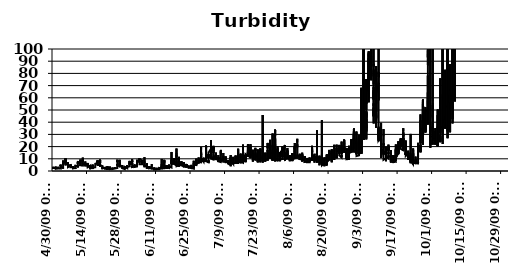
| Category | NTU+ |
|---|---|
| 10/13/09 | 278.3 |
| 10/13/09 | 351.7 |
| 10/13/09 | 341.5 |
| 10/13/09 | 374.3 |
| 10/13/09 | 356.8 |
| 10/13/09 | 467.9 |
| 10/13/09 | 334.9 |
| 10/13/09 | 360.1 |
| 10/13/09 | 397 |
| 10/13/09 | 462.3 |
| 10/13/09 | 480.1 |
| 10/13/09 | 417.3 |
| 10/13/09 | 397 |
| 10/13/09 | 322.1 |
| 10/13/09 | 398.7 |
| 10/13/09 | 443.3 |
| 10/13/09 | 431.3 |
| 10/13/09 | 326.5 |
| 10/13/09 | 324.2 |
| 10/13/09 | 279.3 |
| 10/13/09 | 333.7 |
| 10/13/09 | 413.7 |
| 10/13/09 | 371 |
| 10/13/09 | 259.3 |
| 10/13/09 | 312.1 |
| 10/13/09 | 371.3 |
| 10/13/09 | 406.8 |
| 10/13/09 | 246 |
| 10/13/09 | 353 |
| 10/13/09 | 290.1 |
| 10/13/09 | 267.4 |
| 10/13/09 | 258.8 |
| 10/12/09 | 231.3 |
| 10/12/09 | 265.2 |
| 10/12/09 | 323.3 |
| 10/12/09 | 389.3 |
| 10/12/09 | 247.5 |
| 10/12/09 | 388.7 |
| 10/12/09 | 309.3 |
| 10/12/09 | 401.6 |
| 10/12/09 | 286.8 |
| 10/12/09 | 346.5 |
| 10/12/09 | 309.7 |
| 10/12/09 | 262 |
| 10/12/09 | 407.6 |
| 10/12/09 | 256.8 |
| 10/12/09 | 244.1 |
| 10/12/09 | 292.5 |
| 10/12/09 | 343 |
| 10/12/09 | 330 |
| 10/12/09 | 330.2 |
| 10/12/09 | 268.9 |
| 10/12/09 | 172.9 |
| 10/12/09 | 297.4 |
| 10/12/09 | 386.1 |
| 10/12/09 | 366.4 |
| 10/12/09 | 293.3 |
| 10/12/09 | 247.3 |
| 10/12/09 | 261.1 |
| 10/12/09 | 246.8 |
| 10/12/09 | 314.5 |
| 10/12/09 | 267.8 |
| 10/12/09 | 249.2 |
| 10/12/09 | 360.6 |
| 10/12/09 | 311 |
| 10/12/09 | 242.1 |
| 10/12/09 | 305.1 |
| 10/12/09 | 356.8 |
| 10/12/09 | 255.4 |
| 10/12/09 | 294.5 |
| 10/12/09 | 233.5 |
| 10/12/09 | 268.3 |
| 10/12/09 | 257.7 |
| 10/12/09 | 225.5 |
| 10/12/09 | 236.6 |
| 10/12/09 | 223.3 |
| 10/12/09 | 243.2 |
| 10/12/09 | 181.4 |
| 10/12/09 | 203.1 |
| 10/12/09 | 275.2 |
| 10/11/09 | 188 |
| 10/11/09 | 259.4 |
| 10/11/09 | 214.6 |
| 10/11/09 | 223.5 |
| 10/11/09 | 187.9 |
| 10/11/09 | 250.5 |
| 10/11/09 | 194.9 |
| 10/11/09 | 180.2 |
| 10/11/09 | 167.1 |
| 10/11/09 | 175.7 |
| 10/11/09 | 244.9 |
| 10/11/09 | 192.4 |
| 10/11/09 | 234.8 |
| 10/11/09 | 199.2 |
| 10/11/09 | 176.3 |
| 10/11/09 | 192 |
| 10/11/09 | 196.7 |
| 10/11/09 | 161.6 |
| 10/11/09 | 229.2 |
| 10/11/09 | 154.7 |
| 10/11/09 | 216.6 |
| 10/11/09 | 164.1 |
| 10/11/09 | 168.3 |
| 10/11/09 | 207.1 |
| 10/11/09 | 207.8 |
| 10/11/09 | 180.9 |
| 10/11/09 | 154.1 |
| 10/11/09 | 210.3 |
| 10/11/09 | 138.2 |
| 10/11/09 | 117.1 |
| 10/11/09 | 183.8 |
| 10/11/09 | 161.6 |
| 10/11/09 | 165.5 |
| 10/11/09 | 172.6 |
| 10/11/09 | 143.6 |
| 10/11/09 | 168.5 |
| 10/11/09 | 162.3 |
| 10/11/09 | 166.5 |
| 10/11/09 | 159.9 |
| 10/11/09 | 151.6 |
| 10/11/09 | 183.7 |
| 10/11/09 | 173.5 |
| 10/11/09 | 215.2 |
| 10/11/09 | 182.6 |
| 10/11/09 | 170.6 |
| 10/11/09 | 149.2 |
| 10/11/09 | 185.9 |
| 10/11/09 | 190 |
| 10/10/09 | 144.2 |
| 10/10/09 | 136.7 |
| 10/10/09 | 181.6 |
| 10/10/09 | 107.9 |
| 10/10/09 | 125.6 |
| 10/10/09 | 152.8 |
| 10/10/09 | 103 |
| 10/10/09 | 99.2 |
| 10/10/09 | 187.7 |
| 10/10/09 | 109.3 |
| 10/10/09 | 127.7 |
| 10/10/09 | 137.6 |
| 10/10/09 | 108.8 |
| 10/10/09 | 123.5 |
| 10/10/09 | 104.4 |
| 10/10/09 | 116.7 |
| 10/10/09 | 120.9 |
| 10/10/09 | 140.1 |
| 10/10/09 | 147.8 |
| 10/10/09 | 154.3 |
| 10/10/09 | 134.5 |
| 10/10/09 | 72.2 |
| 10/10/09 | 158.1 |
| 10/10/09 | 104.5 |
| 10/10/09 | 121.8 |
| 10/10/09 | 127.5 |
| 10/10/09 | 126.6 |
| 10/10/09 | 117.8 |
| 10/10/09 | 92.7 |
| 10/10/09 | 97 |
| 10/10/09 | 118.3 |
| 10/10/09 | 130.5 |
| 10/10/09 | 96.6 |
| 10/10/09 | 141 |
| 10/10/09 | 99.2 |
| 10/10/09 | 123.4 |
| 10/10/09 | 105 |
| 10/10/09 | 165.4 |
| 10/10/09 | 92.7 |
| 10/10/09 | 81.4 |
| 10/10/09 | 114.4 |
| 10/10/09 | 92.6 |
| 10/10/09 | 142.3 |
| 10/10/09 | 124.1 |
| 10/10/09 | 112.4 |
| 10/10/09 | 71 |
| 10/10/09 | 57 |
| 10/10/09 | 77.9 |
| 10/9/09 | 123.4 |
| 10/9/09 | 72 |
| 10/9/09 | 90.5 |
| 10/9/09 | 106.5 |
| 10/9/09 | 103.2 |
| 10/9/09 | 111.6 |
| 10/9/09 | 95 |
| 10/9/09 | 89.1 |
| 10/9/09 | 76.3 |
| 10/9/09 | 99 |
| 10/9/09 | 105.6 |
| 10/9/09 | 79.4 |
| 10/9/09 | 92.7 |
| 10/9/09 | 89.6 |
| 10/9/09 | 57.4 |
| 10/9/09 | 113.1 |
| 10/9/09 | 108.4 |
| 10/9/09 | 53.5 |
| 10/9/09 | 92.5 |
| 10/9/09 | 79.1 |
| 10/9/09 | 80.3 |
| 10/9/09 | 96.2 |
| 10/9/09 | 102.9 |
| 10/9/09 | 52 |
| 10/9/09 | 61 |
| 10/9/09 | 73.4 |
| 10/9/09 | 51.7 |
| 10/9/09 | 95.4 |
| 10/9/09 | 102.8 |
| 10/9/09 | 67.5 |
| 10/9/09 | 91.2 |
| 10/9/09 | 54.4 |
| 10/9/09 | 103.6 |
| 10/9/09 | 339 |
| 10/9/09 | 53.7 |
| 10/9/09 | 79.1 |
| 10/9/09 | 90.8 |
| 10/9/09 | 52.3 |
| 10/9/09 | 51.5 |
| 10/9/09 | 39 |
| 10/9/09 | 54.4 |
| 10/9/09 | 89.7 |
| 10/9/09 | 42.5 |
| 10/9/09 | 52.8 |
| 10/9/09 | 52.8 |
| 10/9/09 | 79.8 |
| 10/9/09 | 97.6 |
| 10/9/09 | 55.6 |
| 10/8/09 | 65.3 |
| 10/8/09 | 67.8 |
| 10/8/09 | 58.9 |
| 10/8/09 | 53.3 |
| 10/8/09 | 77.9 |
| 10/8/09 | 55.8 |
| 10/8/09 | 50 |
| 10/8/09 | 31.7 |
| 10/8/09 | 60 |
| 10/8/09 | 58.5 |
| 10/8/09 | 55 |
| 10/8/09 | 75.5 |
| 10/8/09 | 57.1 |
| 10/8/09 | 59.7 |
| 10/8/09 | 67.8 |
| 10/8/09 | 60.8 |
| 10/8/09 | 54.1 |
| 10/8/09 | 53.4 |
| 10/8/09 | 55.6 |
| 10/8/09 | 87.7 |
| 10/8/09 | 53.5 |
| 10/8/09 | 53.6 |
| 10/8/09 | 51.6 |
| 10/8/09 | 54.9 |
| 10/8/09 | 57.3 |
| 10/8/09 | 49.8 |
| 10/8/09 | 55.4 |
| 10/8/09 | 52.8 |
| 10/8/09 | 61.4 |
| 10/8/09 | 81.8 |
| 10/8/09 | 75.7 |
| 10/8/09 | 74.7 |
| 10/8/09 | 49.7 |
| 10/8/09 | 52.8 |
| 10/8/09 | 68.1 |
| 10/8/09 | 68.8 |
| 10/8/09 | 49.9 |
| 10/8/09 | 72.5 |
| 10/8/09 | 63.6 |
| 10/8/09 | 50.3 |
| 10/8/09 | 54.6 |
| 10/8/09 | 51.6 |
| 10/8/09 | 65.2 |
| 10/8/09 | 69.2 |
| 10/8/09 | 53.2 |
| 10/8/09 | 56.2 |
| 10/8/09 | 51.6 |
| 10/8/09 | 50 |
| 10/7/09 | 64.2 |
| 10/7/09 | 49.5 |
| 10/7/09 | 49.5 |
| 10/7/09 | 52.5 |
| 10/7/09 | 69.6 |
| 10/7/09 | 72.8 |
| 10/7/09 | 51.8 |
| 10/7/09 | 69 |
| 10/7/09 | 50.6 |
| 10/7/09 | 50.2 |
| 10/7/09 | 55.8 |
| 10/7/09 | 57.1 |
| 10/7/09 | 56.1 |
| 10/7/09 | 105.7 |
| 10/7/09 | 46.2 |
| 10/7/09 | 60.2 |
| 10/7/09 | 46.5 |
| 10/7/09 | 137.5 |
| 10/7/09 | 41.1 |
| 10/7/09 | 62.8 |
| 10/7/09 | 46.7 |
| 10/7/09 | 35.7 |
| 10/7/09 | 85.7 |
| 10/7/09 | 59.6 |
| 10/7/09 | 33.6 |
| 10/7/09 | 50.6 |
| 10/7/09 | 177.2 |
| 10/7/09 | 65.4 |
| 10/7/09 | 116.8 |
| 10/7/09 | 49.3 |
| 10/7/09 | 54.2 |
| 10/7/09 | 26.9 |
| 10/7/09 | 56.5 |
| 10/7/09 | 63.1 |
| 10/7/09 | 60.3 |
| 10/7/09 | 174.4 |
| 10/7/09 | 119.4 |
| 10/7/09 | 45.3 |
| 10/7/09 | 32.4 |
| 10/7/09 | 200.7 |
| 10/7/09 | 57.8 |
| 10/7/09 | 56.8 |
| 10/7/09 | 74 |
| 10/7/09 | 54.9 |
| 10/7/09 | 61.4 |
| 10/7/09 | 53.6 |
| 10/7/09 | 54.6 |
| 10/7/09 | 52.8 |
| 10/6/09 | 53.1 |
| 10/6/09 | 53.5 |
| 10/6/09 | 47.2 |
| 10/6/09 | 53.6 |
| 10/6/09 | 47.5 |
| 10/6/09 | 52.6 |
| 10/6/09 | 46.9 |
| 10/6/09 | 47.8 |
| 10/6/09 | 49.1 |
| 10/6/09 | 52.4 |
| 10/6/09 | 55.5 |
| 10/6/09 | 34.7 |
| 10/6/09 | 48.9 |
| 10/6/09 | 36.5 |
| 10/6/09 | 42.5 |
| 10/6/09 | 83 |
| 10/6/09 | 45.7 |
| 10/6/09 | 48 |
| 10/6/09 | 50.6 |
| 10/6/09 | 47.5 |
| 10/6/09 | 58.1 |
| 10/6/09 | 62.4 |
| 10/6/09 | 40.3 |
| 10/6/09 | 42.4 |
| 10/6/09 | 45 |
| 10/6/09 | 44.3 |
| 10/6/09 | 57 |
| 10/6/09 | 47.3 |
| 10/6/09 | 44.1 |
| 10/6/09 | 48.4 |
| 10/6/09 | 56.3 |
| 10/6/09 | 45.6 |
| 10/6/09 | 46.4 |
| 10/6/09 | 74.3 |
| 10/6/09 | 82.3 |
| 10/6/09 | 46.4 |
| 10/6/09 | 49.9 |
| 10/6/09 | 52.9 |
| 10/6/09 | 42.2 |
| 10/6/09 | 44.9 |
| 10/6/09 | 44.4 |
| 10/6/09 | 62.5 |
| 10/6/09 | 44.5 |
| 10/6/09 | 45.2 |
| 10/6/09 | 39.9 |
| 10/6/09 | 46.1 |
| 10/6/09 | 38.8 |
| 10/6/09 | 45.3 |
| 10/5/09 | 38.6 |
| 10/5/09 | 39.1 |
| 10/5/09 | 62.7 |
| 10/5/09 | 37.6 |
| 10/5/09 | 39.5 |
| 10/5/09 | 40.3 |
| 10/5/09 | 43.2 |
| 10/5/09 | 44 |
| 10/5/09 | 44.2 |
| 10/5/09 | 45 |
| 10/5/09 | 41.3 |
| 10/5/09 | 43.1 |
| 10/5/09 | 50.7 |
| 10/5/09 | 32.2 |
| 10/5/09 | 40.8 |
| 10/5/09 | 45.9 |
| 10/5/09 | 41.8 |
| 10/5/09 | 37.4 |
| 10/5/09 | 49.5 |
| 10/5/09 | 125.3 |
| 10/5/09 | 41.4 |
| 10/5/09 | 38.4 |
| 10/5/09 | 103.8 |
| 10/5/09 | 45.8 |
| 10/5/09 | 39.4 |
| 10/5/09 | 32.4 |
| 10/5/09 | 40.4 |
| 10/5/09 | 37.2 |
| 10/5/09 | 37.1 |
| 10/5/09 | 49.3 |
| 10/5/09 | 36.8 |
| 10/5/09 | 45.1 |
| 10/5/09 | 35.8 |
| 10/5/09 | 36 |
| 10/5/09 | 35.2 |
| 10/5/09 | 38.7 |
| 10/5/09 | 39.8 |
| 10/5/09 | 37.3 |
| 10/5/09 | 33.8 |
| 10/5/09 | 30.1 |
| 10/5/09 | 32.3 |
| 10/5/09 | 50.2 |
| 10/5/09 | 37.3 |
| 10/5/09 | 33.7 |
| 10/5/09 | 22.2 |
| 10/5/09 | 33.8 |
| 10/5/09 | 36.3 |
| 10/5/09 | 35.5 |
| 10/4/09 | 36 |
| 10/4/09 | 35.6 |
| 10/4/09 | 35.1 |
| 10/4/09 | 40.1 |
| 10/4/09 | 34.4 |
| 10/4/09 | 37 |
| 10/4/09 | 35.1 |
| 10/4/09 | 33.1 |
| 10/4/09 | 31.4 |
| 10/4/09 | 36.2 |
| 10/4/09 | 41.8 |
| 10/4/09 | 40.2 |
| 10/4/09 | 35 |
| 10/4/09 | 37.3 |
| 10/4/09 | 31.3 |
| 10/4/09 | 33.9 |
| 10/4/09 | 34.7 |
| 10/4/09 | 33.4 |
| 10/4/09 | 31.9 |
| 10/4/09 | 34.2 |
| 10/4/09 | 32.4 |
| 10/4/09 | 31.8 |
| 10/4/09 | 44.4 |
| 10/4/09 | 60.5 |
| 10/4/09 | 42.1 |
| 10/4/09 | 75.9 |
| 10/4/09 | 30 |
| 10/4/09 | 29.1 |
| 10/4/09 | 28.1 |
| 10/4/09 | 26.4 |
| 10/4/09 | 28.5 |
| 10/4/09 | 25.3 |
| 10/4/09 | 29.4 |
| 10/4/09 | 27.9 |
| 10/4/09 | 24.4 |
| 10/4/09 | 24.6 |
| 10/4/09 | 23.8 |
| 10/4/09 | 25.6 |
| 10/4/09 | 28.4 |
| 10/4/09 | 23.6 |
| 10/4/09 | 24.3 |
| 10/4/09 | 24.2 |
| 10/4/09 | 25.3 |
| 10/4/09 | 24.8 |
| 10/4/09 | 25.3 |
| 10/4/09 | 24.1 |
| 10/4/09 | 27.3 |
| 10/4/09 | 25.5 |
| 10/3/09 | 24.3 |
| 10/3/09 | 25.1 |
| 10/3/09 | 25.8 |
| 10/3/09 | 22.2 |
| 10/3/09 | 22.5 |
| 10/3/09 | 23.9 |
| 10/3/09 | 21.8 |
| 10/3/09 | 25 |
| 10/3/09 | 27.8 |
| 10/3/09 | 27.6 |
| 10/3/09 | 26.7 |
| 10/3/09 | 22.7 |
| 10/3/09 | 28.6 |
| 10/3/09 | 28.4 |
| 10/3/09 | 27 |
| 10/3/09 | 35.5 |
| 10/3/09 | 30.4 |
| 10/3/09 | 30.5 |
| 10/3/09 | 31.6 |
| 10/3/09 | 36.5 |
| 10/3/09 | 36.9 |
| 10/3/09 | 29.6 |
| 10/3/09 | 28.7 |
| 10/3/09 | 45.8 |
| 10/3/09 | 31.5 |
| 10/3/09 | 31.8 |
| 10/3/09 | 28.8 |
| 10/3/09 | 29.3 |
| 10/3/09 | 26 |
| 10/3/09 | 26.9 |
| 10/3/09 | 27.4 |
| 10/3/09 | 25.3 |
| 10/3/09 | 24.2 |
| 10/3/09 | 24.2 |
| 10/3/09 | 23.6 |
| 10/3/09 | 23.9 |
| 10/3/09 | 50.4 |
| 10/3/09 | 27.3 |
| 10/3/09 | 22.8 |
| 10/3/09 | 23.2 |
| 10/3/09 | 24.9 |
| 10/3/09 | 20.6 |
| 10/3/09 | 23.6 |
| 10/3/09 | 20.7 |
| 10/3/09 | 23.2 |
| 10/3/09 | 20.1 |
| 10/3/09 | 22.7 |
| 10/3/09 | 22 |
| 10/2/09 | 22.6 |
| 10/2/09 | 26 |
| 10/2/09 | 23.6 |
| 10/2/09 | 24.5 |
| 10/2/09 | 25.3 |
| 10/2/09 | 25 |
| 10/2/09 | 21.8 |
| 10/2/09 | 22.4 |
| 10/2/09 | 21.7 |
| 10/2/09 | 22.9 |
| 10/2/09 | 26.5 |
| 10/2/09 | 26.5 |
| 10/2/09 | 25.7 |
| 10/2/09 | 24.3 |
| 10/2/09 | 24.9 |
| 10/2/09 | 23.9 |
| 10/2/09 | 27.7 |
| 10/2/09 | 23.3 |
| 10/2/09 | 23.5 |
| 10/2/09 | 23.9 |
| 10/2/09 | 32.5 |
| 10/2/09 | 25.9 |
| 10/2/09 | 26.7 |
| 10/2/09 | 32.7 |
| 10/2/09 | 26.8 |
| 10/2/09 | 29.2 |
| 10/2/09 | 33.9 |
| 10/2/09 | 35.1 |
| 10/2/09 | 34.5 |
| 10/2/09 | 24.1 |
| 10/2/09 | 26.1 |
| 10/2/09 | 23.2 |
| 10/2/09 | 21.8 |
| 10/2/09 | 21.7 |
| 10/2/09 | 30.3 |
| 10/2/09 | 32.9 |
| 10/2/09 | 31.4 |
| 10/2/09 | 31.8 |
| 10/2/09 | 31.5 |
| 10/2/09 | 30.8 |
| 10/2/09 | 31.8 |
| 10/2/09 | 31.2 |
| 10/2/09 | 27.9 |
| 10/2/09 | 29.4 |
| 10/2/09 | 27.3 |
| 10/2/09 | 26.4 |
| 10/2/09 | 29.2 |
| 10/2/09 | 26.4 |
| 10/1/09 | 27.2 |
| 10/1/09 | 26.5 |
| 10/1/09 | 26 |
| 10/1/09 | 25.8 |
| 10/1/09 | 25.4 |
| 10/1/09 | 25.6 |
| 10/1/09 | 25.2 |
| 10/1/09 | 21.6 |
| 10/1/09 | 24.2 |
| 10/1/09 | 26.9 |
| 10/1/09 | 24.9 |
| 10/1/09 | 55.8 |
| 10/1/09 | 56.5 |
| 10/1/09 | 112.1 |
| 10/1/09 | 57.5 |
| 10/1/09 | 50.5 |
| 10/1/09 | 50.2 |
| 10/1/09 | 43.1 |
| 10/1/09 | 54.1 |
| 10/1/09 | 44.2 |
| 10/1/09 | 46.1 |
| 10/1/09 | 45.1 |
| 10/1/09 | 43.8 |
| 10/1/09 | 33.8 |
| 10/1/09 | 37.2 |
| 10/1/09 | 34.3 |
| 10/1/09 | 33.9 |
| 10/1/09 | 34.5 |
| 10/1/09 | 34.6 |
| 10/1/09 | 32 |
| 10/1/09 | 32.5 |
| 10/1/09 | 39.2 |
| 10/1/09 | 35.1 |
| 10/1/09 | 36 |
| 10/1/09 | 33.6 |
| 10/1/09 | 34.2 |
| 10/1/09 | 32.1 |
| 10/1/09 | 29.7 |
| 10/1/09 | 31.9 |
| 10/1/09 | 32 |
| 10/1/09 | 31 |
| 10/1/09 | 31.2 |
| 10/1/09 | 34 |
| 10/1/09 | 31.5 |
| 10/1/09 | 30.2 |
| 10/1/09 | 27.5 |
| 10/1/09 | 28.9 |
| 10/1/09 | 28.1 |
| 9/30/09 | 27.7 |
| 9/30/09 | 27.7 |
| 9/30/09 | 27.5 |
| 9/30/09 | 27.6 |
| 9/30/09 | 27.6 |
| 9/30/09 | 23.4 |
| 9/30/09 | 23.2 |
| 9/30/09 | 24.7 |
| 9/30/09 | 24.5 |
| 9/30/09 | 21.5 |
| 9/30/09 | 22.4 |
| 9/30/09 | 22.2 |
| 9/30/09 | 23.6 |
| 9/30/09 | 24.6 |
| 9/30/09 | 23.8 |
| 9/30/09 | 22.6 |
| 9/30/09 | 24.7 |
| 9/30/09 | 25.6 |
| 9/30/09 | 33.9 |
| 9/30/09 | 33 |
| 9/30/09 | 35.8 |
| 9/30/09 | 31.7 |
| 9/30/09 | 29.3 |
| 9/30/09 | 21.6 |
| 9/30/09 | 23 |
| 9/30/09 | 22.2 |
| 9/30/09 | 22.7 |
| 9/30/09 | 21.9 |
| 9/30/09 | 20.9 |
| 9/30/09 | 20.6 |
| 9/30/09 | 21 |
| 9/30/09 | 19.1 |
| 9/30/09 | 405 |
| 9/30/09 | 254.8 |
| 9/30/09 | 193.4 |
| 9/30/09 | 349 |
| 9/30/09 | 346.5 |
| 9/30/09 | 355.3 |
| 9/30/09 | 255.5 |
| 9/30/09 | 344.3 |
| 9/30/09 | 363.3 |
| 9/30/09 | 180 |
| 9/30/09 | 310.7 |
| 9/30/09 | 314.4 |
| 9/30/09 | 266.2 |
| 9/30/09 | 23.5 |
| 9/30/09 | 25.7 |
| 9/30/09 | 103.1 |
| 9/29/09 | 86.7 |
| 9/29/09 | 92.3 |
| 9/29/09 | 95 |
| 9/29/09 | 97.7 |
| 9/29/09 | 100 |
| 9/29/09 | 93 |
| 9/29/09 | 96 |
| 9/29/09 | 96.3 |
| 9/29/09 | 98.9 |
| 9/29/09 | 93.1 |
| 9/29/09 | 57 |
| 9/29/09 | 78.2 |
| 9/29/09 | 78.9 |
| 9/29/09 | 51.7 |
| 9/29/09 | 64.4 |
| 9/29/09 | 42.3 |
| 9/29/09 | 48.9 |
| 9/29/09 | 57.1 |
| 9/29/09 | 57.2 |
| 9/29/09 | 54.3 |
| 9/29/09 | 48.8 |
| 9/29/09 | 52 |
| 9/29/09 | 44.4 |
| 9/29/09 | 46.2 |
| 9/29/09 | 45.8 |
| 9/29/09 | 44.2 |
| 9/29/09 | 46.5 |
| 9/29/09 | 52.1 |
| 9/29/09 | 57.9 |
| 9/29/09 | 47.3 |
| 9/29/09 | 42.1 |
| 9/29/09 | 42.3 |
| 9/29/09 | 42.8 |
| 9/29/09 | 39.6 |
| 9/29/09 | 47.4 |
| 9/29/09 | 51.6 |
| 9/29/09 | 50.7 |
| 9/29/09 | 42 |
| 9/29/09 | 42.6 |
| 9/29/09 | 40.3 |
| 9/29/09 | 42.9 |
| 9/29/09 | 41.2 |
| 9/29/09 | 38 |
| 9/29/09 | 39.4 |
| 9/29/09 | 42.9 |
| 9/29/09 | 60 |
| 9/29/09 | 50.7 |
| 9/29/09 | 47.9 |
| 9/28/09 | 50.8 |
| 9/28/09 | 49.3 |
| 9/28/09 | 46.4 |
| 9/28/09 | 45.4 |
| 9/28/09 | 44.8 |
| 9/28/09 | 45.8 |
| 9/28/09 | 44.6 |
| 9/28/09 | 43.3 |
| 9/28/09 | 41 |
| 9/28/09 | 37.8 |
| 9/28/09 | 34.7 |
| 9/28/09 | 41.1 |
| 9/28/09 | 45.8 |
| 9/28/09 | 40.1 |
| 9/28/09 | 40.4 |
| 9/28/09 | 39.2 |
| 9/28/09 | 39.4 |
| 9/28/09 | 35.2 |
| 9/28/09 | 37.6 |
| 9/28/09 | 37 |
| 9/28/09 | 37.6 |
| 9/28/09 | 33.5 |
| 9/28/09 | 37.4 |
| 9/28/09 | 31.5 |
| 9/28/09 | 31.8 |
| 9/28/09 | 35.9 |
| 9/28/09 | 41.4 |
| 9/28/09 | 52.4 |
| 9/28/09 | 38.2 |
| 9/28/09 | 41.9 |
| 9/28/09 | 48.1 |
| 9/28/09 | 46.9 |
| 9/28/09 | 33.5 |
| 9/28/09 | 47.5 |
| 9/28/09 | 40.3 |
| 9/28/09 | 44.6 |
| 9/28/09 | 35.8 |
| 9/28/09 | 39 |
| 9/28/09 | 41.4 |
| 9/28/09 | 49.8 |
| 9/28/09 | 48.4 |
| 9/28/09 | 36.3 |
| 9/28/09 | 44.4 |
| 9/28/09 | 32.3 |
| 9/28/09 | 36.8 |
| 9/28/09 | 41.3 |
| 9/28/09 | 34.5 |
| 9/28/09 | 45.5 |
| 9/27/09 | 29.5 |
| 9/27/09 | 29 |
| 9/27/09 | 28.6 |
| 9/27/09 | 28.9 |
| 9/27/09 | 33.8 |
| 9/27/09 | 27.9 |
| 9/27/09 | 21.4 |
| 9/27/09 | 27.6 |
| 9/27/09 | 32.6 |
| 9/27/09 | 30.2 |
| 9/27/09 | 29.5 |
| 9/27/09 | 26.8 |
| 9/27/09 | 34.8 |
| 9/27/09 | 37.5 |
| 9/27/09 | 26.3 |
| 9/27/09 | 30.6 |
| 9/27/09 | 37.5 |
| 9/27/09 | 27.6 |
| 9/27/09 | 33.1 |
| 9/27/09 | 31.5 |
| 9/27/09 | 32.3 |
| 9/27/09 | 58.7 |
| 9/27/09 | 56.4 |
| 9/27/09 | 37.4 |
| 9/27/09 | 57.1 |
| 9/27/09 | 40.2 |
| 9/27/09 | 55 |
| 9/27/09 | 45.7 |
| 9/27/09 | 48 |
| 9/27/09 | 46.6 |
| 9/27/09 | 58.1 |
| 9/27/09 | 43.8 |
| 9/27/09 | 33.4 |
| 9/27/09 | 46.5 |
| 9/27/09 | 43.2 |
| 9/27/09 | 33.4 |
| 9/27/09 | 30.8 |
| 9/27/09 | 45.4 |
| 9/27/09 | 38.6 |
| 9/27/09 | 44.4 |
| 9/27/09 | 51.3 |
| 9/27/09 | 32.9 |
| 9/27/09 | 38.5 |
| 9/27/09 | 44 |
| 9/27/09 | 45.9 |
| 9/27/09 | 42.7 |
| 9/27/09 | 41.6 |
| 9/27/09 | 35.8 |
| 9/26/09 | 33.3 |
| 9/26/09 | 29.7 |
| 9/26/09 | 41.6 |
| 9/26/09 | 40.6 |
| 9/26/09 | 29.3 |
| 9/26/09 | 28 |
| 9/26/09 | 32 |
| 9/26/09 | 46.4 |
| 9/26/09 | 36.1 |
| 9/26/09 | 27.9 |
| 9/26/09 | 33.6 |
| 9/26/09 | 31.6 |
| 9/26/09 | 33.6 |
| 9/26/09 | 30.5 |
| 9/26/09 | 31.8 |
| 9/26/09 | 28.1 |
| 9/26/09 | 26.2 |
| 9/26/09 | 30.5 |
| 9/26/09 | 25.3 |
| 9/26/09 | 29 |
| 9/26/09 | 26 |
| 9/26/09 | 25.8 |
| 9/26/09 | 29.3 |
| 9/26/09 | 22.8 |
| 9/26/09 | 23.2 |
| 9/26/09 | 23.8 |
| 9/26/09 | 22.7 |
| 9/26/09 | 27.2 |
| 9/26/09 | 25.5 |
| 9/26/09 | 22.5 |
| 9/26/09 | 18.6 |
| 9/26/09 | 18.7 |
| 9/26/09 | 16.5 |
| 9/26/09 | 18.3 |
| 9/26/09 | 17.1 |
| 9/26/09 | 21.5 |
| 9/26/09 | 17.6 |
| 9/26/09 | 15.3 |
| 9/26/09 | 17.2 |
| 9/26/09 | 18.2 |
| 9/26/09 | 21.1 |
| 9/26/09 | 15.5 |
| 9/26/09 | 20.2 |
| 9/26/09 | 21.6 |
| 9/26/09 | 16.2 |
| 9/26/09 | 18 |
| 9/26/09 | 18.8 |
| 9/26/09 | 18.3 |
| 9/25/09 | 17.7 |
| 9/25/09 | 18.2 |
| 9/25/09 | 17.2 |
| 9/25/09 | 15.5 |
| 9/25/09 | 13.5 |
| 9/25/09 | 12.5 |
| 9/25/09 | 11.4 |
| 9/25/09 | 11.8 |
| 9/25/09 | 13.6 |
| 9/25/09 | 13.3 |
| 9/25/09 | 13.2 |
| 9/25/09 | 13.9 |
| 9/25/09 | 14 |
| 9/25/09 | 14.7 |
| 9/25/09 | 15.5 |
| 9/25/09 | 15.8 |
| 9/25/09 | 15 |
| 9/25/09 | 15.3 |
| 9/25/09 | 17.2 |
| 9/25/09 | 19.8 |
| 9/25/09 | 15.1 |
| 9/25/09 | 18.3 |
| 9/25/09 | 16.5 |
| 9/25/09 | 19.8 |
| 9/25/09 | 18.2 |
| 9/25/09 | 21.8 |
| 9/25/09 | 16.1 |
| 9/25/09 | 16.6 |
| 9/25/09 | 20 |
| 9/25/09 | 23.1 |
| 9/25/09 | 21.5 |
| 9/25/09 | 19.5 |
| 9/25/09 | 17.3 |
| 9/25/09 | 15.9 |
| 9/25/09 | 15.6 |
| 9/25/09 | 13.3 |
| 9/25/09 | 11.1 |
| 9/25/09 | 10 |
| 9/25/09 | 10.1 |
| 9/25/09 | 9 |
| 9/25/09 | 7.3 |
| 9/25/09 | 6.4 |
| 9/25/09 | 6.6 |
| 9/25/09 | 7.6 |
| 9/25/09 | 6.2 |
| 9/25/09 | 6.3 |
| 9/25/09 | 6.9 |
| 9/25/09 | 6.4 |
| 9/24/09 | 6.4 |
| 9/24/09 | 6.1 |
| 9/24/09 | 6.7 |
| 9/24/09 | 6.2 |
| 9/24/09 | 8.3 |
| 9/24/09 | 6.8 |
| 9/24/09 | 7.2 |
| 9/24/09 | 6.5 |
| 9/24/09 | 8.1 |
| 9/24/09 | 6.5 |
| 9/24/09 | 7.1 |
| 9/24/09 | 9.8 |
| 9/24/09 | 9.1 |
| 9/24/09 | 8.7 |
| 9/24/09 | 7.6 |
| 9/24/09 | 8.8 |
| 9/24/09 | 8.8 |
| 9/24/09 | 6.8 |
| 9/24/09 | 7.7 |
| 9/24/09 | 8 |
| 9/24/09 | 8.9 |
| 9/24/09 | 10.5 |
| 9/24/09 | 11.8 |
| 9/24/09 | 10.4 |
| 9/24/09 | 9.8 |
| 9/24/09 | 8 |
| 9/24/09 | 7.4 |
| 9/24/09 | 8.3 |
| 9/24/09 | 8.2 |
| 9/24/09 | 7.9 |
| 9/24/09 | 7.5 |
| 9/24/09 | 7.3 |
| 9/24/09 | 7.4 |
| 9/24/09 | 7.8 |
| 9/24/09 | 7.8 |
| 9/24/09 | 7.9 |
| 9/24/09 | 7.1 |
| 9/24/09 | 7.2 |
| 9/24/09 | 7.8 |
| 9/24/09 | 8.5 |
| 9/24/09 | 8.4 |
| 9/24/09 | 8.3 |
| 9/24/09 | 7.2 |
| 9/24/09 | 6 |
| 9/24/09 | 6.9 |
| 9/24/09 | 8 |
| 9/24/09 | 6.4 |
| 9/24/09 | 7 |
| 9/23/09 | 6.6 |
| 9/23/09 | 6.5 |
| 9/23/09 | 6.6 |
| 9/23/09 | 6.5 |
| 9/23/09 | 6.7 |
| 9/23/09 | 7.6 |
| 9/23/09 | 8 |
| 9/23/09 | 8.2 |
| 9/23/09 | 7.6 |
| 9/23/09 | 8.4 |
| 9/23/09 | 7.3 |
| 9/23/09 | 8.6 |
| 9/23/09 | 9 |
| 9/23/09 | 11.5 |
| 9/23/09 | 10.5 |
| 9/23/09 | 9.7 |
| 9/23/09 | 14.6 |
| 9/23/09 | 14 |
| 9/23/09 | 10.4 |
| 9/23/09 | 10.9 |
| 9/23/09 | 11.6 |
| 9/23/09 | 12.7 |
| 9/23/09 | 11.6 |
| 9/23/09 | 14.2 |
| 9/23/09 | 13.8 |
| 9/23/09 | 16.3 |
| 9/23/09 | 17.4 |
| 9/23/09 | 12.5 |
| 9/23/09 | 13.5 |
| 9/23/09 | 18.5 |
| 9/23/09 | 11.6 |
| 9/23/09 | 10.8 |
| 9/23/09 | 10.8 |
| 9/23/09 | 9.9 |
| 9/23/09 | 8.5 |
| 9/23/09 | 8.6 |
| 9/23/09 | 7.7 |
| 9/23/09 | 6.8 |
| 9/23/09 | 7.2 |
| 9/23/09 | 6.7 |
| 9/23/09 | 6.6 |
| 9/23/09 | 5.8 |
| 9/23/09 | 7.1 |
| 9/23/09 | 5.5 |
| 9/23/09 | 6.2 |
| 9/23/09 | 5.2 |
| 9/23/09 | 5.7 |
| 9/23/09 | 5.7 |
| 9/22/09 | 8.5 |
| 9/22/09 | 8.8 |
| 9/22/09 | 13.6 |
| 9/22/09 | 10.8 |
| 9/22/09 | 9.7 |
| 9/22/09 | 8.1 |
| 9/22/09 | 10.4 |
| 9/22/09 | 9 |
| 9/22/09 | 7.7 |
| 9/22/09 | 8.6 |
| 9/22/09 | 8 |
| 9/22/09 | 14.3 |
| 9/22/09 | 9.3 |
| 9/22/09 | 8.5 |
| 9/22/09 | 7.6 |
| 9/22/09 | 11.4 |
| 9/22/09 | 9.6 |
| 9/22/09 | 8.8 |
| 9/22/09 | 12.7 |
| 9/22/09 | 13.6 |
| 9/22/09 | 9.4 |
| 9/22/09 | 11 |
| 9/22/09 | 9.1 |
| 9/22/09 | 12.1 |
| 9/22/09 | 10.7 |
| 9/22/09 | 8.9 |
| 9/22/09 | 8.6 |
| 9/22/09 | 7.2 |
| 9/22/09 | 10.3 |
| 9/22/09 | 10.8 |
| 9/22/09 | 8.5 |
| 9/22/09 | 8 |
| 9/22/09 | 12.1 |
| 9/22/09 | 11.2 |
| 9/22/09 | 7.8 |
| 9/22/09 | 8 |
| 9/22/09 | 8.5 |
| 9/22/09 | 9 |
| 9/22/09 | 9.6 |
| 9/22/09 | 8.2 |
| 9/22/09 | 6.4 |
| 9/22/09 | 7.7 |
| 9/22/09 | 30.4 |
| 9/22/09 | 10.5 |
| 9/22/09 | 10.7 |
| 9/22/09 | 10.1 |
| 9/22/09 | 12.8 |
| 9/22/09 | 10.1 |
| 9/21/09 | 12.2 |
| 9/21/09 | 9.6 |
| 9/21/09 | 14.9 |
| 9/21/09 | 13.9 |
| 9/21/09 | 15 |
| 9/21/09 | 14.6 |
| 9/21/09 | 14.9 |
| 9/21/09 | 9.1 |
| 9/21/09 | 9.1 |
| 9/21/09 | 9.7 |
| 9/21/09 | 10.4 |
| 9/21/09 | 12.4 |
| 9/21/09 | 10.5 |
| 9/21/09 | 10.4 |
| 9/21/09 | 11.2 |
| 9/21/09 | 10.7 |
| 9/21/09 | 10.9 |
| 9/21/09 | 13.8 |
| 9/21/09 | 12.8 |
| 9/21/09 | 13.5 |
| 9/21/09 | 12.8 |
| 9/21/09 | 11.8 |
| 9/21/09 | 11.9 |
| 9/21/09 | 13.7 |
| 9/21/09 | 14.3 |
| 9/21/09 | 13 |
| 9/21/09 | 13.2 |
| 9/21/09 | 11.5 |
| 9/21/09 | 10.8 |
| 9/21/09 | 11.1 |
| 9/21/09 | 10.5 |
| 9/21/09 | 9.6 |
| 9/21/09 | 9.6 |
| 9/21/09 | 11.6 |
| 9/21/09 | 13.2 |
| 9/21/09 | 11 |
| 9/21/09 | 11 |
| 9/21/09 | 14.7 |
| 9/21/09 | 10.8 |
| 9/21/09 | 12.2 |
| 9/21/09 | 15.2 |
| 9/21/09 | 14.5 |
| 9/21/09 | 11.9 |
| 9/21/09 | 13.9 |
| 9/21/09 | 13.4 |
| 9/21/09 | 16.7 |
| 9/21/09 | 14.3 |
| 9/21/09 | 13.8 |
| 9/20/09 | 12.3 |
| 9/20/09 | 14.9 |
| 9/20/09 | 13.1 |
| 9/20/09 | 13 |
| 9/20/09 | 14.3 |
| 9/20/09 | 15.3 |
| 9/20/09 | 14.9 |
| 9/20/09 | 14.9 |
| 9/20/09 | 16.5 |
| 9/20/09 | 13.5 |
| 9/20/09 | 15.1 |
| 9/20/09 | 15.9 |
| 9/20/09 | 14.6 |
| 9/20/09 | 13.4 |
| 9/20/09 | 13.9 |
| 9/20/09 | 16.1 |
| 9/20/09 | 18.9 |
| 9/20/09 | 16.3 |
| 9/20/09 | 19.2 |
| 9/20/09 | 18.9 |
| 9/20/09 | 19 |
| 9/20/09 | 17.4 |
| 9/20/09 | 18.4 |
| 9/20/09 | 18.2 |
| 9/20/09 | 20.6 |
| 9/20/09 | 19.3 |
| 9/20/09 | 22.5 |
| 9/20/09 | 20.9 |
| 9/20/09 | 21.3 |
| 9/20/09 | 22.8 |
| 9/20/09 | 22.4 |
| 9/20/09 | 25 |
| 9/20/09 | 23.8 |
| 9/20/09 | 23.4 |
| 9/20/09 | 22.4 |
| 9/20/09 | 22.8 |
| 9/20/09 | 22.4 |
| 9/20/09 | 22.9 |
| 9/20/09 | 24.4 |
| 9/20/09 | 24.1 |
| 9/20/09 | 24.5 |
| 9/20/09 | 22.5 |
| 9/20/09 | 20.5 |
| 9/20/09 | 19.7 |
| 9/20/09 | 19.9 |
| 9/20/09 | 21.2 |
| 9/20/09 | 20 |
| 9/20/09 | 19.6 |
| 9/19/09 | 19.9 |
| 9/19/09 | 22.7 |
| 9/19/09 | 19.7 |
| 9/19/09 | 20.6 |
| 9/19/09 | 22.7 |
| 9/19/09 | 21 |
| 9/19/09 | 25.2 |
| 9/19/09 | 23.5 |
| 9/19/09 | 23.5 |
| 9/19/09 | 20.7 |
| 9/19/09 | 24 |
| 9/19/09 | 23.2 |
| 9/19/09 | 24 |
| 9/19/09 | 26.6 |
| 9/19/09 | 24.2 |
| 9/19/09 | 26.1 |
| 9/19/09 | 31.6 |
| 9/19/09 | 22.5 |
| 9/19/09 | 26.5 |
| 9/19/09 | 22.7 |
| 9/19/09 | 23.6 |
| 9/19/09 | 27 |
| 9/19/09 | 24.9 |
| 9/19/09 | 25.8 |
| 9/19/09 | 28.6 |
| 9/19/09 | 28.3 |
| 9/19/09 | 28.6 |
| 9/19/09 | 35.1 |
| 9/19/09 | 32.8 |
| 9/19/09 | 28.5 |
| 9/19/09 | 28.2 |
| 9/19/09 | 29.4 |
| 9/19/09 | 30.6 |
| 9/19/09 | 28.4 |
| 9/19/09 | 22.8 |
| 9/19/09 | 22.1 |
| 9/19/09 | 21.3 |
| 9/19/09 | 19 |
| 9/19/09 | 19.8 |
| 9/19/09 | 19.6 |
| 9/19/09 | 18.9 |
| 9/19/09 | 17.3 |
| 9/19/09 | 19.8 |
| 9/19/09 | 19.7 |
| 9/19/09 | 19.1 |
| 9/19/09 | 16.7 |
| 9/19/09 | 18.9 |
| 9/19/09 | 17 |
| 9/18/09 | 18.1 |
| 9/18/09 | 19.2 |
| 9/18/09 | 19.9 |
| 9/18/09 | 19.8 |
| 9/18/09 | 21.7 |
| 9/18/09 | 19.9 |
| 9/18/09 | 20.6 |
| 9/18/09 | 19.8 |
| 9/18/09 | 21.8 |
| 9/18/09 | 20.8 |
| 9/18/09 | 21.9 |
| 9/18/09 | 24.6 |
| 9/18/09 | 23.4 |
| 9/18/09 | 23.7 |
| 9/18/09 | 20.7 |
| 9/18/09 | 24.9 |
| 9/18/09 | 26 |
| 9/18/09 | 26 |
| 9/18/09 | 23.8 |
| 9/18/09 | 24.3 |
| 9/18/09 | 22.4 |
| 9/18/09 | 23.3 |
| 9/18/09 | 23.6 |
| 9/18/09 | 24.8 |
| 9/18/09 | 24.6 |
| 9/18/09 | 22.5 |
| 9/18/09 | 23.1 |
| 9/18/09 | 21.9 |
| 9/18/09 | 26 |
| 9/18/09 | 25.3 |
| 9/18/09 | 26.9 |
| 9/18/09 | 27.5 |
| 9/18/09 | 26.3 |
| 9/18/09 | 23 |
| 9/18/09 | 22.4 |
| 9/18/09 | 22.6 |
| 9/18/09 | 20.1 |
| 9/18/09 | 24.7 |
| 9/18/09 | 20.6 |
| 9/18/09 | 20.9 |
| 9/18/09 | 22.8 |
| 9/18/09 | 26.6 |
| 9/18/09 | 23.3 |
| 9/18/09 | 22.1 |
| 9/18/09 | 21 |
| 9/18/09 | 20.5 |
| 9/18/09 | 20.6 |
| 9/18/09 | 21.1 |
| 9/17/09 | 19 |
| 9/17/09 | 20.5 |
| 9/17/09 | 18.6 |
| 9/17/09 | 18.3 |
| 9/17/09 | 17.3 |
| 9/17/09 | 20.1 |
| 9/17/09 | 16 |
| 9/17/09 | 19.3 |
| 9/17/09 | 19.4 |
| 9/17/09 | 17.2 |
| 9/17/09 | 15 |
| 9/17/09 | 16.1 |
| 9/17/09 | 18.2 |
| 9/17/09 | 17.7 |
| 9/17/09 | 17.8 |
| 9/17/09 | 16.7 |
| 9/17/09 | 16.2 |
| 9/17/09 | 18.3 |
| 9/17/09 | 19.9 |
| 9/17/09 | 19.8 |
| 9/17/09 | 19.6 |
| 9/17/09 | 20.1 |
| 9/17/09 | 18.7 |
| 9/17/09 | 20.7 |
| 9/17/09 | 19.9 |
| 9/17/09 | 19.9 |
| 9/17/09 | 22.5 |
| 9/17/09 | 21.1 |
| 9/17/09 | 24.3 |
| 9/17/09 | 20.2 |
| 9/17/09 | 21 |
| 9/17/09 | 18.8 |
| 9/17/09 | 20.2 |
| 9/17/09 | 20.5 |
| 9/17/09 | 16.9 |
| 9/17/09 | 16.9 |
| 9/17/09 | 14.1 |
| 9/17/09 | 18.1 |
| 9/17/09 | 18.3 |
| 9/17/09 | 16.4 |
| 9/17/09 | 14.6 |
| 9/17/09 | 16.4 |
| 9/17/09 | 15.8 |
| 9/17/09 | 16 |
| 9/17/09 | 15.3 |
| 9/17/09 | 13.7 |
| 9/17/09 | 14.9 |
| 9/17/09 | 15.3 |
| 9/16/09 | 10.8 |
| 9/16/09 | 15.2 |
| 9/16/09 | 13.9 |
| 9/16/09 | 11.7 |
| 9/16/09 | 14.5 |
| 9/16/09 | 13.8 |
| 9/16/09 | 14.4 |
| 9/16/09 | 12.8 |
| 9/16/09 | 12.9 |
| 9/16/09 | 13.1 |
| 9/16/09 | 16.2 |
| 9/16/09 | 17.8 |
| 9/16/09 | 16.2 |
| 9/16/09 | 14.6 |
| 9/16/09 | 14.3 |
| 9/16/09 | 15.5 |
| 9/16/09 | 17.1 |
| 9/16/09 | 15.9 |
| 9/16/09 | 16.6 |
| 9/16/09 | 16.8 |
| 9/16/09 | 18.5 |
| 9/16/09 | 15 |
| 9/16/09 | 16.1 |
| 9/16/09 | 16.5 |
| 9/16/09 | 20.2 |
| 9/16/09 | 21.8 |
| 9/16/09 | 21.2 |
| 9/16/09 | 19.4 |
| 9/16/09 | 18.2 |
| 9/16/09 | 18.5 |
| 9/16/09 | 15.6 |
| 9/16/09 | 13.8 |
| 9/16/09 | 14.1 |
| 9/16/09 | 10.1 |
| 9/16/09 | 11.1 |
| 9/16/09 | 8.4 |
| 9/16/09 | 8.3 |
| 9/16/09 | 8.3 |
| 9/16/09 | 7.9 |
| 9/16/09 | 8.8 |
| 9/16/09 | 8 |
| 9/16/09 | 8.1 |
| 9/16/09 | 11.2 |
| 9/16/09 | 9.5 |
| 9/16/09 | 8.3 |
| 9/16/09 | 9.8 |
| 9/16/09 | 8.4 |
| 9/16/09 | 7.5 |
| 9/15/09 | 7.8 |
| 9/15/09 | 6.8 |
| 9/15/09 | 8.3 |
| 9/15/09 | 8.8 |
| 9/15/09 | 11.7 |
| 9/15/09 | 10.6 |
| 9/15/09 | 11.6 |
| 9/15/09 | 12.3 |
| 9/15/09 | 12.6 |
| 9/15/09 | 12.2 |
| 9/15/09 | 12.9 |
| 9/15/09 | 12.3 |
| 9/15/09 | 12.6 |
| 9/15/09 | 13 |
| 9/15/09 | 8.6 |
| 9/15/09 | 12.7 |
| 9/15/09 | 11.7 |
| 9/15/09 | 11.5 |
| 9/15/09 | 12 |
| 9/15/09 | 13.1 |
| 9/15/09 | 11.9 |
| 9/15/09 | 11.7 |
| 9/15/09 | 11.3 |
| 9/15/09 | 11.8 |
| 9/15/09 | 10.5 |
| 9/15/09 | 9.4 |
| 9/15/09 | 11.5 |
| 9/15/09 | 9.4 |
| 9/15/09 | 9.2 |
| 9/15/09 | 10.3 |
| 9/15/09 | 11 |
| 9/15/09 | 9.2 |
| 9/15/09 | 9.9 |
| 9/15/09 | 9.1 |
| 9/15/09 | 7.9 |
| 9/15/09 | 9.3 |
| 9/15/09 | 7.9 |
| 9/15/09 | 7.6 |
| 9/15/09 | 8.9 |
| 9/15/09 | 8.4 |
| 9/15/09 | 9 |
| 9/15/09 | 6.5 |
| 9/15/09 | 7.7 |
| 9/15/09 | 8.9 |
| 9/15/09 | 9.4 |
| 9/15/09 | 8.3 |
| 9/15/09 | 8.8 |
| 9/15/09 | 8.9 |
| 9/14/09 | 8.4 |
| 9/14/09 | 9.4 |
| 9/14/09 | 9.1 |
| 9/14/09 | 8.6 |
| 9/14/09 | 11.3 |
| 9/14/09 | 11.4 |
| 9/14/09 | 10.9 |
| 9/14/09 | 11.8 |
| 9/14/09 | 12.3 |
| 9/14/09 | 11.6 |
| 9/14/09 | 10.4 |
| 9/14/09 | 11.6 |
| 9/14/09 | 13.1 |
| 9/14/09 | 12.3 |
| 9/14/09 | 12.5 |
| 9/14/09 | 13.4 |
| 9/14/09 | 13.7 |
| 9/14/09 | 11.3 |
| 9/14/09 | 13.4 |
| 9/14/09 | 17.2 |
| 9/14/09 | 15.3 |
| 9/14/09 | 12 |
| 9/14/09 | 10.1 |
| 9/14/09 | 11.5 |
| 9/14/09 | 10.6 |
| 9/14/09 | 9.8 |
| 9/14/09 | 6.9 |
| 9/14/09 | 8.1 |
| 9/14/09 | 8.6 |
| 9/14/09 | 10.9 |
| 9/14/09 | 10.4 |
| 9/14/09 | 10 |
| 9/14/09 | 10.7 |
| 9/14/09 | 10.3 |
| 9/14/09 | 8.8 |
| 9/14/09 | 9.7 |
| 9/14/09 | 7.3 |
| 9/14/09 | 8.7 |
| 9/14/09 | 8.3 |
| 9/14/09 | 8.6 |
| 9/14/09 | 10 |
| 9/14/09 | 9 |
| 9/14/09 | 9 |
| 9/14/09 | 9.9 |
| 9/14/09 | 10.7 |
| 9/14/09 | 11.4 |
| 9/14/09 | 10.6 |
| 9/14/09 | 12.2 |
| 9/13/09 | 12.2 |
| 9/13/09 | 11.1 |
| 9/13/09 | 10.8 |
| 9/13/09 | 11.1 |
| 9/13/09 | 12.9 |
| 9/13/09 | 12.8 |
| 9/13/09 | 13 |
| 9/13/09 | 13.9 |
| 9/13/09 | 13.6 |
| 9/13/09 | 13.9 |
| 9/13/09 | 13.6 |
| 9/13/09 | 13.7 |
| 9/13/09 | 15.3 |
| 9/13/09 | 14 |
| 9/13/09 | 16 |
| 9/13/09 | 16.5 |
| 9/13/09 | 16 |
| 9/13/09 | 18.3 |
| 9/13/09 | 17.2 |
| 9/13/09 | 18.2 |
| 9/13/09 | 17.5 |
| 9/13/09 | 19 |
| 9/13/09 | 21.6 |
| 9/13/09 | 18.4 |
| 9/13/09 | 18.4 |
| 9/13/09 | 20.4 |
| 9/13/09 | 17.5 |
| 9/13/09 | 18.1 |
| 9/13/09 | 19.9 |
| 9/13/09 | 18.6 |
| 9/13/09 | 17.9 |
| 9/13/09 | 16.4 |
| 9/13/09 | 18.1 |
| 9/13/09 | 17.6 |
| 9/13/09 | 18.6 |
| 9/13/09 | 18 |
| 9/13/09 | 16.1 |
| 9/13/09 | 14.9 |
| 9/13/09 | 13.7 |
| 9/13/09 | 11.3 |
| 9/13/09 | 10.2 |
| 9/13/09 | 10.4 |
| 9/13/09 | 10.5 |
| 9/13/09 | 9.6 |
| 9/13/09 | 10.7 |
| 9/13/09 | 9.9 |
| 9/13/09 | 10.6 |
| 9/13/09 | 9.6 |
| 9/12/09 | 11.7 |
| 9/12/09 | 10.5 |
| 9/12/09 | 10.3 |
| 9/12/09 | 10.6 |
| 9/12/09 | 10.7 |
| 9/12/09 | 12 |
| 9/12/09 | 12.5 |
| 9/12/09 | 13.7 |
| 9/12/09 | 12.2 |
| 9/12/09 | 11.5 |
| 9/12/09 | 12.1 |
| 9/12/09 | 11.1 |
| 9/12/09 | 14.6 |
| 9/12/09 | 12 |
| 9/12/09 | 12.5 |
| 9/12/09 | 11 |
| 9/12/09 | 15.1 |
| 9/12/09 | 15.2 |
| 9/12/09 | 15.2 |
| 9/12/09 | 15.4 |
| 9/12/09 | 15.6 |
| 9/12/09 | 17.1 |
| 9/12/09 | 16.8 |
| 9/12/09 | 16.2 |
| 9/12/09 | 16.8 |
| 9/12/09 | 19.8 |
| 9/12/09 | 16.2 |
| 9/12/09 | 18 |
| 9/12/09 | 14.2 |
| 9/12/09 | 15.3 |
| 9/12/09 | 13.4 |
| 9/12/09 | 14.6 |
| 9/12/09 | 12.7 |
| 9/12/09 | 16.6 |
| 9/12/09 | 12.2 |
| 9/12/09 | 13.7 |
| 9/12/09 | 13.1 |
| 9/12/09 | 12.9 |
| 9/12/09 | 14.6 |
| 9/12/09 | 11 |
| 9/12/09 | 15.4 |
| 9/12/09 | 13.9 |
| 9/12/09 | 11.3 |
| 9/12/09 | 9.8 |
| 9/12/09 | 12.5 |
| 9/12/09 | 11.5 |
| 9/12/09 | 8 |
| 9/12/09 | 10.5 |
| 9/11/09 | 9.2 |
| 9/11/09 | 10.8 |
| 9/11/09 | 10.2 |
| 9/11/09 | 10.2 |
| 9/11/09 | 11.4 |
| 9/11/09 | 10.1 |
| 9/11/09 | 13.8 |
| 9/11/09 | 14.1 |
| 9/11/09 | 14.7 |
| 9/11/09 | 13.8 |
| 9/11/09 | 14.1 |
| 9/11/09 | 13.8 |
| 9/11/09 | 14 |
| 9/11/09 | 13.1 |
| 9/11/09 | 14.5 |
| 9/11/09 | 16.1 |
| 9/11/09 | 15.1 |
| 9/11/09 | 16.3 |
| 9/11/09 | 13.3 |
| 9/11/09 | 15.3 |
| 9/11/09 | 14.2 |
| 9/11/09 | 15 |
| 9/11/09 | 16.1 |
| 9/11/09 | 17 |
| 9/11/09 | 17.2 |
| 9/11/09 | 17.7 |
| 9/11/09 | 27.9 |
| 9/11/09 | 29.4 |
| 9/11/09 | 31.5 |
| 9/11/09 | 34.3 |
| 9/11/09 | 28.5 |
| 9/11/09 | 26.5 |
| 9/11/09 | 26.6 |
| 9/11/09 | 22.2 |
| 9/11/09 | 21.2 |
| 9/11/09 | 21.3 |
| 9/11/09 | 20.4 |
| 9/11/09 | 20.7 |
| 9/11/09 | 22.8 |
| 9/11/09 | 19.1 |
| 9/11/09 | 20.2 |
| 9/11/09 | 19.8 |
| 9/11/09 | 18 |
| 9/11/09 | 18 |
| 9/11/09 | 15.8 |
| 9/11/09 | 17.8 |
| 9/11/09 | 17.9 |
| 9/10/09 | 16.9 |
| 9/10/09 | 18.2 |
| 9/10/09 | 15.6 |
| 9/10/09 | 16.1 |
| 9/10/09 | 15.7 |
| 9/10/09 | 16.2 |
| 9/10/09 | 16.1 |
| 9/10/09 | 16.4 |
| 9/10/09 | 16.9 |
| 9/10/09 | 18.2 |
| 9/10/09 | 19.6 |
| 9/10/09 | 18.9 |
| 9/10/09 | 19.2 |
| 9/10/09 | 19.8 |
| 9/10/09 | 19.9 |
| 9/10/09 | 18.4 |
| 9/10/09 | 17.9 |
| 9/10/09 | 17.4 |
| 9/10/09 | 19.6 |
| 9/10/09 | 17.9 |
| 9/10/09 | 20.6 |
| 9/10/09 | 18.2 |
| 9/10/09 | 16.1 |
| 9/10/09 | 18.3 |
| 9/10/09 | 25.5 |
| 9/10/09 | 17.3 |
| 9/10/09 | 19.2 |
| 9/10/09 | 39.5 |
| 9/10/09 | 15.9 |
| 9/10/09 | 16 |
| 9/10/09 | 11 |
| 9/10/09 | 10.9 |
| 9/10/09 | 13.4 |
| 9/10/09 | 11.4 |
| 9/10/09 | 14.8 |
| 9/10/09 | 11 |
| 9/10/09 | 23.8 |
| 9/10/09 | 12.2 |
| 9/10/09 | 25.9 |
| 9/10/09 | 25.2 |
| 9/10/09 | 23.9 |
| 9/10/09 | 26.8 |
| 9/10/09 | 31.8 |
| 9/10/09 | 25.1 |
| 9/10/09 | 25.1 |
| 9/10/09 | 25 |
| 9/10/09 | 27.4 |
| 9/10/09 | 28.6 |
| 9/9/09 | 25.3 |
| 9/9/09 | 28 |
| 9/9/09 | 27.2 |
| 9/9/09 | 25.5 |
| 9/9/09 | 28.6 |
| 9/9/09 | 35.2 |
| 9/9/09 | 30.4 |
| 9/9/09 | 32.9 |
| 9/9/09 | 27.4 |
| 9/9/09 | 31.2 |
| 9/9/09 | 30.5 |
| 9/9/09 | 31 |
| 9/9/09 | 30 |
| 9/9/09 | 33.3 |
| 9/9/09 | 34.3 |
| 9/9/09 | 34.5 |
| 9/9/09 | 34.5 |
| 9/9/09 | 33.3 |
| 9/9/09 | 33.3 |
| 9/9/09 | 33.4 |
| 9/9/09 | 31.4 |
| 9/9/09 | 33.8 |
| 9/9/09 | 36.3 |
| 9/9/09 | 36.1 |
| 9/9/09 | 32.5 |
| 9/9/09 | 32.6 |
| 9/9/09 | 30.8 |
| 9/9/09 | 24.4 |
| 9/9/09 | 25.4 |
| 9/9/09 | 29.4 |
| 9/9/09 | 28.7 |
| 9/9/09 | 28.1 |
| 9/9/09 | 34.7 |
| 9/9/09 | 30.3 |
| 9/9/09 | 33.4 |
| 9/9/09 | 30.7 |
| 9/9/09 | 28.3 |
| 9/9/09 | 29.8 |
| 9/9/09 | 32.6 |
| 9/9/09 | 28.8 |
| 9/9/09 | 30.8 |
| 9/9/09 | 56.3 |
| 9/9/09 | 129.8 |
| 9/9/09 | 76.9 |
| 9/9/09 | 81 |
| 9/9/09 | 71.5 |
| 9/9/09 | 57.9 |
| 9/9/09 | 72.3 |
| 9/8/09 | 61.7 |
| 9/8/09 | 59.8 |
| 9/8/09 | 58.6 |
| 9/8/09 | 82.1 |
| 9/8/09 | 73.3 |
| 9/8/09 | 70.2 |
| 9/8/09 | 63.4 |
| 9/8/09 | 52.6 |
| 9/8/09 | 35.4 |
| 9/8/09 | 63.7 |
| 9/8/09 | 55 |
| 9/8/09 | 60.9 |
| 9/8/09 | 60.1 |
| 9/8/09 | 57.5 |
| 9/8/09 | 65.2 |
| 9/8/09 | 66.1 |
| 9/8/09 | 57.4 |
| 9/8/09 | 59.2 |
| 9/8/09 | 52.4 |
| 9/8/09 | 61.6 |
| 9/8/09 | 55.7 |
| 9/8/09 | 71.3 |
| 9/8/09 | 86 |
| 9/8/09 | 51.1 |
| 9/8/09 | 76.4 |
| 9/8/09 | 57.4 |
| 9/8/09 | 56 |
| 9/8/09 | 48.7 |
| 9/8/09 | 52 |
| 9/8/09 | 48.7 |
| 9/8/09 | 52.5 |
| 9/8/09 | 44.6 |
| 9/8/09 | 47 |
| 9/8/09 | 73.7 |
| 9/8/09 | 50.1 |
| 9/8/09 | 51.2 |
| 9/8/09 | 58.6 |
| 9/8/09 | 41.3 |
| 9/8/09 | 47.6 |
| 9/8/09 | 49.5 |
| 9/8/09 | 43.6 |
| 9/8/09 | 44.2 |
| 9/8/09 | 44.8 |
| 9/8/09 | 44.5 |
| 9/8/09 | 45.2 |
| 9/8/09 | 44.6 |
| 9/8/09 | 43 |
| 9/8/09 | 45.2 |
| 9/7/09 | 45.5 |
| 9/7/09 | 39 |
| 9/7/09 | 51.4 |
| 9/7/09 | 48.2 |
| 9/7/09 | 48.4 |
| 9/7/09 | 52.5 |
| 9/7/09 | 55.5 |
| 9/7/09 | 45.3 |
| 9/7/09 | 49.2 |
| 9/7/09 | 44.7 |
| 9/7/09 | 46.6 |
| 9/7/09 | 45.6 |
| 9/7/09 | 50.8 |
| 9/7/09 | 45.4 |
| 9/7/09 | 47.5 |
| 9/7/09 | 48.1 |
| 9/7/09 | 50.9 |
| 9/7/09 | 58.2 |
| 9/7/09 | 64.9 |
| 9/7/09 | 59.2 |
| 9/7/09 | 66.2 |
| 9/7/09 | 59.2 |
| 9/7/09 | 58.3 |
| 9/7/09 | 68.1 |
| 9/7/09 | 63.1 |
| 9/7/09 | 53.2 |
| 9/7/09 | 55.1 |
| 9/7/09 | 63.1 |
| 9/7/09 | 69 |
| 9/7/09 | 67.7 |
| 9/7/09 | 67.7 |
| 9/7/09 | 80.9 |
| 9/7/09 | 82.3 |
| 9/7/09 | 78.1 |
| 9/7/09 | 70.9 |
| 9/7/09 | 76.9 |
| 9/7/09 | 83.1 |
| 9/7/09 | 77.4 |
| 9/7/09 | 87.9 |
| 9/7/09 | 85.7 |
| 9/7/09 | 114.9 |
| 9/7/09 | 155.1 |
| 9/7/09 | 105.1 |
| 9/7/09 | 139.4 |
| 9/7/09 | 108 |
| 9/7/09 | 111.9 |
| 9/7/09 | 123.5 |
| 9/7/09 | 134.1 |
| 9/6/09 | 125 |
| 9/6/09 | 105.2 |
| 9/6/09 | 151.7 |
| 9/6/09 | 99.8 |
| 9/6/09 | 123 |
| 9/6/09 | 125.8 |
| 9/6/09 | 155.9 |
| 9/6/09 | 156.7 |
| 9/6/09 | 153.5 |
| 9/6/09 | 148 |
| 9/6/09 | 126.2 |
| 9/6/09 | 148.1 |
| 9/6/09 | 153.1 |
| 9/6/09 | 156 |
| 9/6/09 | 134.8 |
| 9/6/09 | 126.5 |
| 9/6/09 | 127.9 |
| 9/6/09 | 140.6 |
| 9/6/09 | 137.2 |
| 9/6/09 | 140.1 |
| 9/6/09 | 120.2 |
| 9/6/09 | 119 |
| 9/6/09 | 117.2 |
| 9/6/09 | 117.3 |
| 9/6/09 | 115.8 |
| 9/6/09 | 123.9 |
| 9/6/09 | 117.4 |
| 9/6/09 | 119.1 |
| 9/6/09 | 126.3 |
| 9/6/09 | 126.7 |
| 9/6/09 | 111.5 |
| 9/6/09 | 119.7 |
| 9/6/09 | 111.3 |
| 9/6/09 | 116.6 |
| 9/6/09 | 106.2 |
| 9/6/09 | 86.5 |
| 9/6/09 | 114 |
| 9/6/09 | 99.2 |
| 9/6/09 | 81.5 |
| 9/6/09 | 98.2 |
| 9/6/09 | 97.8 |
| 9/6/09 | 110.7 |
| 9/6/09 | 106.3 |
| 9/6/09 | 102.3 |
| 9/6/09 | 88.6 |
| 9/6/09 | 99.1 |
| 9/6/09 | 74.4 |
| 9/6/09 | 94.5 |
| 9/5/09 | 83.1 |
| 9/5/09 | 79.5 |
| 9/5/09 | 87.6 |
| 9/5/09 | 88.4 |
| 9/5/09 | 86.2 |
| 9/5/09 | 92.7 |
| 9/5/09 | 90.8 |
| 9/5/09 | 85.9 |
| 9/5/09 | 91.4 |
| 9/5/09 | 82.8 |
| 9/5/09 | 87.5 |
| 9/5/09 | 95.8 |
| 9/5/09 | 85.4 |
| 9/5/09 | 90.5 |
| 9/5/09 | 84.4 |
| 9/5/09 | 75.3 |
| 9/5/09 | 98.1 |
| 9/5/09 | 97.5 |
| 9/5/09 | 94.2 |
| 9/5/09 | 95 |
| 9/5/09 | 70.2 |
| 9/5/09 | 87.8 |
| 9/5/09 | 70.9 |
| 9/5/09 | 77.3 |
| 9/5/09 | 81.5 |
| 9/5/09 | 97 |
| 9/5/09 | 97.6 |
| 9/5/09 | 85.8 |
| 9/5/09 | 71.1 |
| 9/5/09 | 73.9 |
| 9/5/09 | 80.7 |
| 9/5/09 | 71.6 |
| 9/5/09 | 77.2 |
| 9/5/09 | 85.3 |
| 9/5/09 | 87 |
| 9/5/09 | 67.7 |
| 9/5/09 | 60.4 |
| 9/5/09 | 72.8 |
| 9/5/09 | 77.3 |
| 9/5/09 | 76.6 |
| 9/5/09 | 69 |
| 9/5/09 | 63.1 |
| 9/5/09 | 72.7 |
| 9/5/09 | 71.7 |
| 9/5/09 | 62.9 |
| 9/5/09 | 60.5 |
| 9/5/09 | 56.3 |
| 9/5/09 | 81.3 |
| 9/4/09 | 59.8 |
| 9/4/09 | 68.2 |
| 9/4/09 | 72.4 |
| 9/4/09 | 55.4 |
| 9/4/09 | 72.8 |
| 9/4/09 | 58.3 |
| 9/4/09 | 75.4 |
| 9/4/09 | 55.5 |
| 9/4/09 | 69.5 |
| 9/4/09 | 64.8 |
| 9/4/09 | 56.1 |
| 9/4/09 | 49.8 |
| 9/4/09 | 58.3 |
| 9/4/09 | 55.5 |
| 9/4/09 | 60.4 |
| 9/4/09 | 63.3 |
| 9/4/09 | 57.8 |
| 9/4/09 | 57.3 |
| 9/4/09 | 43.9 |
| 9/4/09 | 47.5 |
| 9/4/09 | 39.5 |
| 9/4/09 | 48.6 |
| 9/4/09 | 43.5 |
| 9/4/09 | 35.6 |
| 9/4/09 | 42.4 |
| 9/4/09 | 47.5 |
| 9/4/09 | 45.3 |
| 9/4/09 | 48.9 |
| 9/4/09 | 42.4 |
| 9/4/09 | 39.4 |
| 9/4/09 | 42.7 |
| 9/4/09 | 35.1 |
| 9/4/09 | 39.4 |
| 9/4/09 | 41.7 |
| 9/4/09 | 33 |
| 9/4/09 | 36.1 |
| 9/4/09 | 36.9 |
| 9/4/09 | 35.1 |
| 9/4/09 | 31.8 |
| 9/4/09 | 34.6 |
| 9/4/09 | 38.4 |
| 9/4/09 | 26.8 |
| 9/4/09 | 25.9 |
| 9/4/09 | 31.6 |
| 9/4/09 | 33.6 |
| 9/4/09 | 37.6 |
| 9/4/09 | 35.3 |
| 9/4/09 | 34.7 |
| 9/3/09 | 36.8 |
| 9/3/09 | 32.9 |
| 9/3/09 | 102.6 |
| 9/3/09 | 81.8 |
| 9/3/09 | 99.6 |
| 9/3/09 | 88.2 |
| 9/3/09 | 69.9 |
| 9/3/09 | 93.5 |
| 9/3/09 | 89.8 |
| 9/3/09 | 75.6 |
| 9/3/09 | 81.2 |
| 9/3/09 | 91.8 |
| 9/3/09 | 71.7 |
| 9/3/09 | 121.7 |
| 9/3/09 | 69.4 |
| 9/3/09 | 108.1 |
| 9/3/09 | 60.2 |
| 9/3/09 | 62.2 |
| 9/3/09 | 128 |
| 9/3/09 | 123.8 |
| 9/3/09 | 52.7 |
| 9/3/09 | 58.7 |
| 9/3/09 | 51.3 |
| 9/3/09 | 59.2 |
| 9/3/09 | 106.1 |
| 9/3/09 | 45.8 |
| 9/3/09 | 124.3 |
| 9/3/09 | 56.7 |
| 9/3/09 | 49.7 |
| 9/3/09 | 70.8 |
| 9/3/09 | 73.5 |
| 9/3/09 | 66.9 |
| 9/3/09 | 91.9 |
| 9/3/09 | 55.5 |
| 9/3/09 | 59.6 |
| 9/3/09 | 37.1 |
| 9/3/09 | 43.9 |
| 9/3/09 | 44.8 |
| 9/3/09 | 54.9 |
| 9/3/09 | 46.2 |
| 9/3/09 | 55.1 |
| 9/3/09 | 29 |
| 9/3/09 | 31.1 |
| 9/3/09 | 44.7 |
| 9/3/09 | 47.4 |
| 9/3/09 | 29.6 |
| 9/3/09 | 58.7 |
| 9/3/09 | 25.4 |
| 9/2/09 | 44.6 |
| 9/2/09 | 31.3 |
| 9/2/09 | 51.9 |
| 9/2/09 | 48.8 |
| 9/2/09 | 57 |
| 9/2/09 | 30.1 |
| 9/2/09 | 68.2 |
| 9/2/09 | 36.4 |
| 9/2/09 | 50.2 |
| 9/2/09 | 39.2 |
| 9/2/09 | 24.7 |
| 9/2/09 | 36.3 |
| 9/2/09 | 46.9 |
| 9/2/09 | 36.9 |
| 9/2/09 | 54.1 |
| 9/2/09 | 28.7 |
| 9/2/09 | 41.3 |
| 9/2/09 | 26.5 |
| 9/2/09 | 66.2 |
| 9/2/09 | 41.9 |
| 9/2/09 | 47.9 |
| 9/2/09 | 61.5 |
| 9/2/09 | 37.9 |
| 9/2/09 | 44.5 |
| 9/2/09 | 36.2 |
| 9/2/09 | 45.5 |
| 9/2/09 | 29.9 |
| 9/2/09 | 42.2 |
| 9/2/09 | 46 |
| 9/2/09 | 21.5 |
| 9/2/09 | 33.7 |
| 9/2/09 | 31.5 |
| 9/2/09 | 41.7 |
| 9/2/09 | 25.4 |
| 9/2/09 | 21.1 |
| 9/2/09 | 21.7 |
| 9/2/09 | 18.2 |
| 9/2/09 | 15.7 |
| 9/2/09 | 14.6 |
| 9/2/09 | 19.4 |
| 9/2/09 | 55.1 |
| 9/2/09 | 17.7 |
| 9/2/09 | 17 |
| 9/2/09 | 41.4 |
| 9/2/09 | 14 |
| 9/2/09 | 19.7 |
| 9/2/09 | 14.9 |
| 9/2/09 | 14.2 |
| 9/1/09 | 14.2 |
| 9/1/09 | 14.2 |
| 9/1/09 | 15.9 |
| 9/1/09 | 14.6 |
| 9/1/09 | 17.4 |
| 9/1/09 | 16.8 |
| 9/1/09 | 18.2 |
| 9/1/09 | 17.3 |
| 9/1/09 | 18.6 |
| 9/1/09 | 18.3 |
| 9/1/09 | 22.1 |
| 9/1/09 | 17.7 |
| 9/1/09 | 17.4 |
| 9/1/09 | 22.3 |
| 9/1/09 | 20.3 |
| 9/1/09 | 20.3 |
| 9/1/09 | 20.9 |
| 9/1/09 | 19.9 |
| 9/1/09 | 19.2 |
| 9/1/09 | 20.5 |
| 9/1/09 | 21.6 |
| 9/1/09 | 23.3 |
| 9/1/09 | 21.8 |
| 9/1/09 | 28.2 |
| 9/1/09 | 23.5 |
| 9/1/09 | 29.4 |
| 9/1/09 | 24.8 |
| 9/1/09 | 20.9 |
| 9/1/09 | 21.3 |
| 9/1/09 | 24.6 |
| 9/1/09 | 26.3 |
| 9/1/09 | 26.7 |
| 9/1/09 | 26.3 |
| 9/1/09 | 22.6 |
| 9/1/09 | 25.4 |
| 9/1/09 | 23.9 |
| 9/1/09 | 24.6 |
| 9/1/09 | 27.1 |
| 9/1/09 | 20.9 |
| 9/1/09 | 20.2 |
| 9/1/09 | 17.8 |
| 9/1/09 | 16.2 |
| 9/1/09 | 16.8 |
| 9/1/09 | 14.7 |
| 9/1/09 | 13.8 |
| 9/1/09 | 13.8 |
| 9/1/09 | 13 |
| 9/1/09 | 12.8 |
| 8/31/09 | 12.2 |
| 8/31/09 | 15 |
| 8/31/09 | 13.7 |
| 8/31/09 | 16.1 |
| 8/31/09 | 15.7 |
| 8/31/09 | 17.1 |
| 8/31/09 | 14.5 |
| 8/31/09 | 16.2 |
| 8/31/09 | 14.4 |
| 8/31/09 | 14.9 |
| 8/31/09 | 14.3 |
| 8/31/09 | 18.4 |
| 8/31/09 | 17.6 |
| 8/31/09 | 21.4 |
| 8/31/09 | 18.4 |
| 8/31/09 | 19.7 |
| 8/31/09 | 19 |
| 8/31/09 | 20.1 |
| 8/31/09 | 20.5 |
| 8/31/09 | 19.3 |
| 8/31/09 | 18 |
| 8/31/09 | 20.9 |
| 8/31/09 | 20 |
| 8/31/09 | 20.1 |
| 8/31/09 | 21.2 |
| 8/31/09 | 20 |
| 8/31/09 | 20.1 |
| 8/31/09 | 24.1 |
| 8/31/09 | 21.7 |
| 8/31/09 | 19.4 |
| 8/31/09 | 19.6 |
| 8/31/09 | 18.5 |
| 8/31/09 | 19 |
| 8/31/09 | 19.1 |
| 8/31/09 | 19.3 |
| 8/31/09 | 16.6 |
| 8/31/09 | 17.7 |
| 8/31/09 | 18.1 |
| 8/31/09 | 19.3 |
| 8/31/09 | 18.6 |
| 8/31/09 | 19 |
| 8/31/09 | 19.8 |
| 8/31/09 | 16.2 |
| 8/31/09 | 16.7 |
| 8/31/09 | 32.3 |
| 8/31/09 | 22.3 |
| 8/31/09 | 23.5 |
| 8/31/09 | 21.3 |
| 8/30/09 | 27.1 |
| 8/30/09 | 24.9 |
| 8/30/09 | 18.3 |
| 8/30/09 | 33 |
| 8/30/09 | 19.3 |
| 8/30/09 | 21.4 |
| 8/30/09 | 20.7 |
| 8/30/09 | 32.4 |
| 8/30/09 | 25.3 |
| 8/30/09 | 30.4 |
| 8/30/09 | 30.5 |
| 8/30/09 | 28.8 |
| 8/30/09 | 26.8 |
| 8/30/09 | 22.7 |
| 8/30/09 | 30 |
| 8/30/09 | 25.5 |
| 8/30/09 | 34.9 |
| 8/30/09 | 24.8 |
| 8/30/09 | 26.6 |
| 8/30/09 | 22.4 |
| 8/30/09 | 25.9 |
| 8/30/09 | 29.6 |
| 8/30/09 | 29.8 |
| 8/30/09 | 27.3 |
| 8/30/09 | 22.6 |
| 8/30/09 | 22.3 |
| 8/30/09 | 30.4 |
| 8/30/09 | 26.6 |
| 8/30/09 | 27.5 |
| 8/30/09 | 26.1 |
| 8/30/09 | 25.3 |
| 8/30/09 | 27 |
| 8/30/09 | 23.2 |
| 8/30/09 | 21.7 |
| 8/30/09 | 26.9 |
| 8/30/09 | 21.6 |
| 8/30/09 | 23.3 |
| 8/30/09 | 21.8 |
| 8/30/09 | 21.8 |
| 8/30/09 | 22.4 |
| 8/30/09 | 31.5 |
| 8/30/09 | 17.4 |
| 8/30/09 | 18.1 |
| 8/30/09 | 15.5 |
| 8/30/09 | 16.8 |
| 8/30/09 | 15.8 |
| 8/30/09 | 15.9 |
| 8/30/09 | 15.8 |
| 8/29/09 | 16.2 |
| 8/29/09 | 23.7 |
| 8/29/09 | 15.8 |
| 8/29/09 | 19.4 |
| 8/29/09 | 15.3 |
| 8/29/09 | 19.9 |
| 8/29/09 | 20.2 |
| 8/29/09 | 18.4 |
| 8/29/09 | 19.6 |
| 8/29/09 | 19.8 |
| 8/29/09 | 17.5 |
| 8/29/09 | 17.6 |
| 8/29/09 | 16.6 |
| 8/29/09 | 21 |
| 8/29/09 | 18.9 |
| 8/29/09 | 19 |
| 8/29/09 | 26.2 |
| 8/29/09 | 18.3 |
| 8/29/09 | 23.3 |
| 8/29/09 | 20.1 |
| 8/29/09 | 22.1 |
| 8/29/09 | 26 |
| 8/29/09 | 20.5 |
| 8/29/09 | 22.7 |
| 8/29/09 | 21.9 |
| 8/29/09 | 24.1 |
| 8/29/09 | 22.4 |
| 8/29/09 | 23.1 |
| 8/29/09 | 24.4 |
| 8/29/09 | 23.7 |
| 8/29/09 | 23.8 |
| 8/29/09 | 22.4 |
| 8/29/09 | 19.4 |
| 8/29/09 | 17.6 |
| 8/29/09 | 19.5 |
| 8/29/09 | 18.9 |
| 8/29/09 | 19.8 |
| 8/29/09 | 17.3 |
| 8/29/09 | 17.8 |
| 8/29/09 | 18.9 |
| 8/29/09 | 23.2 |
| 8/29/09 | 20.1 |
| 8/29/09 | 18.1 |
| 8/29/09 | 20.1 |
| 8/29/09 | 17.6 |
| 8/29/09 | 17.6 |
| 8/29/09 | 15.7 |
| 8/29/09 | 15.7 |
| 8/28/09 | 14.6 |
| 8/28/09 | 14.6 |
| 8/28/09 | 14.5 |
| 8/28/09 | 13.3 |
| 8/28/09 | 15.4 |
| 8/28/09 | 14.9 |
| 8/28/09 | 15.6 |
| 8/28/09 | 14.7 |
| 8/28/09 | 13.6 |
| 8/28/09 | 15.9 |
| 8/28/09 | 16.4 |
| 8/28/09 | 16.3 |
| 8/28/09 | 20.7 |
| 8/28/09 | 16.8 |
| 8/28/09 | 16.6 |
| 8/28/09 | 17.5 |
| 8/28/09 | 16 |
| 8/28/09 | 18.4 |
| 8/28/09 | 15.9 |
| 8/28/09 | 16.8 |
| 8/28/09 | 18.5 |
| 8/28/09 | 19.5 |
| 8/28/09 | 19.4 |
| 8/28/09 | 16 |
| 8/28/09 | 16 |
| 8/28/09 | 17 |
| 8/28/09 | 15.5 |
| 8/28/09 | 16.4 |
| 8/28/09 | 17.8 |
| 8/28/09 | 19.5 |
| 8/28/09 | 17.1 |
| 8/28/09 | 17.9 |
| 8/28/09 | 17.1 |
| 8/28/09 | 16.9 |
| 8/28/09 | 15.7 |
| 8/28/09 | 17.3 |
| 8/28/09 | 17.5 |
| 8/28/09 | 15.4 |
| 8/28/09 | 12.9 |
| 8/28/09 | 14.4 |
| 8/28/09 | 12 |
| 8/28/09 | 11.5 |
| 8/28/09 | 10.9 |
| 8/28/09 | 11.8 |
| 8/28/09 | 9.5 |
| 8/28/09 | 10.8 |
| 8/28/09 | 9.9 |
| 8/28/09 | 9.6 |
| 8/27/09 | 9.6 |
| 8/27/09 | 9.4 |
| 8/27/09 | 10.1 |
| 8/27/09 | 10.3 |
| 8/27/09 | 11.7 |
| 8/27/09 | 14.9 |
| 8/27/09 | 11.3 |
| 8/27/09 | 11.6 |
| 8/27/09 | 10.8 |
| 8/27/09 | 12.4 |
| 8/27/09 | 13.1 |
| 8/27/09 | 15.1 |
| 8/27/09 | 16.2 |
| 8/27/09 | 18.7 |
| 8/27/09 | 11.6 |
| 8/27/09 | 14.3 |
| 8/27/09 | 13.6 |
| 8/27/09 | 15.8 |
| 8/27/09 | 14.3 |
| 8/27/09 | 15.9 |
| 8/27/09 | 18.4 |
| 8/27/09 | 15.1 |
| 8/27/09 | 14 |
| 8/27/09 | 12.3 |
| 8/27/09 | 14 |
| 8/27/09 | 14.1 |
| 8/27/09 | 13.3 |
| 8/27/09 | 12 |
| 8/27/09 | 11.3 |
| 8/27/09 | 11.8 |
| 8/27/09 | 10.8 |
| 8/27/09 | 10.7 |
| 8/27/09 | 11.6 |
| 8/27/09 | 10.2 |
| 8/27/09 | 11.8 |
| 8/27/09 | 10.1 |
| 8/27/09 | 11.2 |
| 8/27/09 | 10.3 |
| 8/27/09 | 10.5 |
| 8/27/09 | 11.5 |
| 8/27/09 | 10.5 |
| 8/27/09 | 10.1 |
| 8/27/09 | 12.4 |
| 8/27/09 | 10 |
| 8/27/09 | 9.6 |
| 8/27/09 | 9.3 |
| 8/27/09 | 18.1 |
| 8/27/09 | 18 |
| 8/26/09 | 18.7 |
| 8/26/09 | 16.4 |
| 8/26/09 | 19.6 |
| 8/26/09 | 17.7 |
| 8/26/09 | 18.3 |
| 8/26/09 | 18.6 |
| 8/26/09 | 20.7 |
| 8/26/09 | 17.1 |
| 8/26/09 | 19.4 |
| 8/26/09 | 24 |
| 8/26/09 | 18.8 |
| 8/26/09 | 21.5 |
| 8/26/09 | 21.1 |
| 8/26/09 | 20.5 |
| 8/26/09 | 24.7 |
| 8/26/09 | 25.8 |
| 8/26/09 | 21.6 |
| 8/26/09 | 21.7 |
| 8/26/09 | 22.9 |
| 8/26/09 | 20.8 |
| 8/26/09 | 19 |
| 8/26/09 | 23.5 |
| 8/26/09 | 25.6 |
| 8/26/09 | 23.4 |
| 8/26/09 | 25.5 |
| 8/26/09 | 19.9 |
| 8/26/09 | 19.2 |
| 8/26/09 | 17.2 |
| 8/26/09 | 17.7 |
| 8/26/09 | 16.4 |
| 8/26/09 | 18.4 |
| 8/26/09 | 18.3 |
| 8/26/09 | 16.8 |
| 8/26/09 | 19.8 |
| 8/26/09 | 17.8 |
| 8/26/09 | 17.3 |
| 8/26/09 | 15.2 |
| 8/26/09 | 16.7 |
| 8/26/09 | 16.5 |
| 8/26/09 | 19.6 |
| 8/26/09 | 18.9 |
| 8/26/09 | 19.7 |
| 8/26/09 | 20 |
| 8/26/09 | 15.2 |
| 8/26/09 | 17.8 |
| 8/26/09 | 18.1 |
| 8/26/09 | 16.7 |
| 8/26/09 | 16.7 |
| 8/25/09 | 16.7 |
| 8/25/09 | 18 |
| 8/25/09 | 19.5 |
| 8/25/09 | 19 |
| 8/25/09 | 18.4 |
| 8/25/09 | 16.5 |
| 8/25/09 | 16.4 |
| 8/25/09 | 18.8 |
| 8/25/09 | 15.7 |
| 8/25/09 | 16.6 |
| 8/25/09 | 13.8 |
| 8/25/09 | 18.1 |
| 8/25/09 | 15.7 |
| 8/25/09 | 17 |
| 8/25/09 | 16.7 |
| 8/25/09 | 16.9 |
| 8/25/09 | 16.2 |
| 8/25/09 | 19.5 |
| 8/25/09 | 16.7 |
| 8/25/09 | 16.5 |
| 8/25/09 | 19.4 |
| 8/25/09 | 16 |
| 8/25/09 | 16.3 |
| 8/25/09 | 18.3 |
| 8/25/09 | 17.9 |
| 8/25/09 | 19.9 |
| 8/25/09 | 21.1 |
| 8/25/09 | 14.8 |
| 8/25/09 | 18.9 |
| 8/25/09 | 24.1 |
| 8/25/09 | 18.8 |
| 8/25/09 | 20 |
| 8/25/09 | 19.9 |
| 8/25/09 | 19.9 |
| 8/25/09 | 19.6 |
| 8/25/09 | 16.9 |
| 8/25/09 | 14.9 |
| 8/25/09 | 15.3 |
| 8/25/09 | 13.7 |
| 8/25/09 | 12.7 |
| 8/25/09 | 13.5 |
| 8/25/09 | 13 |
| 8/25/09 | 11.2 |
| 8/25/09 | 11.5 |
| 8/25/09 | 12.9 |
| 8/25/09 | 11.9 |
| 8/25/09 | 11 |
| 8/25/09 | 11.6 |
| 8/24/09 | 12.9 |
| 8/24/09 | 13.5 |
| 8/24/09 | 13.5 |
| 8/24/09 | 13.1 |
| 8/24/09 | 13.8 |
| 8/24/09 | 15.1 |
| 8/24/09 | 14.6 |
| 8/24/09 | 16.7 |
| 8/24/09 | 14.3 |
| 8/24/09 | 16.8 |
| 8/24/09 | 15 |
| 8/24/09 | 15.5 |
| 8/24/09 | 14.9 |
| 8/24/09 | 16.8 |
| 8/24/09 | 19.2 |
| 8/24/09 | 18.4 |
| 8/24/09 | 18.6 |
| 8/24/09 | 16.1 |
| 8/24/09 | 16.4 |
| 8/24/09 | 17.3 |
| 8/24/09 | 17.1 |
| 8/24/09 | 17.8 |
| 8/24/09 | 19.5 |
| 8/24/09 | 21 |
| 8/24/09 | 21.1 |
| 8/24/09 | 19.7 |
| 8/24/09 | 16.8 |
| 8/24/09 | 14.9 |
| 8/24/09 | 18.2 |
| 8/24/09 | 21.4 |
| 8/24/09 | 20.1 |
| 8/24/09 | 20.2 |
| 8/24/09 | 20.1 |
| 8/24/09 | 20.7 |
| 8/24/09 | 20 |
| 8/24/09 | 20.4 |
| 8/24/09 | 20 |
| 8/24/09 | 21.2 |
| 8/24/09 | 16.9 |
| 8/24/09 | 19.9 |
| 8/24/09 | 20 |
| 8/24/09 | 21.2 |
| 8/24/09 | 19.9 |
| 8/24/09 | 20.7 |
| 8/24/09 | 18.3 |
| 8/24/09 | 18.9 |
| 8/24/09 | 16.2 |
| 8/24/09 | 17.2 |
| 8/23/09 | 15.9 |
| 8/23/09 | 16.1 |
| 8/23/09 | 14.6 |
| 8/23/09 | 15.4 |
| 8/23/09 | 12.8 |
| 8/23/09 | 13.4 |
| 8/23/09 | 13.4 |
| 8/23/09 | 11.5 |
| 8/23/09 | 12.8 |
| 8/23/09 | 13.7 |
| 8/23/09 | 14.1 |
| 8/23/09 | 15.1 |
| 8/23/09 | 18 |
| 8/23/09 | 16.4 |
| 8/23/09 | 16.9 |
| 8/23/09 | 17.3 |
| 8/23/09 | 17.1 |
| 8/23/09 | 19 |
| 8/23/09 | 17 |
| 8/23/09 | 17.4 |
| 8/23/09 | 16.7 |
| 8/23/09 | 15.5 |
| 8/23/09 | 16.3 |
| 8/23/09 | 15.5 |
| 8/23/09 | 16.6 |
| 8/23/09 | 17 |
| 8/23/09 | 16.8 |
| 8/23/09 | 16.8 |
| 8/23/09 | 18.1 |
| 8/23/09 | 18.4 |
| 8/23/09 | 21.6 |
| 8/23/09 | 20.2 |
| 8/23/09 | 19.3 |
| 8/23/09 | 17.8 |
| 8/23/09 | 17.5 |
| 8/23/09 | 18.9 |
| 8/23/09 | 18.3 |
| 8/23/09 | 18.5 |
| 8/23/09 | 16.6 |
| 8/23/09 | 16.6 |
| 8/23/09 | 17 |
| 8/23/09 | 17 |
| 8/23/09 | 14.4 |
| 8/23/09 | 11.8 |
| 8/23/09 | 13 |
| 8/23/09 | 10.4 |
| 8/23/09 | 11.3 |
| 8/23/09 | 11 |
| 8/22/09 | 10.8 |
| 8/22/09 | 10 |
| 8/22/09 | 9 |
| 8/22/09 | 10.6 |
| 8/22/09 | 11.5 |
| 8/22/09 | 14 |
| 8/22/09 | 15 |
| 8/22/09 | 14 |
| 8/22/09 | 14.5 |
| 8/22/09 | 14.9 |
| 8/22/09 | 14.9 |
| 8/22/09 | 15.3 |
| 8/22/09 | 11.4 |
| 8/22/09 | 16.3 |
| 8/22/09 | 16.6 |
| 8/22/09 | 11.5 |
| 8/22/09 | 14.6 |
| 8/22/09 | 16.5 |
| 8/22/09 | 15.4 |
| 8/22/09 | 16.2 |
| 8/22/09 | 16.4 |
| 8/22/09 | 14.1 |
| 8/22/09 | 16.9 |
| 8/22/09 | 16.8 |
| 8/22/09 | 16.6 |
| 8/22/09 | 17.4 |
| 8/22/09 | 15.9 |
| 8/22/09 | 17.4 |
| 8/22/09 | 18.5 |
| 8/22/09 | 18 |
| 8/22/09 | 19.2 |
| 8/22/09 | 21.5 |
| 8/22/09 | 20.3 |
| 8/22/09 | 21.3 |
| 8/22/09 | 18.2 |
| 8/22/09 | 16.1 |
| 8/22/09 | 12.4 |
| 8/22/09 | 14 |
| 8/22/09 | 13 |
| 8/22/09 | 13.3 |
| 8/22/09 | 12.6 |
| 8/22/09 | 12.5 |
| 8/22/09 | 10.6 |
| 8/22/09 | 10.6 |
| 8/22/09 | 10.3 |
| 8/22/09 | 11.9 |
| 8/22/09 | 12 |
| 8/22/09 | 12.3 |
| 8/21/09 | 10 |
| 8/21/09 | 9.9 |
| 8/21/09 | 12.1 |
| 8/21/09 | 12.5 |
| 8/21/09 | 11 |
| 8/21/09 | 11.6 |
| 8/21/09 | 11.9 |
| 8/21/09 | 12.8 |
| 8/21/09 | 11.7 |
| 8/21/09 | 13 |
| 8/21/09 | 12.6 |
| 8/21/09 | 12.6 |
| 8/21/09 | 15 |
| 8/21/09 | 13.2 |
| 8/21/09 | 15 |
| 8/21/09 | 14.3 |
| 8/21/09 | 13.1 |
| 8/21/09 | 14 |
| 8/21/09 | 14.4 |
| 8/21/09 | 17.9 |
| 8/21/09 | 15.1 |
| 8/21/09 | 15.2 |
| 8/21/09 | 16.7 |
| 8/21/09 | 15.5 |
| 8/21/09 | 15.6 |
| 8/21/09 | 14.3 |
| 8/21/09 | 12.8 |
| 8/21/09 | 10.3 |
| 8/21/09 | 12.1 |
| 8/21/09 | 12.2 |
| 8/21/09 | 10.9 |
| 8/21/09 | 9.8 |
| 8/21/09 | 8.3 |
| 8/21/09 | 10 |
| 8/21/09 | 10 |
| 8/21/09 | 9.1 |
| 8/21/09 | 10.3 |
| 8/21/09 | 10.1 |
| 8/21/09 | 9.5 |
| 8/21/09 | 7.2 |
| 8/21/09 | 8.6 |
| 8/21/09 | 9 |
| 8/21/09 | 8.9 |
| 8/21/09 | 10.4 |
| 8/21/09 | 10.9 |
| 8/21/09 | 12.3 |
| 8/21/09 | 12.1 |
| 8/21/09 | 15.3 |
| 8/20/09 | 13.6 |
| 8/20/09 | 12.9 |
| 8/20/09 | 13.4 |
| 8/20/09 | 14.5 |
| 8/20/09 | 14.2 |
| 8/20/09 | 12.2 |
| 8/20/09 | 11.7 |
| 8/20/09 | 14.3 |
| 8/20/09 | 12 |
| 8/20/09 | 12.8 |
| 8/20/09 | 14.5 |
| 8/20/09 | 13.7 |
| 8/20/09 | 13.8 |
| 8/20/09 | 10.9 |
| 8/20/09 | 16.6 |
| 8/20/09 | 13.3 |
| 8/20/09 | 16 |
| 8/20/09 | 16 |
| 8/20/09 | 17.3 |
| 8/20/09 | 16 |
| 8/20/09 | 14.1 |
| 8/20/09 | 14.8 |
| 8/20/09 | 12.6 |
| 8/20/09 | 13 |
| 8/20/09 | 12.9 |
| 8/20/09 | 12.1 |
| 8/20/09 | 12.8 |
| 8/20/09 | 15.6 |
| 8/20/09 | 14.9 |
| 8/20/09 | 15.8 |
| 8/20/09 | 10.4 |
| 8/20/09 | 11.4 |
| 8/20/09 | 13.7 |
| 8/20/09 | 10.1 |
| 8/20/09 | 10.8 |
| 8/20/09 | 10.3 |
| 8/20/09 | 9.3 |
| 8/20/09 | 10.5 |
| 8/20/09 | 10.1 |
| 8/20/09 | 8.8 |
| 8/20/09 | 9.1 |
| 8/20/09 | 9.2 |
| 8/20/09 | 10.9 |
| 8/20/09 | 12.2 |
| 8/20/09 | 10.9 |
| 8/20/09 | 11.7 |
| 8/20/09 | 9.4 |
| 8/20/09 | 8.9 |
| 8/19/09 | 7.3 |
| 8/19/09 | 8.7 |
| 8/19/09 | 8.3 |
| 8/19/09 | 8.2 |
| 8/19/09 | 7.4 |
| 8/19/09 | 9.6 |
| 8/19/09 | 9.2 |
| 8/19/09 | 10.6 |
| 8/19/09 | 9.7 |
| 8/19/09 | 13 |
| 8/19/09 | 12.3 |
| 8/19/09 | 12.3 |
| 8/19/09 | 13.1 |
| 8/19/09 | 12.4 |
| 8/19/09 | 12.6 |
| 8/19/09 | 10.2 |
| 8/19/09 | 9.7 |
| 8/19/09 | 11.4 |
| 8/19/09 | 10.5 |
| 8/19/09 | 11.4 |
| 8/19/09 | 8.1 |
| 8/19/09 | 7.9 |
| 8/19/09 | 8.4 |
| 8/19/09 | 10.6 |
| 8/19/09 | 8.1 |
| 8/19/09 | 10.3 |
| 8/19/09 | 13.8 |
| 8/19/09 | 8.1 |
| 8/19/09 | 10.3 |
| 8/19/09 | 8.1 |
| 8/19/09 | 8.9 |
| 8/19/09 | 8.2 |
| 8/19/09 | 7.7 |
| 8/19/09 | 7.8 |
| 8/19/09 | 5.7 |
| 8/19/09 | 7.1 |
| 8/19/09 | 6.9 |
| 8/19/09 | 7.7 |
| 8/19/09 | 7.8 |
| 8/19/09 | 6.8 |
| 8/19/09 | 7.1 |
| 8/19/09 | 6.4 |
| 8/19/09 | 7.6 |
| 8/19/09 | 5.1 |
| 8/19/09 | 5.5 |
| 8/19/09 | 6 |
| 8/19/09 | 6.4 |
| 8/19/09 | 4.9 |
| 8/18/09 | 5.2 |
| 8/18/09 | 6.8 |
| 8/18/09 | 5.6 |
| 8/18/09 | 6.5 |
| 8/18/09 | 7.3 |
| 8/18/09 | 7.8 |
| 8/18/09 | 9.3 |
| 8/18/09 | 9.8 |
| 8/18/09 | 10.1 |
| 8/18/09 | 9.6 |
| 8/18/09 | 10.5 |
| 8/18/09 | 10.1 |
| 8/18/09 | 8.4 |
| 8/18/09 | 10.1 |
| 8/18/09 | 11.2 |
| 8/18/09 | 9.1 |
| 8/18/09 | 9.1 |
| 8/18/09 | 8.2 |
| 8/18/09 | 7.9 |
| 8/18/09 | 8.5 |
| 8/18/09 | 9.7 |
| 8/18/09 | 7.6 |
| 8/18/09 | 7.6 |
| 8/18/09 | 8 |
| 8/18/09 | 7.3 |
| 8/18/09 | 8.5 |
| 8/18/09 | 7.6 |
| 8/18/09 | 5.5 |
| 8/18/09 | 5.2 |
| 8/18/09 | 5.1 |
| 8/18/09 | 7.5 |
| 8/18/09 | 5.8 |
| 8/18/09 | 5.4 |
| 8/18/09 | 6.6 |
| 8/18/09 | 5.4 |
| 8/18/09 | 3.9 |
| 8/18/09 | 5.3 |
| 8/18/09 | 5 |
| 8/18/09 | 6.5 |
| 8/18/09 | 6.6 |
| 8/18/09 | 5.3 |
| 8/18/09 | 6.4 |
| 8/18/09 | 5.6 |
| 8/18/09 | 6.8 |
| 8/18/09 | 6.3 |
| 8/18/09 | 6 |
| 8/18/09 | 5.7 |
| 8/18/09 | 6.3 |
| 8/17/09 | 4.6 |
| 8/17/09 | 5.2 |
| 8/17/09 | 5.5 |
| 8/17/09 | 6.6 |
| 8/17/09 | 7.4 |
| 8/17/09 | 7 |
| 8/17/09 | 6.9 |
| 8/17/09 | 7.7 |
| 8/17/09 | 6.8 |
| 8/17/09 | 9 |
| 8/17/09 | 10.3 |
| 8/17/09 | 6.4 |
| 8/17/09 | 4.7 |
| 8/17/09 | 5.7 |
| 8/17/09 | 5.7 |
| 8/17/09 | 6.9 |
| 8/17/09 | 5.6 |
| 8/17/09 | 5.2 |
| 8/17/09 | 6.4 |
| 8/17/09 | 6.3 |
| 8/17/09 | 7.8 |
| 8/17/09 | 7.5 |
| 8/17/09 | 6.7 |
| 8/17/09 | 6.4 |
| 8/17/09 | 9 |
| 8/17/09 | 7.7 |
| 8/17/09 | 7.8 |
| 8/17/09 | 5.7 |
| 8/17/09 | 7.2 |
| 8/17/09 | 5.9 |
| 8/17/09 | 6.8 |
| 8/17/09 | 5.1 |
| 8/17/09 | 5.2 |
| 8/17/09 | 5.8 |
| 8/17/09 | 41.6 |
| 8/17/09 | 5.8 |
| 8/17/09 | 5.2 |
| 8/17/09 | 7.2 |
| 8/17/09 | 5.8 |
| 8/17/09 | 7.1 |
| 8/17/09 | 5.9 |
| 8/17/09 | 6.2 |
| 8/17/09 | 7.9 |
| 8/17/09 | 8.6 |
| 8/17/09 | 9.7 |
| 8/17/09 | 13.6 |
| 8/17/09 | 13.9 |
| 8/17/09 | 9.5 |
| 8/16/09 | 9.2 |
| 8/16/09 | 12.1 |
| 8/16/09 | 10.2 |
| 8/16/09 | 11.2 |
| 8/16/09 | 8.8 |
| 8/16/09 | 9 |
| 8/16/09 | 7.6 |
| 8/16/09 | 7.6 |
| 8/16/09 | 11.5 |
| 8/16/09 | 8.8 |
| 8/16/09 | 9.9 |
| 8/16/09 | 7.9 |
| 8/16/09 | 8.5 |
| 8/16/09 | 9.8 |
| 8/16/09 | 12.6 |
| 8/16/09 | 10 |
| 8/16/09 | 7.6 |
| 8/16/09 | 7.7 |
| 8/16/09 | 9.9 |
| 8/16/09 | 8.7 |
| 8/16/09 | 10.3 |
| 8/16/09 | 9.2 |
| 8/16/09 | 8.9 |
| 8/16/09 | 9.9 |
| 8/16/09 | 9.1 |
| 8/16/09 | 6.5 |
| 8/16/09 | 8.1 |
| 8/16/09 | 11.1 |
| 8/16/09 | 7 |
| 8/16/09 | 4.7 |
| 8/16/09 | 6.1 |
| 8/16/09 | 6.5 |
| 8/16/09 | 6.5 |
| 8/16/09 | 11.7 |
| 8/16/09 | 8.8 |
| 8/16/09 | 9.2 |
| 8/16/09 | 9 |
| 8/16/09 | 9.4 |
| 8/16/09 | 9 |
| 8/16/09 | 10 |
| 8/16/09 | 10 |
| 8/16/09 | 8.2 |
| 8/16/09 | 10.4 |
| 8/16/09 | 9.5 |
| 8/16/09 | 8.4 |
| 8/16/09 | 8.9 |
| 8/16/09 | 7.9 |
| 8/16/09 | 8.3 |
| 8/15/09 | 9 |
| 8/15/09 | 12.1 |
| 8/15/09 | 11.2 |
| 8/15/09 | 9.8 |
| 8/15/09 | 11.2 |
| 8/15/09 | 10.3 |
| 8/15/09 | 10.4 |
| 8/15/09 | 33.4 |
| 8/15/09 | 11.4 |
| 8/15/09 | 15.5 |
| 8/15/09 | 9.4 |
| 8/15/09 | 8.4 |
| 8/15/09 | 9.3 |
| 8/15/09 | 8.4 |
| 8/15/09 | 7.3 |
| 8/15/09 | 10.8 |
| 8/15/09 | 7.2 |
| 8/15/09 | 8.2 |
| 8/15/09 | 9.6 |
| 8/15/09 | 8.9 |
| 8/15/09 | 9.1 |
| 8/15/09 | 9.8 |
| 8/15/09 | 9.7 |
| 8/15/09 | 9.3 |
| 8/15/09 | 9.9 |
| 8/15/09 | 8.8 |
| 8/15/09 | 8.5 |
| 8/15/09 | 10.2 |
| 8/15/09 | 8.8 |
| 8/15/09 | 6.9 |
| 8/15/09 | 7.3 |
| 8/15/09 | 9.2 |
| 8/15/09 | 7.6 |
| 8/15/09 | 9 |
| 8/15/09 | 12.7 |
| 8/15/09 | 9.8 |
| 8/15/09 | 8.8 |
| 8/15/09 | 7.5 |
| 8/15/09 | 8.1 |
| 8/15/09 | 8.8 |
| 8/15/09 | 10.1 |
| 8/15/09 | 10.6 |
| 8/15/09 | 9.1 |
| 8/15/09 | 9.8 |
| 8/15/09 | 10.3 |
| 8/15/09 | 11.7 |
| 8/15/09 | 12.7 |
| 8/15/09 | 8.3 |
| 8/14/09 | 12.1 |
| 8/14/09 | 9.9 |
| 8/14/09 | 8.7 |
| 8/14/09 | 9.8 |
| 8/14/09 | 10 |
| 8/14/09 | 11.5 |
| 8/14/09 | 9.4 |
| 8/14/09 | 10.2 |
| 8/14/09 | 8.2 |
| 8/14/09 | 6.9 |
| 8/14/09 | 10.2 |
| 8/14/09 | 10.7 |
| 8/14/09 | 8.9 |
| 8/14/09 | 9.9 |
| 8/14/09 | 8.4 |
| 8/14/09 | 10.2 |
| 8/14/09 | 9.7 |
| 8/14/09 | 10.3 |
| 8/14/09 | 9.3 |
| 8/14/09 | 8.8 |
| 8/14/09 | 9.4 |
| 8/14/09 | 10.9 |
| 8/14/09 | 8.8 |
| 8/14/09 | 10.6 |
| 8/14/09 | 12.2 |
| 8/14/09 | 8.5 |
| 8/14/09 | 8.9 |
| 8/14/09 | 9.6 |
| 8/14/09 | 8.3 |
| 8/14/09 | 8.7 |
| 8/14/09 | 8.8 |
| 8/14/09 | 12.4 |
| 8/14/09 | 12.5 |
| 8/14/09 | 14.1 |
| 8/14/09 | 13 |
| 8/14/09 | 11 |
| 8/14/09 | 11.1 |
| 8/14/09 | 10.1 |
| 8/14/09 | 10.3 |
| 8/14/09 | 10.2 |
| 8/14/09 | 11.3 |
| 8/14/09 | 10.8 |
| 8/14/09 | 11.9 |
| 8/14/09 | 11.9 |
| 8/14/09 | 12 |
| 8/14/09 | 11.4 |
| 8/14/09 | 12 |
| 8/14/09 | 12.9 |
| 8/13/09 | 11.6 |
| 8/13/09 | 14.3 |
| 8/13/09 | 11.8 |
| 8/13/09 | 14.1 |
| 8/13/09 | 17.1 |
| 8/13/09 | 17.6 |
| 8/13/09 | 20.7 |
| 8/13/09 | 18.5 |
| 8/13/09 | 18.3 |
| 8/13/09 | 17.5 |
| 8/13/09 | 18.6 |
| 8/13/09 | 14.9 |
| 8/13/09 | 17.6 |
| 8/13/09 | 17.9 |
| 8/13/09 | 12.8 |
| 8/13/09 | 16.7 |
| 8/13/09 | 15.6 |
| 8/13/09 | 15.3 |
| 8/13/09 | 17.3 |
| 8/13/09 | 16.3 |
| 8/13/09 | 15.2 |
| 8/13/09 | 16.5 |
| 8/13/09 | 17 |
| 8/13/09 | 16.6 |
| 8/13/09 | 16.4 |
| 8/13/09 | 18 |
| 8/13/09 | 18.3 |
| 8/13/09 | 17.1 |
| 8/13/09 | 19.2 |
| 8/13/09 | 17.9 |
| 8/13/09 | 16.4 |
| 8/13/09 | 15.7 |
| 8/13/09 | 15.5 |
| 8/13/09 | 13.8 |
| 8/13/09 | 13.5 |
| 8/13/09 | 11.5 |
| 8/13/09 | 11.2 |
| 8/13/09 | 12.5 |
| 8/13/09 | 10.6 |
| 8/13/09 | 10.1 |
| 8/13/09 | 11 |
| 8/13/09 | 8.4 |
| 8/13/09 | 10.6 |
| 8/13/09 | 10.7 |
| 8/13/09 | 9.9 |
| 8/13/09 | 10.3 |
| 8/13/09 | 10.3 |
| 8/13/09 | 9.3 |
| 8/12/09 | 9.2 |
| 8/12/09 | 8.7 |
| 8/12/09 | 8.9 |
| 8/12/09 | 9.3 |
| 8/12/09 | 9.5 |
| 8/12/09 | 10.5 |
| 8/12/09 | 9.5 |
| 8/12/09 | 9.6 |
| 8/12/09 | 8.3 |
| 8/12/09 | 9 |
| 8/12/09 | 10.7 |
| 8/12/09 | 10.7 |
| 8/12/09 | 9.9 |
| 8/12/09 | 8.7 |
| 8/12/09 | 9.6 |
| 8/12/09 | 9.8 |
| 8/12/09 | 10.9 |
| 8/12/09 | 11.5 |
| 8/12/09 | 10.1 |
| 8/12/09 | 10.1 |
| 8/12/09 | 9.7 |
| 8/12/09 | 10.9 |
| 8/12/09 | 8.2 |
| 8/12/09 | 8.5 |
| 8/12/09 | 9.5 |
| 8/12/09 | 10.2 |
| 8/12/09 | 8.1 |
| 8/12/09 | 8.9 |
| 8/12/09 | 8.3 |
| 8/12/09 | 8.7 |
| 8/12/09 | 9.2 |
| 8/12/09 | 7.9 |
| 8/12/09 | 9.5 |
| 8/12/09 | 7.2 |
| 8/12/09 | 8.9 |
| 8/12/09 | 7.5 |
| 8/12/09 | 7.7 |
| 8/12/09 | 7.3 |
| 8/12/09 | 8.3 |
| 8/12/09 | 7.4 |
| 8/12/09 | 8.5 |
| 8/12/09 | 7.1 |
| 8/12/09 | 6.8 |
| 8/12/09 | 6.9 |
| 8/12/09 | 7.5 |
| 8/12/09 | 7.8 |
| 8/12/09 | 7.8 |
| 8/12/09 | 6.9 |
| 8/11/09 | 7.2 |
| 8/11/09 | 8.1 |
| 8/11/09 | 7.6 |
| 8/11/09 | 6.9 |
| 8/11/09 | 8 |
| 8/11/09 | 8 |
| 8/11/09 | 8 |
| 8/11/09 | 8.7 |
| 8/11/09 | 8.8 |
| 8/11/09 | 8.2 |
| 8/11/09 | 8.5 |
| 8/11/09 | 8.9 |
| 8/11/09 | 8.1 |
| 8/11/09 | 9.5 |
| 8/11/09 | 10.7 |
| 8/11/09 | 11 |
| 8/11/09 | 10.1 |
| 8/11/09 | 9.3 |
| 8/11/09 | 9.1 |
| 8/11/09 | 9.5 |
| 8/11/09 | 10.6 |
| 8/11/09 | 11 |
| 8/11/09 | 11.1 |
| 8/11/09 | 10 |
| 8/11/09 | 10.9 |
| 8/11/09 | 8.6 |
| 8/11/09 | 7.7 |
| 8/11/09 | 7.5 |
| 8/11/09 | 6.8 |
| 8/11/09 | 7.1 |
| 8/11/09 | 7.3 |
| 8/11/09 | 7.2 |
| 8/11/09 | 7.5 |
| 8/11/09 | 6.7 |
| 8/11/09 | 6.8 |
| 8/11/09 | 6.8 |
| 8/11/09 | 6.4 |
| 8/11/09 | 7.8 |
| 8/11/09 | 6.8 |
| 8/11/09 | 6.6 |
| 8/11/09 | 7 |
| 8/11/09 | 6.8 |
| 8/11/09 | 7.4 |
| 8/11/09 | 6.8 |
| 8/11/09 | 8.2 |
| 8/11/09 | 7.4 |
| 8/11/09 | 7.6 |
| 8/11/09 | 7.9 |
| 8/10/09 | 7.5 |
| 8/10/09 | 7.4 |
| 8/10/09 | 8.2 |
| 8/10/09 | 7.6 |
| 8/10/09 | 7.4 |
| 8/10/09 | 7.8 |
| 8/10/09 | 9 |
| 8/10/09 | 8.6 |
| 8/10/09 | 10.2 |
| 8/10/09 | 10.6 |
| 8/10/09 | 11.4 |
| 8/10/09 | 10.6 |
| 8/10/09 | 9.7 |
| 8/10/09 | 9.7 |
| 8/10/09 | 10.6 |
| 8/10/09 | 10.9 |
| 8/10/09 | 11.4 |
| 8/10/09 | 12.3 |
| 8/10/09 | 11.5 |
| 8/10/09 | 13 |
| 8/10/09 | 10.6 |
| 8/10/09 | 12.3 |
| 8/10/09 | 12.1 |
| 8/10/09 | 10.9 |
| 8/10/09 | 10.6 |
| 8/10/09 | 8.8 |
| 8/10/09 | 9.5 |
| 8/10/09 | 9.6 |
| 8/10/09 | 8.7 |
| 8/10/09 | 8.1 |
| 8/10/09 | 7.8 |
| 8/10/09 | 7.5 |
| 8/10/09 | 7.6 |
| 8/10/09 | 7.2 |
| 8/10/09 | 6.8 |
| 8/10/09 | 6.5 |
| 8/10/09 | 7 |
| 8/10/09 | 7.1 |
| 8/10/09 | 7.6 |
| 8/10/09 | 6.9 |
| 8/10/09 | 7.4 |
| 8/10/09 | 7.4 |
| 8/10/09 | 7.7 |
| 8/10/09 | 8.1 |
| 8/10/09 | 8.1 |
| 8/10/09 | 8.1 |
| 8/10/09 | 8.9 |
| 8/10/09 | 9 |
| 8/9/09 | 9.2 |
| 8/9/09 | 9.2 |
| 8/9/09 | 9.3 |
| 8/9/09 | 9 |
| 8/9/09 | 9.7 |
| 8/9/09 | 9.2 |
| 8/9/09 | 12.5 |
| 8/9/09 | 10 |
| 8/9/09 | 10.2 |
| 8/9/09 | 10.2 |
| 8/9/09 | 12.6 |
| 8/9/09 | 13.2 |
| 8/9/09 | 13 |
| 8/9/09 | 13.5 |
| 8/9/09 | 12.3 |
| 8/9/09 | 13.4 |
| 8/9/09 | 15 |
| 8/9/09 | 15.1 |
| 8/9/09 | 14 |
| 8/9/09 | 13.5 |
| 8/9/09 | 12.3 |
| 8/9/09 | 12 |
| 8/9/09 | 11 |
| 8/9/09 | 8.7 |
| 8/9/09 | 13.7 |
| 8/9/09 | 11.4 |
| 8/9/09 | 10.1 |
| 8/9/09 | 9.1 |
| 8/9/09 | 9.2 |
| 8/9/09 | 8.4 |
| 8/9/09 | 7.9 |
| 8/9/09 | 8.4 |
| 8/9/09 | 8.2 |
| 8/9/09 | 8.3 |
| 8/9/09 | 8.2 |
| 8/9/09 | 8.7 |
| 8/9/09 | 8.6 |
| 8/9/09 | 8.9 |
| 8/9/09 | 9.3 |
| 8/9/09 | 8.9 |
| 8/9/09 | 8.1 |
| 8/9/09 | 7.9 |
| 8/9/09 | 7.9 |
| 8/9/09 | 7.9 |
| 8/9/09 | 8.1 |
| 8/9/09 | 10.5 |
| 8/9/09 | 10.2 |
| 8/9/09 | 9.2 |
| 8/8/09 | 9.8 |
| 8/8/09 | 10.3 |
| 8/8/09 | 10.4 |
| 8/8/09 | 11 |
| 8/8/09 | 10.1 |
| 8/8/09 | 9.9 |
| 8/8/09 | 10.1 |
| 8/8/09 | 9 |
| 8/8/09 | 10.4 |
| 8/8/09 | 10.7 |
| 8/8/09 | 10.1 |
| 8/8/09 | 11.3 |
| 8/8/09 | 11.5 |
| 8/8/09 | 12.2 |
| 8/8/09 | 10.6 |
| 8/8/09 | 12.9 |
| 8/8/09 | 11.3 |
| 8/8/09 | 14.1 |
| 8/8/09 | 12.8 |
| 8/8/09 | 12.3 |
| 8/8/09 | 13.4 |
| 8/8/09 | 11.1 |
| 8/8/09 | 11.9 |
| 8/8/09 | 12 |
| 8/8/09 | 10 |
| 8/8/09 | 9.8 |
| 8/8/09 | 9.8 |
| 8/8/09 | 12.1 |
| 8/8/09 | 10.5 |
| 8/8/09 | 10.8 |
| 8/8/09 | 9.6 |
| 8/8/09 | 8.8 |
| 8/8/09 | 10 |
| 8/8/09 | 9.6 |
| 8/8/09 | 9.6 |
| 8/8/09 | 9 |
| 8/8/09 | 8.8 |
| 8/8/09 | 9.3 |
| 8/8/09 | 9.1 |
| 8/8/09 | 9.2 |
| 8/8/09 | 8.9 |
| 8/8/09 | 9.4 |
| 8/8/09 | 9.4 |
| 8/8/09 | 9 |
| 8/8/09 | 9.4 |
| 8/8/09 | 9.9 |
| 8/8/09 | 11.2 |
| 8/8/09 | 11.1 |
| 8/7/09 | 12.4 |
| 8/7/09 | 13.4 |
| 8/7/09 | 12.8 |
| 8/7/09 | 11.5 |
| 8/7/09 | 13.1 |
| 8/7/09 | 13.4 |
| 8/7/09 | 13.2 |
| 8/7/09 | 12.7 |
| 8/7/09 | 12.1 |
| 8/7/09 | 11.8 |
| 8/7/09 | 13 |
| 8/7/09 | 11.4 |
| 8/7/09 | 12.6 |
| 8/7/09 | 11.5 |
| 8/7/09 | 12.7 |
| 8/7/09 | 13 |
| 8/7/09 | 14.5 |
| 8/7/09 | 15.9 |
| 8/7/09 | 15.7 |
| 8/7/09 | 17.8 |
| 8/7/09 | 17.9 |
| 8/7/09 | 18.8 |
| 8/7/09 | 19.4 |
| 8/7/09 | 19 |
| 8/7/09 | 21.3 |
| 8/7/09 | 26.4 |
| 8/7/09 | 23.6 |
| 8/7/09 | 20.8 |
| 8/7/09 | 21.7 |
| 8/7/09 | 22.3 |
| 8/7/09 | 19.1 |
| 8/7/09 | 17.2 |
| 8/7/09 | 16.2 |
| 8/7/09 | 15.7 |
| 8/7/09 | 14.7 |
| 8/7/09 | 13.2 |
| 8/7/09 | 12.3 |
| 8/7/09 | 11.6 |
| 8/7/09 | 11.2 |
| 8/7/09 | 11 |
| 8/7/09 | 10.1 |
| 8/7/09 | 11.1 |
| 8/7/09 | 10.9 |
| 8/7/09 | 10.5 |
| 8/7/09 | 11.4 |
| 8/7/09 | 11.1 |
| 8/6/09 | 10.4 |
| 8/6/09 | 10.2 |
| 8/6/09 | 11 |
| 8/6/09 | 9.8 |
| 8/6/09 | 11.3 |
| 8/6/09 | 14 |
| 8/6/09 | 12.8 |
| 8/6/09 | 14.5 |
| 8/6/09 | 13.6 |
| 8/6/09 | 12.5 |
| 8/6/09 | 14.1 |
| 8/6/09 | 14.1 |
| 8/6/09 | 14.3 |
| 8/6/09 | 14.5 |
| 8/6/09 | 14.2 |
| 8/6/09 | 19.3 |
| 8/6/09 | 11.6 |
| 8/6/09 | 13.6 |
| 8/6/09 | 14.8 |
| 8/6/09 | 15.5 |
| 8/6/09 | 14.2 |
| 8/6/09 | 14.2 |
| 8/6/09 | 16.4 |
| 8/6/09 | 12.8 |
| 8/6/09 | 15.9 |
| 8/6/09 | 15.1 |
| 8/6/09 | 17.7 |
| 8/6/09 | 20.6 |
| 8/6/09 | 16 |
| 8/6/09 | 20.4 |
| 8/6/09 | 17.8 |
| 8/6/09 | 21.6 |
| 8/6/09 | 22.9 |
| 8/6/09 | 22 |
| 8/6/09 | 19.1 |
| 8/6/09 | 17.6 |
| 8/6/09 | 17.1 |
| 8/6/09 | 14.5 |
| 8/6/09 | 13.3 |
| 8/6/09 | 14.5 |
| 8/6/09 | 12.8 |
| 8/6/09 | 12.2 |
| 8/6/09 | 11.8 |
| 8/6/09 | 11.7 |
| 8/6/09 | 11.8 |
| 8/6/09 | 11.5 |
| 8/6/09 | 10.6 |
| 8/6/09 | 10.2 |
| 8/5/09 | 10.3 |
| 8/5/09 | 9.8 |
| 8/5/09 | 10.1 |
| 8/5/09 | 9.6 |
| 8/5/09 | 9 |
| 8/5/09 | 10.2 |
| 8/5/09 | 8.8 |
| 8/5/09 | 10.5 |
| 8/5/09 | 10.1 |
| 8/5/09 | 9.2 |
| 8/5/09 | 11.9 |
| 8/5/09 | 11.6 |
| 8/5/09 | 10.4 |
| 8/5/09 | 12 |
| 8/5/09 | 11.3 |
| 8/5/09 | 8.1 |
| 8/5/09 | 8.9 |
| 8/5/09 | 12.3 |
| 8/5/09 | 9.9 |
| 8/5/09 | 10.5 |
| 8/5/09 | 10.7 |
| 8/5/09 | 12.7 |
| 8/5/09 | 13.5 |
| 8/5/09 | 14.6 |
| 8/5/09 | 12.1 |
| 8/5/09 | 14.6 |
| 8/5/09 | 11.5 |
| 8/5/09 | 11.1 |
| 8/5/09 | 10 |
| 8/5/09 | 10.7 |
| 8/5/09 | 10.4 |
| 8/5/09 | 9.5 |
| 8/5/09 | 10 |
| 8/5/09 | 9.7 |
| 8/5/09 | 9.6 |
| 8/5/09 | 9.9 |
| 8/5/09 | 9.3 |
| 8/5/09 | 9.2 |
| 8/5/09 | 9.5 |
| 8/5/09 | 8.9 |
| 8/5/09 | 8.8 |
| 8/5/09 | 9.8 |
| 8/5/09 | 9.7 |
| 8/5/09 | 10.2 |
| 8/5/09 | 12.7 |
| 8/5/09 | 11.2 |
| 8/5/09 | 11 |
| 8/5/09 | 9.4 |
| 8/4/09 | 9.4 |
| 8/4/09 | 9.7 |
| 8/4/09 | 8.6 |
| 8/4/09 | 8.6 |
| 8/4/09 | 10.1 |
| 8/4/09 | 9.4 |
| 8/4/09 | 10.3 |
| 8/4/09 | 8.8 |
| 8/4/09 | 9.4 |
| 8/4/09 | 10.8 |
| 8/4/09 | 10.1 |
| 8/4/09 | 10 |
| 8/4/09 | 10.2 |
| 8/4/09 | 10 |
| 8/4/09 | 11 |
| 8/4/09 | 10.3 |
| 8/4/09 | 12.3 |
| 8/4/09 | 11.8 |
| 8/4/09 | 10.8 |
| 8/4/09 | 11.5 |
| 8/4/09 | 10.4 |
| 8/4/09 | 10.3 |
| 8/4/09 | 13.1 |
| 8/4/09 | 12.5 |
| 8/4/09 | 10.9 |
| 8/4/09 | 10.6 |
| 8/4/09 | 11.3 |
| 8/4/09 | 10.4 |
| 8/4/09 | 9.1 |
| 8/4/09 | 8.5 |
| 8/4/09 | 9.1 |
| 8/4/09 | 8.9 |
| 8/4/09 | 10.1 |
| 8/4/09 | 9.3 |
| 8/4/09 | 10.1 |
| 8/4/09 | 9.7 |
| 8/4/09 | 10.7 |
| 8/4/09 | 9 |
| 8/4/09 | 9.3 |
| 8/4/09 | 10.6 |
| 8/4/09 | 10.1 |
| 8/4/09 | 8.9 |
| 8/4/09 | 9.8 |
| 8/4/09 | 9.3 |
| 8/4/09 | 8.9 |
| 8/4/09 | 9.7 |
| 8/4/09 | 8 |
| 8/4/09 | 10.7 |
| 8/3/09 | 10.1 |
| 8/3/09 | 10.7 |
| 8/3/09 | 11.9 |
| 8/3/09 | 12.3 |
| 8/3/09 | 10.9 |
| 8/3/09 | 11.3 |
| 8/3/09 | 10 |
| 8/3/09 | 9.8 |
| 8/3/09 | 11.6 |
| 8/3/09 | 10.6 |
| 8/3/09 | 11.7 |
| 8/3/09 | 11.3 |
| 8/3/09 | 12.4 |
| 8/3/09 | 10.7 |
| 8/3/09 | 14.2 |
| 8/3/09 | 14 |
| 8/3/09 | 13.2 |
| 8/3/09 | 15.1 |
| 8/3/09 | 11.1 |
| 8/3/09 | 12.6 |
| 8/3/09 | 15.6 |
| 8/3/09 | 18.8 |
| 8/3/09 | 17.1 |
| 8/3/09 | 16.4 |
| 8/3/09 | 17.5 |
| 8/3/09 | 14.2 |
| 8/3/09 | 16.3 |
| 8/3/09 | 15.4 |
| 8/3/09 | 15.8 |
| 8/3/09 | 17 |
| 8/3/09 | 15.9 |
| 8/3/09 | 14.3 |
| 8/3/09 | 14 |
| 8/3/09 | 13.5 |
| 8/3/09 | 12.5 |
| 8/3/09 | 12.6 |
| 8/3/09 | 12.8 |
| 8/3/09 | 12.3 |
| 8/3/09 | 12 |
| 8/3/09 | 11.8 |
| 8/3/09 | 11.6 |
| 8/3/09 | 11.5 |
| 8/3/09 | 12.3 |
| 8/3/09 | 11.5 |
| 8/3/09 | 10.7 |
| 8/3/09 | 10.4 |
| 8/3/09 | 10 |
| 8/3/09 | 10.3 |
| 8/2/09 | 9.3 |
| 8/2/09 | 10.2 |
| 8/2/09 | 9.9 |
| 8/2/09 | 9.5 |
| 8/2/09 | 8.7 |
| 8/2/09 | 9.9 |
| 8/2/09 | 11.2 |
| 8/2/09 | 11.7 |
| 8/2/09 | 10.4 |
| 8/2/09 | 11.4 |
| 8/2/09 | 11.2 |
| 8/2/09 | 12 |
| 8/2/09 | 11.4 |
| 8/2/09 | 11.3 |
| 8/2/09 | 15.2 |
| 8/2/09 | 12.2 |
| 8/2/09 | 11.8 |
| 8/2/09 | 11.4 |
| 8/2/09 | 13.7 |
| 8/2/09 | 11.1 |
| 8/2/09 | 11.4 |
| 8/2/09 | 10.3 |
| 8/2/09 | 11.1 |
| 8/2/09 | 10 |
| 8/2/09 | 11.6 |
| 8/2/09 | 10.7 |
| 8/2/09 | 10.6 |
| 8/2/09 | 10.3 |
| 8/2/09 | 10.6 |
| 8/2/09 | 9.6 |
| 8/2/09 | 9.5 |
| 8/2/09 | 9.1 |
| 8/2/09 | 9.5 |
| 8/2/09 | 9.3 |
| 8/2/09 | 9.8 |
| 8/2/09 | 8.9 |
| 8/2/09 | 9.1 |
| 8/2/09 | 8.7 |
| 8/2/09 | 9.4 |
| 8/2/09 | 10.5 |
| 8/2/09 | 9.3 |
| 8/2/09 | 9.8 |
| 8/2/09 | 10.3 |
| 8/2/09 | 9.9 |
| 8/2/09 | 9.6 |
| 8/2/09 | 8.8 |
| 8/2/09 | 13.4 |
| 8/2/09 | 21.3 |
| 8/1/09 | 14.9 |
| 8/1/09 | 13 |
| 8/1/09 | 11.9 |
| 8/1/09 | 12 |
| 8/1/09 | 15.2 |
| 8/1/09 | 12.4 |
| 8/1/09 | 12.7 |
| 8/1/09 | 15.3 |
| 8/1/09 | 14.1 |
| 8/1/09 | 15.2 |
| 8/1/09 | 13.6 |
| 8/1/09 | 13 |
| 8/1/09 | 15.7 |
| 8/1/09 | 13.7 |
| 8/1/09 | 14.3 |
| 8/1/09 | 14.9 |
| 8/1/09 | 20.2 |
| 8/1/09 | 11.1 |
| 8/1/09 | 15.4 |
| 8/1/09 | 12.4 |
| 8/1/09 | 13.8 |
| 8/1/09 | 16.7 |
| 8/1/09 | 15.8 |
| 8/1/09 | 18.2 |
| 8/1/09 | 12.6 |
| 8/1/09 | 13.8 |
| 8/1/09 | 11.6 |
| 8/1/09 | 19.2 |
| 8/1/09 | 15.6 |
| 8/1/09 | 15.5 |
| 8/1/09 | 14.3 |
| 8/1/09 | 16.6 |
| 8/1/09 | 14.5 |
| 8/1/09 | 15.1 |
| 8/1/09 | 13.4 |
| 8/1/09 | 14.1 |
| 8/1/09 | 13.2 |
| 8/1/09 | 12.4 |
| 8/1/09 | 12.7 |
| 8/1/09 | 13.3 |
| 8/1/09 | 12.6 |
| 8/1/09 | 11.4 |
| 8/1/09 | 10.7 |
| 8/1/09 | 11.3 |
| 8/1/09 | 11 |
| 8/1/09 | 10.6 |
| 8/1/09 | 9.1 |
| 8/1/09 | 10 |
| 7/31/09 | 9.2 |
| 7/31/09 | 10.2 |
| 7/31/09 | 11.3 |
| 7/31/09 | 9.8 |
| 7/31/09 | 12 |
| 7/31/09 | 12.8 |
| 7/31/09 | 9.7 |
| 7/31/09 | 12.5 |
| 7/31/09 | 9.5 |
| 7/31/09 | 10.8 |
| 7/31/09 | 11.1 |
| 7/31/09 | 14.1 |
| 7/31/09 | 12.6 |
| 7/31/09 | 12.2 |
| 7/31/09 | 15.5 |
| 7/31/09 | 13.7 |
| 7/31/09 | 7.9 |
| 7/31/09 | 11.7 |
| 7/31/09 | 12.4 |
| 7/31/09 | 13.2 |
| 7/31/09 | 11.7 |
| 7/31/09 | 9.4 |
| 7/31/09 | 10.3 |
| 7/31/09 | 10.4 |
| 7/31/09 | 9.7 |
| 7/31/09 | 10.9 |
| 7/31/09 | 9.5 |
| 7/31/09 | 10.6 |
| 7/31/09 | 10.4 |
| 7/31/09 | 9.1 |
| 7/31/09 | 10.7 |
| 7/31/09 | 11.3 |
| 7/31/09 | 10.1 |
| 7/31/09 | 10.3 |
| 7/31/09 | 9.9 |
| 7/31/09 | 11.6 |
| 7/31/09 | 8.6 |
| 7/31/09 | 9 |
| 7/31/09 | 14 |
| 7/31/09 | 15.4 |
| 7/31/09 | 10.5 |
| 7/31/09 | 11.8 |
| 7/31/09 | 13.6 |
| 7/31/09 | 11.7 |
| 7/31/09 | 12.6 |
| 7/31/09 | 14.1 |
| 7/31/09 | 12.7 |
| 7/31/09 | 14.9 |
| 7/30/09 | 12.4 |
| 7/30/09 | 20.2 |
| 7/30/09 | 11.7 |
| 7/30/09 | 11.9 |
| 7/30/09 | 16.5 |
| 7/30/09 | 13.5 |
| 7/30/09 | 16.3 |
| 7/30/09 | 18 |
| 7/30/09 | 17 |
| 7/30/09 | 15.4 |
| 7/30/09 | 14.3 |
| 7/30/09 | 11.8 |
| 7/30/09 | 8.4 |
| 7/30/09 | 13.6 |
| 7/30/09 | 14.3 |
| 7/30/09 | 11.8 |
| 7/30/09 | 11.3 |
| 7/30/09 | 13.4 |
| 7/30/09 | 18.6 |
| 7/30/09 | 15 |
| 7/30/09 | 13.6 |
| 7/30/09 | 16.4 |
| 7/30/09 | 15 |
| 7/30/09 | 14.7 |
| 7/30/09 | 8.5 |
| 7/30/09 | 8.1 |
| 7/30/09 | 10.7 |
| 7/30/09 | 12.3 |
| 7/30/09 | 13.1 |
| 7/30/09 | 16.1 |
| 7/30/09 | 14.9 |
| 7/30/09 | 11.9 |
| 7/30/09 | 12.4 |
| 7/30/09 | 13.6 |
| 7/30/09 | 12.2 |
| 7/30/09 | 15.2 |
| 7/30/09 | 12.5 |
| 7/30/09 | 10.8 |
| 7/30/09 | 11.2 |
| 7/30/09 | 11.4 |
| 7/30/09 | 8.8 |
| 7/30/09 | 8.8 |
| 7/30/09 | 8.1 |
| 7/30/09 | 9.8 |
| 7/30/09 | 8 |
| 7/30/09 | 8.6 |
| 7/30/09 | 8.4 |
| 7/30/09 | 10.1 |
| 7/29/09 | 10.1 |
| 7/29/09 | 10.3 |
| 7/29/09 | 11.4 |
| 7/29/09 | 7.9 |
| 7/29/09 | 15 |
| 7/29/09 | 13.7 |
| 7/29/09 | 16.7 |
| 7/29/09 | 17.3 |
| 7/29/09 | 16.2 |
| 7/29/09 | 17.6 |
| 7/29/09 | 17.8 |
| 7/29/09 | 18.2 |
| 7/29/09 | 17.6 |
| 7/29/09 | 18.2 |
| 7/29/09 | 22 |
| 7/29/09 | 16.5 |
| 7/29/09 | 15.8 |
| 7/29/09 | 17.6 |
| 7/29/09 | 18 |
| 7/29/09 | 15.2 |
| 7/29/09 | 16.7 |
| 7/29/09 | 19.2 |
| 7/29/09 | 27.2 |
| 7/29/09 | 18.7 |
| 7/29/09 | 26 |
| 7/29/09 | 18.5 |
| 7/29/09 | 17.9 |
| 7/29/09 | 16.5 |
| 7/29/09 | 16.1 |
| 7/29/09 | 18.5 |
| 7/29/09 | 14.6 |
| 7/29/09 | 33.7 |
| 7/29/09 | 28.4 |
| 7/29/09 | 33.9 |
| 7/29/09 | 34.4 |
| 7/29/09 | 31.9 |
| 7/29/09 | 13.2 |
| 7/29/09 | 15.9 |
| 7/29/09 | 11.9 |
| 7/29/09 | 15.1 |
| 7/29/09 | 9.4 |
| 7/29/09 | 11.6 |
| 7/29/09 | 10.5 |
| 7/29/09 | 12.1 |
| 7/29/09 | 12.8 |
| 7/29/09 | 14.4 |
| 7/29/09 | 13.6 |
| 7/29/09 | 17 |
| 7/28/09 | 13.7 |
| 7/28/09 | 15.7 |
| 7/28/09 | 12.4 |
| 7/28/09 | 16.3 |
| 7/28/09 | 15.6 |
| 7/28/09 | 15.2 |
| 7/28/09 | 21.4 |
| 7/28/09 | 11.8 |
| 7/28/09 | 17.1 |
| 7/28/09 | 10.3 |
| 7/28/09 | 11.7 |
| 7/28/09 | 11.4 |
| 7/28/09 | 11.7 |
| 7/28/09 | 11.8 |
| 7/28/09 | 11.3 |
| 7/28/09 | 13.8 |
| 7/28/09 | 11.7 |
| 7/28/09 | 10.9 |
| 7/28/09 | 9.9 |
| 7/28/09 | 11.7 |
| 7/28/09 | 9.8 |
| 7/28/09 | 12.8 |
| 7/28/09 | 12.8 |
| 7/28/09 | 11.9 |
| 7/28/09 | 14.6 |
| 7/28/09 | 11.7 |
| 7/28/09 | 8.4 |
| 7/28/09 | 10.6 |
| 7/28/09 | 9.1 |
| 7/28/09 | 10.5 |
| 7/28/09 | 10.2 |
| 7/28/09 | 9.1 |
| 7/28/09 | 9.5 |
| 7/28/09 | 12.8 |
| 7/28/09 | 10.6 |
| 7/28/09 | 11.1 |
| 7/28/09 | 9.6 |
| 7/28/09 | 9.9 |
| 7/28/09 | 8.9 |
| 7/28/09 | 9.5 |
| 7/28/09 | 9.2 |
| 7/28/09 | 30.7 |
| 7/28/09 | 8.6 |
| 7/28/09 | 10.9 |
| 7/28/09 | 12.1 |
| 7/28/09 | 12.7 |
| 7/28/09 | 13.6 |
| 7/28/09 | 14.9 |
| 7/27/09 | 14.8 |
| 7/27/09 | 15 |
| 7/27/09 | 14.2 |
| 7/27/09 | 12.1 |
| 7/27/09 | 14.1 |
| 7/27/09 | 12.5 |
| 7/27/09 | 11.3 |
| 7/27/09 | 10.3 |
| 7/27/09 | 12.3 |
| 7/27/09 | 11.7 |
| 7/27/09 | 13.1 |
| 7/27/09 | 14.9 |
| 7/27/09 | 11.2 |
| 7/27/09 | 13.5 |
| 7/27/09 | 14.2 |
| 7/27/09 | 12.3 |
| 7/27/09 | 15.6 |
| 7/27/09 | 16.4 |
| 7/27/09 | 16.6 |
| 7/27/09 | 17.9 |
| 7/27/09 | 25.6 |
| 7/27/09 | 19.6 |
| 7/27/09 | 16 |
| 7/27/09 | 16.3 |
| 7/27/09 | 19.1 |
| 7/27/09 | 16.5 |
| 7/27/09 | 17 |
| 7/27/09 | 15.2 |
| 7/27/09 | 15.8 |
| 7/27/09 | 14.6 |
| 7/27/09 | 13.4 |
| 7/27/09 | 11.7 |
| 7/27/09 | 11.1 |
| 7/27/09 | 12.1 |
| 7/27/09 | 12.1 |
| 7/27/09 | 11.5 |
| 7/27/09 | 11.4 |
| 7/27/09 | 10.9 |
| 7/27/09 | 11 |
| 7/27/09 | 10.8 |
| 7/27/09 | 11.8 |
| 7/27/09 | 10.9 |
| 7/27/09 | 11.4 |
| 7/27/09 | 10.2 |
| 7/27/09 | 10.8 |
| 7/27/09 | 13.3 |
| 7/27/09 | 10.2 |
| 7/27/09 | 11.8 |
| 7/26/09 | 10.8 |
| 7/26/09 | 11.2 |
| 7/26/09 | 13.9 |
| 7/26/09 | 12.1 |
| 7/26/09 | 11.9 |
| 7/26/09 | 14 |
| 7/26/09 | 11.4 |
| 7/26/09 | 9.7 |
| 7/26/09 | 11.8 |
| 7/26/09 | 13.7 |
| 7/26/09 | 15.2 |
| 7/26/09 | 16 |
| 7/26/09 | 19.8 |
| 7/26/09 | 18.7 |
| 7/26/09 | 23 |
| 7/26/09 | 19.7 |
| 7/26/09 | 13.6 |
| 7/26/09 | 12.3 |
| 7/26/09 | 17.2 |
| 7/26/09 | 17.8 |
| 7/26/09 | 16.2 |
| 7/26/09 | 12.1 |
| 7/26/09 | 14.6 |
| 7/26/09 | 11.6 |
| 7/26/09 | 10.5 |
| 7/26/09 | 11.7 |
| 7/26/09 | 11.5 |
| 7/26/09 | 12.4 |
| 7/26/09 | 10.4 |
| 7/26/09 | 11.5 |
| 7/26/09 | 11 |
| 7/26/09 | 9.7 |
| 7/26/09 | 10.3 |
| 7/26/09 | 8.5 |
| 7/26/09 | 8.4 |
| 7/26/09 | 8.9 |
| 7/26/09 | 7.7 |
| 7/26/09 | 8.3 |
| 7/26/09 | 8.2 |
| 7/26/09 | 7.7 |
| 7/26/09 | 8 |
| 7/26/09 | 9.6 |
| 7/26/09 | 9 |
| 7/26/09 | 8.8 |
| 7/26/09 | 9.5 |
| 7/26/09 | 9.8 |
| 7/26/09 | 9 |
| 7/26/09 | 10.4 |
| 7/25/09 | 9.9 |
| 7/25/09 | 10.3 |
| 7/25/09 | 10.7 |
| 7/25/09 | 9.3 |
| 7/25/09 | 11.2 |
| 7/25/09 | 9.3 |
| 7/25/09 | 10.8 |
| 7/25/09 | 10.3 |
| 7/25/09 | 9.4 |
| 7/25/09 | 12.1 |
| 7/25/09 | 12.2 |
| 7/25/09 | 13 |
| 7/25/09 | 9.3 |
| 7/25/09 | 14.4 |
| 7/25/09 | 14.6 |
| 7/25/09 | 12.8 |
| 7/25/09 | 12.6 |
| 7/25/09 | 12 |
| 7/25/09 | 13.1 |
| 7/25/09 | 15 |
| 7/25/09 | 13 |
| 7/25/09 | 10.8 |
| 7/25/09 | 10.1 |
| 7/25/09 | 10.9 |
| 7/25/09 | 14.5 |
| 7/25/09 | 11.4 |
| 7/25/09 | 10.4 |
| 7/25/09 | 8.3 |
| 7/25/09 | 7.7 |
| 7/25/09 | 10.4 |
| 7/25/09 | 7.7 |
| 7/25/09 | 8.5 |
| 7/25/09 | 9 |
| 7/25/09 | 8.9 |
| 7/25/09 | 8.1 |
| 7/25/09 | 8.2 |
| 7/25/09 | 9.1 |
| 7/25/09 | 8.8 |
| 7/25/09 | 8.5 |
| 7/25/09 | 9 |
| 7/25/09 | 9 |
| 7/25/09 | 10.7 |
| 7/25/09 | 8.6 |
| 7/25/09 | 8.8 |
| 7/25/09 | 11.3 |
| 7/25/09 | 11.6 |
| 7/25/09 | 9.5 |
| 7/25/09 | 8.7 |
| 7/24/09 | 9.3 |
| 7/24/09 | 9.5 |
| 7/24/09 | 10.5 |
| 7/24/09 | 13.1 |
| 7/24/09 | 11.9 |
| 7/24/09 | 11.3 |
| 7/24/09 | 12.5 |
| 7/24/09 | 6.9 |
| 7/24/09 | 8.9 |
| 7/24/09 | 9.5 |
| 7/24/09 | 10 |
| 7/24/09 | 11.9 |
| 7/24/09 | 12.2 |
| 7/24/09 | 11.2 |
| 7/24/09 | 12.6 |
| 7/24/09 | 13 |
| 7/24/09 | 13.1 |
| 7/24/09 | 12.9 |
| 7/24/09 | 12.9 |
| 7/24/09 | 9.2 |
| 7/24/09 | 12.1 |
| 7/24/09 | 11.9 |
| 7/24/09 | 10.5 |
| 7/24/09 | 12.8 |
| 7/24/09 | 11.7 |
| 7/24/09 | 12.1 |
| 7/24/09 | 10.5 |
| 7/24/09 | 45.9 |
| 7/24/09 | 10.1 |
| 7/24/09 | 17.9 |
| 7/24/09 | 10 |
| 7/24/09 | 9.9 |
| 7/24/09 | 9.5 |
| 7/24/09 | 9.6 |
| 7/24/09 | 8.1 |
| 7/24/09 | 9.8 |
| 7/24/09 | 8.9 |
| 7/24/09 | 10.3 |
| 7/24/09 | 8 |
| 7/24/09 | 9.5 |
| 7/24/09 | 10.4 |
| 7/24/09 | 10.2 |
| 7/24/09 | 10.1 |
| 7/24/09 | 9.8 |
| 7/24/09 | 10.2 |
| 7/24/09 | 11.6 |
| 7/24/09 | 10.9 |
| 7/24/09 | 10.9 |
| 7/23/09 | 10.6 |
| 7/23/09 | 9.4 |
| 7/23/09 | 9.1 |
| 7/23/09 | 10.1 |
| 7/23/09 | 11.1 |
| 7/23/09 | 12 |
| 7/23/09 | 10.8 |
| 7/23/09 | 13.7 |
| 7/23/09 | 15 |
| 7/23/09 | 17.5 |
| 7/23/09 | 14.6 |
| 7/23/09 | 11.7 |
| 7/23/09 | 14.6 |
| 7/23/09 | 15.1 |
| 7/23/09 | 18.7 |
| 7/23/09 | 13.9 |
| 7/23/09 | 12.4 |
| 7/23/09 | 12.5 |
| 7/23/09 | 10.8 |
| 7/23/09 | 11.1 |
| 7/23/09 | 11.1 |
| 7/23/09 | 10.8 |
| 7/23/09 | 9.7 |
| 7/23/09 | 9.5 |
| 7/23/09 | 9.7 |
| 7/23/09 | 9.1 |
| 7/23/09 | 10.1 |
| 7/23/09 | 9.5 |
| 7/23/09 | 8.3 |
| 7/23/09 | 9.1 |
| 7/23/09 | 7.1 |
| 7/23/09 | 9.7 |
| 7/23/09 | 8.8 |
| 7/23/09 | 8 |
| 7/23/09 | 9.1 |
| 7/23/09 | 8.5 |
| 7/23/09 | 8.6 |
| 7/23/09 | 8.8 |
| 7/23/09 | 9.2 |
| 7/23/09 | 7.8 |
| 7/23/09 | 7.3 |
| 7/23/09 | 8.6 |
| 7/23/09 | 10.1 |
| 7/23/09 | 9.7 |
| 7/23/09 | 9.6 |
| 7/23/09 | 9.8 |
| 7/23/09 | 9.8 |
| 7/23/09 | 9.4 |
| 7/22/09 | 9.6 |
| 7/22/09 | 11.5 |
| 7/22/09 | 9.9 |
| 7/22/09 | 11.1 |
| 7/22/09 | 14.8 |
| 7/22/09 | 10 |
| 7/22/09 | 11.8 |
| 7/22/09 | 11.2 |
| 7/22/09 | 12.2 |
| 7/22/09 | 11.5 |
| 7/22/09 | 11.9 |
| 7/22/09 | 13.7 |
| 7/22/09 | 7.1 |
| 7/22/09 | 11.7 |
| 7/22/09 | 7.6 |
| 7/22/09 | 9.7 |
| 7/22/09 | 8.2 |
| 7/22/09 | 12.4 |
| 7/22/09 | 10.4 |
| 7/22/09 | 13.6 |
| 7/22/09 | 9.9 |
| 7/22/09 | 15.1 |
| 7/22/09 | 9.1 |
| 7/22/09 | 11 |
| 7/22/09 | 17.7 |
| 7/22/09 | 12.1 |
| 7/22/09 | 12.8 |
| 7/22/09 | 12.2 |
| 7/22/09 | 13.8 |
| 7/22/09 | 17.2 |
| 7/22/09 | 14.7 |
| 7/22/09 | 13.7 |
| 7/22/09 | 15.1 |
| 7/22/09 | 11.9 |
| 7/22/09 | 12.8 |
| 7/22/09 | 9.9 |
| 7/22/09 | 11.4 |
| 7/22/09 | 10.1 |
| 7/22/09 | 10.1 |
| 7/22/09 | 10.3 |
| 7/22/09 | 10.7 |
| 7/22/09 | 10.1 |
| 7/22/09 | 10.4 |
| 7/22/09 | 9.7 |
| 7/22/09 | 9.9 |
| 7/22/09 | 9.6 |
| 7/22/09 | 10.9 |
| 7/22/09 | 10.3 |
| 7/21/09 | 13.5 |
| 7/21/09 | 11.9 |
| 7/21/09 | 12.2 |
| 7/21/09 | 11.2 |
| 7/21/09 | 13.5 |
| 7/21/09 | 13.4 |
| 7/21/09 | 13.2 |
| 7/21/09 | 9.7 |
| 7/21/09 | 11.7 |
| 7/21/09 | 11.6 |
| 7/21/09 | 12.4 |
| 7/21/09 | 12.4 |
| 7/21/09 | 13.3 |
| 7/21/09 | 11.4 |
| 7/21/09 | 12.4 |
| 7/21/09 | 13.6 |
| 7/21/09 | 12.2 |
| 7/21/09 | 11.8 |
| 7/21/09 | 13.8 |
| 7/21/09 | 15.1 |
| 7/21/09 | 14.3 |
| 7/21/09 | 15 |
| 7/21/09 | 15.9 |
| 7/21/09 | 16.9 |
| 7/21/09 | 16.6 |
| 7/21/09 | 18 |
| 7/21/09 | 16.6 |
| 7/21/09 | 18.1 |
| 7/21/09 | 19 |
| 7/21/09 | 14.6 |
| 7/21/09 | 13.5 |
| 7/21/09 | 14.5 |
| 7/21/09 | 11.2 |
| 7/21/09 | 9.9 |
| 7/21/09 | 11.4 |
| 7/21/09 | 11.1 |
| 7/21/09 | 9 |
| 7/21/09 | 9.3 |
| 7/21/09 | 8.5 |
| 7/21/09 | 9.1 |
| 7/21/09 | 10.2 |
| 7/21/09 | 10 |
| 7/21/09 | 9.6 |
| 7/21/09 | 10.3 |
| 7/21/09 | 9.1 |
| 7/21/09 | 8.6 |
| 7/21/09 | 10.3 |
| 7/21/09 | 9.2 |
| 7/20/09 | 9.9 |
| 7/20/09 | 9.9 |
| 7/20/09 | 9.7 |
| 7/20/09 | 10.3 |
| 7/20/09 | 10.2 |
| 7/20/09 | 11.4 |
| 7/20/09 | 13.6 |
| 7/20/09 | 11.5 |
| 7/20/09 | 11.3 |
| 7/20/09 | 17.4 |
| 7/20/09 | 7.8 |
| 7/20/09 | 8.7 |
| 7/20/09 | 9.4 |
| 7/20/09 | 9.7 |
| 7/20/09 | 9 |
| 7/20/09 | 8.8 |
| 7/20/09 | 9.5 |
| 7/20/09 | 11.6 |
| 7/20/09 | 10.9 |
| 7/20/09 | 12.3 |
| 7/20/09 | 12.2 |
| 7/20/09 | 11.9 |
| 7/20/09 | 12.2 |
| 7/20/09 | 11.6 |
| 7/20/09 | 12.2 |
| 7/20/09 | 11.1 |
| 7/20/09 | 13.9 |
| 7/20/09 | 14.5 |
| 7/20/09 | 12.6 |
| 7/20/09 | 12.7 |
| 7/20/09 | 10.1 |
| 7/20/09 | 11.4 |
| 7/20/09 | 10.7 |
| 7/20/09 | 11.6 |
| 7/20/09 | 11.8 |
| 7/20/09 | 10.9 |
| 7/20/09 | 10.5 |
| 7/20/09 | 11.9 |
| 7/20/09 | 10.7 |
| 7/20/09 | 10.3 |
| 7/20/09 | 10.3 |
| 7/20/09 | 10 |
| 7/20/09 | 11.1 |
| 7/20/09 | 11.5 |
| 7/20/09 | 12.2 |
| 7/20/09 | 10.7 |
| 7/20/09 | 11.8 |
| 7/20/09 | 13.8 |
| 7/19/09 | 12.2 |
| 7/19/09 | 11.4 |
| 7/19/09 | 11.4 |
| 7/19/09 | 13.9 |
| 7/19/09 | 14.7 |
| 7/19/09 | 12.6 |
| 7/19/09 | 12.7 |
| 7/19/09 | 11.5 |
| 7/19/09 | 11.2 |
| 7/19/09 | 12.6 |
| 7/19/09 | 13.5 |
| 7/19/09 | 10.5 |
| 7/19/09 | 11.1 |
| 7/19/09 | 12.4 |
| 7/19/09 | 12 |
| 7/19/09 | 15.9 |
| 7/19/09 | 13.6 |
| 7/19/09 | 16.7 |
| 7/19/09 | 14.5 |
| 7/19/09 | 17.6 |
| 7/19/09 | 16.1 |
| 7/19/09 | 13.9 |
| 7/19/09 | 15.6 |
| 7/19/09 | 16.8 |
| 7/19/09 | 15.4 |
| 7/19/09 | 16.1 |
| 7/19/09 | 14.8 |
| 7/19/09 | 13.9 |
| 7/19/09 | 17.1 |
| 7/19/09 | 15.1 |
| 7/19/09 | 17 |
| 7/19/09 | 15 |
| 7/19/09 | 16.2 |
| 7/19/09 | 18 |
| 7/19/09 | 16.6 |
| 7/19/09 | 19.9 |
| 7/19/09 | 19.9 |
| 7/19/09 | 16.4 |
| 7/19/09 | 16.7 |
| 7/19/09 | 21.9 |
| 7/19/09 | 17.1 |
| 7/19/09 | 18 |
| 7/19/09 | 16.4 |
| 7/19/09 | 16.4 |
| 7/19/09 | 13 |
| 7/19/09 | 14.4 |
| 7/19/09 | 12.5 |
| 7/19/09 | 15.3 |
| 7/18/09 | 13.8 |
| 7/18/09 | 14.2 |
| 7/18/09 | 12 |
| 7/18/09 | 12.9 |
| 7/18/09 | 13.6 |
| 7/18/09 | 15.1 |
| 7/18/09 | 13.5 |
| 7/18/09 | 11.6 |
| 7/18/09 | 12 |
| 7/18/09 | 14.5 |
| 7/18/09 | 15.3 |
| 7/18/09 | 17 |
| 7/18/09 | 18.9 |
| 7/18/09 | 14.8 |
| 7/18/09 | 15.7 |
| 7/18/09 | 13.2 |
| 7/18/09 | 13.7 |
| 7/18/09 | 14.3 |
| 7/18/09 | 14 |
| 7/18/09 | 16.5 |
| 7/18/09 | 17.8 |
| 7/18/09 | 17.4 |
| 7/18/09 | 17.3 |
| 7/18/09 | 17.6 |
| 7/18/09 | 15.7 |
| 7/18/09 | 18.1 |
| 7/18/09 | 17.9 |
| 7/18/09 | 22 |
| 7/18/09 | 19.7 |
| 7/18/09 | 18.6 |
| 7/18/09 | 21.8 |
| 7/18/09 | 20.2 |
| 7/18/09 | 17.4 |
| 7/18/09 | 16.7 |
| 7/18/09 | 16.5 |
| 7/18/09 | 13.6 |
| 7/18/09 | 15.7 |
| 7/18/09 | 14.6 |
| 7/18/09 | 12.4 |
| 7/18/09 | 14.2 |
| 7/18/09 | 12.3 |
| 7/18/09 | 14 |
| 7/18/09 | 15.7 |
| 7/18/09 | 15.2 |
| 7/18/09 | 12.1 |
| 7/18/09 | 16.3 |
| 7/18/09 | 14.3 |
| 7/18/09 | 12.5 |
| 7/17/09 | 13.9 |
| 7/17/09 | 11.6 |
| 7/17/09 | 13.4 |
| 7/17/09 | 11.6 |
| 7/17/09 | 12.3 |
| 7/17/09 | 11.9 |
| 7/17/09 | 12.2 |
| 7/17/09 | 11.4 |
| 7/17/09 | 11 |
| 7/17/09 | 11.7 |
| 7/17/09 | 10 |
| 7/17/09 | 12.5 |
| 7/17/09 | 12.2 |
| 7/17/09 | 11.3 |
| 7/17/09 | 10.5 |
| 7/17/09 | 13.2 |
| 7/17/09 | 12.3 |
| 7/17/09 | 12.2 |
| 7/17/09 | 11.6 |
| 7/17/09 | 10.3 |
| 7/17/09 | 9.5 |
| 7/17/09 | 9.4 |
| 7/17/09 | 12.1 |
| 7/17/09 | 8.3 |
| 7/17/09 | 9.1 |
| 7/17/09 | 8.2 |
| 7/17/09 | 10.1 |
| 7/17/09 | 9.1 |
| 7/17/09 | 8.3 |
| 7/17/09 | 9 |
| 7/17/09 | 10.8 |
| 7/17/09 | 9 |
| 7/17/09 | 8.4 |
| 7/17/09 | 8.3 |
| 7/17/09 | 9 |
| 7/17/09 | 9.3 |
| 7/17/09 | 8.2 |
| 7/17/09 | 8.8 |
| 7/17/09 | 7.5 |
| 7/17/09 | 9.2 |
| 7/17/09 | 8.3 |
| 7/17/09 | 8.2 |
| 7/17/09 | 9.3 |
| 7/17/09 | 7.3 |
| 7/17/09 | 9 |
| 7/17/09 | 9.6 |
| 7/17/09 | 8.8 |
| 7/17/09 | 7.9 |
| 7/16/09 | 8.3 |
| 7/16/09 | 8.1 |
| 7/16/09 | 8.8 |
| 7/16/09 | 9.9 |
| 7/16/09 | 9.3 |
| 7/16/09 | 10.1 |
| 7/16/09 | 9.1 |
| 7/16/09 | 10 |
| 7/16/09 | 9.8 |
| 7/16/09 | 10.5 |
| 7/16/09 | 13.8 |
| 7/16/09 | 11.9 |
| 7/16/09 | 14.7 |
| 7/16/09 | 14.5 |
| 7/16/09 | 13.8 |
| 7/16/09 | 15 |
| 7/16/09 | 18.1 |
| 7/16/09 | 14.5 |
| 7/16/09 | 21.6 |
| 7/16/09 | 21.1 |
| 7/16/09 | 20.5 |
| 7/16/09 | 20.7 |
| 7/16/09 | 17.9 |
| 7/16/09 | 15.1 |
| 7/16/09 | 11.7 |
| 7/16/09 | 14.4 |
| 7/16/09 | 12.9 |
| 7/16/09 | 11.9 |
| 7/16/09 | 11.6 |
| 7/16/09 | 9.6 |
| 7/16/09 | 9.6 |
| 7/16/09 | 9.2 |
| 7/16/09 | 9.5 |
| 7/16/09 | 9.3 |
| 7/16/09 | 8.9 |
| 7/16/09 | 7.4 |
| 7/16/09 | 9.9 |
| 7/16/09 | 7.1 |
| 7/16/09 | 8 |
| 7/16/09 | 7.5 |
| 7/16/09 | 9 |
| 7/16/09 | 7.9 |
| 7/16/09 | 7.6 |
| 7/16/09 | 6.7 |
| 7/16/09 | 6.6 |
| 7/16/09 | 7.5 |
| 7/16/09 | 7 |
| 7/16/09 | 7.3 |
| 7/15/09 | 7.7 |
| 7/15/09 | 7.1 |
| 7/15/09 | 8.2 |
| 7/15/09 | 7.5 |
| 7/15/09 | 8.1 |
| 7/15/09 | 9 |
| 7/15/09 | 10.1 |
| 7/15/09 | 10 |
| 7/15/09 | 10.2 |
| 7/15/09 | 11.2 |
| 7/15/09 | 10.2 |
| 7/15/09 | 10.3 |
| 7/15/09 | 12.7 |
| 7/15/09 | 12.6 |
| 7/15/09 | 11.1 |
| 7/15/09 | 11.7 |
| 7/15/09 | 10.9 |
| 7/15/09 | 12.2 |
| 7/15/09 | 12.5 |
| 7/15/09 | 14 |
| 7/15/09 | 14.6 |
| 7/15/09 | 11.6 |
| 7/15/09 | 10.3 |
| 7/15/09 | 11.5 |
| 7/15/09 | 11 |
| 7/15/09 | 11.6 |
| 7/15/09 | 12.9 |
| 7/15/09 | 13.7 |
| 7/15/09 | 12.6 |
| 7/15/09 | 14.3 |
| 7/15/09 | 12.9 |
| 7/15/09 | 13.6 |
| 7/15/09 | 11.8 |
| 7/15/09 | 10.8 |
| 7/15/09 | 11.5 |
| 7/15/09 | 10 |
| 7/15/09 | 8.8 |
| 7/15/09 | 9 |
| 7/15/09 | 7.3 |
| 7/15/09 | 9.3 |
| 7/15/09 | 8.1 |
| 7/15/09 | 10 |
| 7/15/09 | 7.6 |
| 7/15/09 | 7.3 |
| 7/15/09 | 9.9 |
| 7/15/09 | 8 |
| 7/15/09 | 6.8 |
| 7/15/09 | 7.5 |
| 7/14/09 | 7.5 |
| 7/14/09 | 7.9 |
| 7/14/09 | 8.3 |
| 7/14/09 | 8.2 |
| 7/14/09 | 9 |
| 7/14/09 | 9.4 |
| 7/14/09 | 9.1 |
| 7/14/09 | 9.1 |
| 7/14/09 | 9.1 |
| 7/14/09 | 10.7 |
| 7/14/09 | 12.7 |
| 7/14/09 | 15.5 |
| 7/14/09 | 14.5 |
| 7/14/09 | 15.7 |
| 7/14/09 | 17.7 |
| 7/14/09 | 15.1 |
| 7/14/09 | 12.8 |
| 7/14/09 | 12.2 |
| 7/14/09 | 14.7 |
| 7/14/09 | 14.2 |
| 7/14/09 | 14.4 |
| 7/14/09 | 18.3 |
| 7/14/09 | 15.6 |
| 7/14/09 | 16 |
| 7/14/09 | 15.5 |
| 7/14/09 | 15.1 |
| 7/14/09 | 15.8 |
| 7/14/09 | 15.9 |
| 7/14/09 | 11.6 |
| 7/14/09 | 14 |
| 7/14/09 | 13.1 |
| 7/14/09 | 13.8 |
| 7/14/09 | 11.7 |
| 7/14/09 | 11.9 |
| 7/14/09 | 10.7 |
| 7/14/09 | 11 |
| 7/14/09 | 8.7 |
| 7/14/09 | 10.4 |
| 7/14/09 | 9.5 |
| 7/14/09 | 7.7 |
| 7/14/09 | 7.4 |
| 7/14/09 | 8.3 |
| 7/14/09 | 6.6 |
| 7/14/09 | 6.3 |
| 7/14/09 | 7.2 |
| 7/14/09 | 6.8 |
| 7/14/09 | 6.3 |
| 7/14/09 | 6.1 |
| 7/13/09 | 6.7 |
| 7/13/09 | 6.6 |
| 7/13/09 | 8 |
| 7/13/09 | 7.1 |
| 7/13/09 | 7.9 |
| 7/13/09 | 6.8 |
| 7/13/09 | 6.8 |
| 7/13/09 | 7.1 |
| 7/13/09 | 8.3 |
| 7/13/09 | 10.4 |
| 7/13/09 | 7.6 |
| 7/13/09 | 9.5 |
| 7/13/09 | 9.3 |
| 7/13/09 | 10.2 |
| 7/13/09 | 12.2 |
| 7/13/09 | 12.7 |
| 7/13/09 | 10.9 |
| 7/13/09 | 12.7 |
| 7/13/09 | 12.3 |
| 7/13/09 | 12.4 |
| 7/13/09 | 9.1 |
| 7/13/09 | 10.8 |
| 7/13/09 | 10.6 |
| 7/13/09 | 9.9 |
| 7/13/09 | 8.9 |
| 7/13/09 | 8.6 |
| 7/13/09 | 9 |
| 7/13/09 | 7.9 |
| 7/13/09 | 8.3 |
| 7/13/09 | 7.4 |
| 7/13/09 | 7.6 |
| 7/13/09 | 7.4 |
| 7/13/09 | 6.9 |
| 7/13/09 | 6.5 |
| 7/13/09 | 5.9 |
| 7/13/09 | 6.9 |
| 7/13/09 | 6.3 |
| 7/13/09 | 5.9 |
| 7/13/09 | 6.4 |
| 7/13/09 | 6 |
| 7/13/09 | 6.7 |
| 7/13/09 | 6.2 |
| 7/13/09 | 6.6 |
| 7/13/09 | 6.3 |
| 7/13/09 | 6.1 |
| 7/13/09 | 6 |
| 7/13/09 | 6.9 |
| 7/13/09 | 6.8 |
| 7/12/09 | 6.2 |
| 7/12/09 | 6.3 |
| 7/12/09 | 7.7 |
| 7/12/09 | 7.1 |
| 7/12/09 | 7 |
| 7/12/09 | 7.1 |
| 7/12/09 | 7.7 |
| 7/12/09 | 7.6 |
| 7/12/09 | 10.1 |
| 7/12/09 | 7.9 |
| 7/12/09 | 7.9 |
| 7/12/09 | 10.3 |
| 7/12/09 | 7.7 |
| 7/12/09 | 10 |
| 7/12/09 | 8.9 |
| 7/12/09 | 7.6 |
| 7/12/09 | 8.5 |
| 7/12/09 | 9.2 |
| 7/12/09 | 9.1 |
| 7/12/09 | 11.6 |
| 7/12/09 | 10.1 |
| 7/12/09 | 10.1 |
| 7/12/09 | 9.6 |
| 7/12/09 | 8.6 |
| 7/12/09 | 9.2 |
| 7/12/09 | 9.9 |
| 7/12/09 | 9.3 |
| 7/12/09 | 7 |
| 7/12/09 | 7.7 |
| 7/12/09 | 8.8 |
| 7/12/09 | 7.1 |
| 7/12/09 | 7 |
| 7/12/09 | 6.4 |
| 7/12/09 | 5.6 |
| 7/12/09 | 5.7 |
| 7/12/09 | 6.1 |
| 7/12/09 | 6.4 |
| 7/12/09 | 5.5 |
| 7/12/09 | 6.4 |
| 7/12/09 | 6.7 |
| 7/12/09 | 6.4 |
| 7/12/09 | 5.8 |
| 7/12/09 | 5.4 |
| 7/12/09 | 5.8 |
| 7/12/09 | 7.3 |
| 7/12/09 | 6.7 |
| 7/12/09 | 6 |
| 7/12/09 | 6.4 |
| 7/11/09 | 9 |
| 7/11/09 | 8.6 |
| 7/11/09 | 8.4 |
| 7/11/09 | 8 |
| 7/11/09 | 7.2 |
| 7/11/09 | 7.7 |
| 7/11/09 | 7.9 |
| 7/11/09 | 7.8 |
| 7/11/09 | 11.5 |
| 7/11/09 | 11.7 |
| 7/11/09 | 8.9 |
| 7/11/09 | 8.5 |
| 7/11/09 | 11.8 |
| 7/11/09 | 13.1 |
| 7/11/09 | 7.5 |
| 7/11/09 | 7 |
| 7/11/09 | 6.1 |
| 7/11/09 | 6.8 |
| 7/11/09 | 6.9 |
| 7/11/09 | 7.1 |
| 7/11/09 | 5.6 |
| 7/11/09 | 6.2 |
| 7/11/09 | 7 |
| 7/11/09 | 8.2 |
| 7/11/09 | 7 |
| 7/11/09 | 7.1 |
| 7/11/09 | 8.6 |
| 7/11/09 | 5.4 |
| 7/11/09 | 4.8 |
| 7/11/09 | 4.8 |
| 7/11/09 | 5.1 |
| 7/11/09 | 4.9 |
| 7/11/09 | 4.8 |
| 7/11/09 | 4.9 |
| 7/11/09 | 4.9 |
| 7/11/09 | 3.9 |
| 7/11/09 | 4.9 |
| 7/11/09 | 4.4 |
| 7/11/09 | 4.7 |
| 7/11/09 | 4.2 |
| 7/11/09 | 5.3 |
| 7/11/09 | 5.6 |
| 7/11/09 | 5.7 |
| 7/11/09 | 4.8 |
| 7/11/09 | 4.6 |
| 7/11/09 | 4.8 |
| 7/11/09 | 4.5 |
| 7/11/09 | 5.3 |
| 7/10/09 | 5.9 |
| 7/10/09 | 5.9 |
| 7/10/09 | 5.7 |
| 7/10/09 | 6.5 |
| 7/10/09 | 6 |
| 7/10/09 | 6.5 |
| 7/10/09 | 5.8 |
| 7/10/09 | 6.1 |
| 7/10/09 | 6.7 |
| 7/10/09 | 6.4 |
| 7/10/09 | 6.2 |
| 7/10/09 | 7.1 |
| 7/10/09 | 7.7 |
| 7/10/09 | 6.6 |
| 7/10/09 | 7.8 |
| 7/10/09 | 7.6 |
| 7/10/09 | 7.2 |
| 7/10/09 | 6.8 |
| 7/10/09 | 9 |
| 7/10/09 | 6.4 |
| 7/10/09 | 7.4 |
| 7/10/09 | 7.7 |
| 7/10/09 | 8.7 |
| 7/10/09 | 8.5 |
| 7/10/09 | 8.2 |
| 7/10/09 | 8.1 |
| 7/10/09 | 7.5 |
| 7/10/09 | 7.4 |
| 7/10/09 | 7 |
| 7/10/09 | 6.7 |
| 7/10/09 | 6.1 |
| 7/10/09 | 6.1 |
| 7/10/09 | 6.6 |
| 7/10/09 | 8.1 |
| 7/10/09 | 6.9 |
| 7/10/09 | 6.5 |
| 7/10/09 | 7.4 |
| 7/10/09 | 6 |
| 7/10/09 | 5.8 |
| 7/10/09 | 6.2 |
| 7/10/09 | 6.1 |
| 7/10/09 | 6.5 |
| 7/10/09 | 5.7 |
| 7/10/09 | 6.9 |
| 7/10/09 | 6.3 |
| 7/10/09 | 6 |
| 7/10/09 | 5.8 |
| 7/10/09 | 7.4 |
| 7/9/09 | 7.2 |
| 7/9/09 | 7.4 |
| 7/9/09 | 6.6 |
| 7/9/09 | 7.3 |
| 7/9/09 | 7.4 |
| 7/9/09 | 8.4 |
| 7/9/09 | 7.2 |
| 7/9/09 | 8.2 |
| 7/9/09 | 9.5 |
| 7/9/09 | 9.4 |
| 7/9/09 | 9.5 |
| 7/9/09 | 7.8 |
| 7/9/09 | 9.2 |
| 7/9/09 | 7.4 |
| 7/9/09 | 10 |
| 7/9/09 | 9.9 |
| 7/9/09 | 9.1 |
| 7/9/09 | 10.9 |
| 7/9/09 | 9 |
| 7/9/09 | 10 |
| 7/9/09 | 9.8 |
| 7/9/09 | 9.4 |
| 7/9/09 | 10.5 |
| 7/9/09 | 10.4 |
| 7/9/09 | 10.9 |
| 7/9/09 | 11 |
| 7/9/09 | 10.8 |
| 7/9/09 | 11.4 |
| 7/9/09 | 12 |
| 7/9/09 | 11.3 |
| 7/9/09 | 11.5 |
| 7/9/09 | 10.2 |
| 7/9/09 | 10.2 |
| 7/9/09 | 9.5 |
| 7/9/09 | 10.5 |
| 7/9/09 | 9.5 |
| 7/9/09 | 10.2 |
| 7/9/09 | 8.2 |
| 7/9/09 | 7.7 |
| 7/9/09 | 7.3 |
| 7/9/09 | 6.5 |
| 7/9/09 | 7.6 |
| 7/9/09 | 6.8 |
| 7/9/09 | 7.1 |
| 7/9/09 | 7.5 |
| 7/9/09 | 8.4 |
| 7/9/09 | 7.5 |
| 7/9/09 | 7.7 |
| 7/8/09 | 7.6 |
| 7/8/09 | 6.9 |
| 7/8/09 | 7.3 |
| 7/8/09 | 8.8 |
| 7/8/09 | 9.5 |
| 7/8/09 | 9.1 |
| 7/8/09 | 8.8 |
| 7/8/09 | 9.2 |
| 7/8/09 | 9.6 |
| 7/8/09 | 9.7 |
| 7/8/09 | 8.8 |
| 7/8/09 | 10.3 |
| 7/8/09 | 10.2 |
| 7/8/09 | 10.7 |
| 7/8/09 | 11.1 |
| 7/8/09 | 12.6 |
| 7/8/09 | 12.5 |
| 7/8/09 | 9.9 |
| 7/8/09 | 11.8 |
| 7/8/09 | 12.5 |
| 7/8/09 | 13.5 |
| 7/8/09 | 13.6 |
| 7/8/09 | 13 |
| 7/8/09 | 12.8 |
| 7/8/09 | 13.6 |
| 7/8/09 | 13.5 |
| 7/8/09 | 14.7 |
| 7/8/09 | 13.6 |
| 7/8/09 | 13.9 |
| 7/8/09 | 12.7 |
| 7/8/09 | 11.9 |
| 7/8/09 | 11.7 |
| 7/8/09 | 10.7 |
| 7/8/09 | 12 |
| 7/8/09 | 9.9 |
| 7/8/09 | 10.2 |
| 7/8/09 | 8.8 |
| 7/8/09 | 8.7 |
| 7/8/09 | 9.4 |
| 7/8/09 | 8.3 |
| 7/8/09 | 8.8 |
| 7/8/09 | 10.6 |
| 7/8/09 | 9.4 |
| 7/8/09 | 8.2 |
| 7/8/09 | 8.6 |
| 7/8/09 | 8.4 |
| 7/8/09 | 8.5 |
| 7/8/09 | 8.7 |
| 7/7/09 | 9.1 |
| 7/7/09 | 8.8 |
| 7/7/09 | 10 |
| 7/7/09 | 9.5 |
| 7/7/09 | 10.4 |
| 7/7/09 | 10.1 |
| 7/7/09 | 9.6 |
| 7/7/09 | 11.4 |
| 7/7/09 | 10.8 |
| 7/7/09 | 12 |
| 7/7/09 | 12.1 |
| 7/7/09 | 12.9 |
| 7/7/09 | 12.5 |
| 7/7/09 | 16.2 |
| 7/7/09 | 15.1 |
| 7/7/09 | 13.2 |
| 7/7/09 | 15.4 |
| 7/7/09 | 17.3 |
| 7/7/09 | 16.6 |
| 7/7/09 | 14.7 |
| 7/7/09 | 11.7 |
| 7/7/09 | 10.7 |
| 7/7/09 | 10.9 |
| 7/7/09 | 11.4 |
| 7/7/09 | 10.2 |
| 7/7/09 | 10.5 |
| 7/7/09 | 8.8 |
| 7/7/09 | 8.5 |
| 7/7/09 | 9.8 |
| 7/7/09 | 8.7 |
| 7/7/09 | 7.6 |
| 7/7/09 | 7.6 |
| 7/7/09 | 7.5 |
| 7/7/09 | 7.8 |
| 7/7/09 | 7.9 |
| 7/7/09 | 8.7 |
| 7/7/09 | 8.2 |
| 7/7/09 | 7.6 |
| 7/7/09 | 7.5 |
| 7/7/09 | 7.3 |
| 7/7/09 | 7.5 |
| 7/7/09 | 7.3 |
| 7/7/09 | 7.8 |
| 7/7/09 | 8.4 |
| 7/7/09 | 8.9 |
| 7/7/09 | 8.6 |
| 7/7/09 | 7.3 |
| 7/7/09 | 7.6 |
| 7/6/09 | 7.9 |
| 7/6/09 | 7.8 |
| 7/6/09 | 8.9 |
| 7/6/09 | 9.6 |
| 7/6/09 | 8.9 |
| 7/6/09 | 9.6 |
| 7/6/09 | 9.3 |
| 7/6/09 | 8.5 |
| 7/6/09 | 7.9 |
| 7/6/09 | 7.6 |
| 7/6/09 | 9.6 |
| 7/6/09 | 9.7 |
| 7/6/09 | 9.8 |
| 7/6/09 | 10.9 |
| 7/6/09 | 11.6 |
| 7/6/09 | 11.5 |
| 7/6/09 | 13.1 |
| 7/6/09 | 9.7 |
| 7/6/09 | 10.5 |
| 7/6/09 | 9.1 |
| 7/6/09 | 11.4 |
| 7/6/09 | 11.3 |
| 7/6/09 | 9.4 |
| 7/6/09 | 7.4 |
| 7/6/09 | 9.1 |
| 7/6/09 | 9 |
| 7/6/09 | 8.1 |
| 7/6/09 | 7.4 |
| 7/6/09 | 8.5 |
| 7/6/09 | 8.2 |
| 7/6/09 | 8.6 |
| 7/6/09 | 8.5 |
| 7/6/09 | 7.8 |
| 7/6/09 | 7.7 |
| 7/6/09 | 8.9 |
| 7/6/09 | 8.6 |
| 7/6/09 | 8.4 |
| 7/6/09 | 7.5 |
| 7/6/09 | 7.7 |
| 7/6/09 | 8.2 |
| 7/6/09 | 8.7 |
| 7/6/09 | 8.3 |
| 7/6/09 | 7.9 |
| 7/6/09 | 9.1 |
| 7/6/09 | 8.4 |
| 7/6/09 | 9.2 |
| 7/6/09 | 9.6 |
| 7/6/09 | 10.5 |
| 7/5/09 | 9.8 |
| 7/5/09 | 11.2 |
| 7/5/09 | 9.4 |
| 7/5/09 | 10.4 |
| 7/5/09 | 12.1 |
| 7/5/09 | 10.4 |
| 7/5/09 | 9.9 |
| 7/5/09 | 10.4 |
| 7/5/09 | 10.7 |
| 7/5/09 | 10.6 |
| 7/5/09 | 12 |
| 7/5/09 | 12.5 |
| 7/5/09 | 10.7 |
| 7/5/09 | 13.3 |
| 7/5/09 | 11.4 |
| 7/5/09 | 11.4 |
| 7/5/09 | 11.5 |
| 7/5/09 | 12 |
| 7/5/09 | 12.8 |
| 7/5/09 | 12 |
| 7/5/09 | 11.8 |
| 7/5/09 | 13.8 |
| 7/5/09 | 15.1 |
| 7/5/09 | 15.3 |
| 7/5/09 | 11.1 |
| 7/5/09 | 12.2 |
| 7/5/09 | 12.3 |
| 7/5/09 | 13.1 |
| 7/5/09 | 14.3 |
| 7/5/09 | 14.5 |
| 7/5/09 | 15 |
| 7/5/09 | 14.3 |
| 7/5/09 | 14 |
| 7/5/09 | 11.9 |
| 7/5/09 | 11.8 |
| 7/5/09 | 11 |
| 7/5/09 | 10.8 |
| 7/5/09 | 9.6 |
| 7/5/09 | 10.5 |
| 7/5/09 | 10 |
| 7/5/09 | 10.2 |
| 7/5/09 | 9.1 |
| 7/5/09 | 10.1 |
| 7/5/09 | 11.5 |
| 7/5/09 | 11.1 |
| 7/5/09 | 10.4 |
| 7/5/09 | 10.8 |
| 7/5/09 | 10 |
| 7/4/09 | 12.6 |
| 7/4/09 | 11.2 |
| 7/4/09 | 11.4 |
| 7/4/09 | 12.2 |
| 7/4/09 | 12.6 |
| 7/4/09 | 12.5 |
| 7/4/09 | 12.4 |
| 7/4/09 | 12.1 |
| 7/4/09 | 13.4 |
| 7/4/09 | 12.6 |
| 7/4/09 | 12.7 |
| 7/4/09 | 13.7 |
| 7/4/09 | 13 |
| 7/4/09 | 14.2 |
| 7/4/09 | 13.2 |
| 7/4/09 | 13.7 |
| 7/4/09 | 15.9 |
| 7/4/09 | 18 |
| 7/4/09 | 18.6 |
| 7/4/09 | 20.4 |
| 7/4/09 | 18 |
| 7/4/09 | 16.1 |
| 7/4/09 | 20.6 |
| 7/4/09 | 18.7 |
| 7/4/09 | 16.2 |
| 7/4/09 | 18.3 |
| 7/4/09 | 18.8 |
| 7/4/09 | 20.1 |
| 7/4/09 | 17.7 |
| 7/4/09 | 15.9 |
| 7/4/09 | 14.8 |
| 7/4/09 | 16 |
| 7/4/09 | 14.7 |
| 7/4/09 | 14.7 |
| 7/4/09 | 14.3 |
| 7/4/09 | 13.7 |
| 7/4/09 | 12 |
| 7/4/09 | 10.1 |
| 7/4/09 | 10.9 |
| 7/4/09 | 10.8 |
| 7/4/09 | 11.5 |
| 7/4/09 | 11.8 |
| 7/4/09 | 9.2 |
| 7/4/09 | 10.7 |
| 7/4/09 | 9.7 |
| 7/4/09 | 11.6 |
| 7/4/09 | 11.3 |
| 7/4/09 | 9.4 |
| 7/3/09 | 10.1 |
| 7/3/09 | 11.7 |
| 7/3/09 | 11.5 |
| 7/3/09 | 11.9 |
| 7/3/09 | 12.4 |
| 7/3/09 | 12 |
| 7/3/09 | 16.6 |
| 7/3/09 | 12.4 |
| 7/3/09 | 13.9 |
| 7/3/09 | 14.1 |
| 7/3/09 | 17.5 |
| 7/3/09 | 16 |
| 7/3/09 | 16.7 |
| 7/3/09 | 17.7 |
| 7/3/09 | 17.8 |
| 7/3/09 | 17.9 |
| 7/3/09 | 17.3 |
| 7/3/09 | 17.3 |
| 7/3/09 | 18.5 |
| 7/3/09 | 18.5 |
| 7/3/09 | 18 |
| 7/3/09 | 18.8 |
| 7/3/09 | 17.3 |
| 7/3/09 | 19.9 |
| 7/3/09 | 20.9 |
| 7/3/09 | 21.6 |
| 7/3/09 | 21.5 |
| 7/3/09 | 21.3 |
| 7/3/09 | 21.8 |
| 7/3/09 | 24.1 |
| 7/3/09 | 25.4 |
| 7/3/09 | 24.3 |
| 7/3/09 | 21.8 |
| 7/3/09 | 22.8 |
| 7/3/09 | 21.9 |
| 7/3/09 | 22.4 |
| 7/3/09 | 19.8 |
| 7/3/09 | 18.7 |
| 7/3/09 | 17.6 |
| 7/3/09 | 18.3 |
| 7/3/09 | 15.6 |
| 7/3/09 | 16.7 |
| 7/3/09 | 18.3 |
| 7/3/09 | 16.3 |
| 7/3/09 | 17.3 |
| 7/3/09 | 16.7 |
| 7/3/09 | 15.6 |
| 7/3/09 | 18.3 |
| 7/2/09 | 15 |
| 7/2/09 | 13.9 |
| 7/2/09 | 14 |
| 7/2/09 | 12.4 |
| 7/2/09 | 12.2 |
| 7/2/09 | 13.6 |
| 7/2/09 | 13.8 |
| 7/2/09 | 11.7 |
| 7/2/09 | 12.7 |
| 7/2/09 | 11 |
| 7/2/09 | 12.3 |
| 7/2/09 | 11.3 |
| 7/2/09 | 10.5 |
| 7/2/09 | 11.4 |
| 7/2/09 | 10.9 |
| 7/2/09 | 11.5 |
| 7/2/09 | 12.4 |
| 7/2/09 | 13 |
| 7/2/09 | 13.4 |
| 7/2/09 | 13.4 |
| 7/2/09 | 13.9 |
| 7/2/09 | 11.3 |
| 7/2/09 | 10.8 |
| 7/2/09 | 13.9 |
| 7/2/09 | 12.2 |
| 7/2/09 | 11.8 |
| 7/2/09 | 12.6 |
| 7/2/09 | 12.1 |
| 7/2/09 | 11.6 |
| 7/2/09 | 10.8 |
| 7/2/09 | 12.3 |
| 7/2/09 | 10.2 |
| 7/2/09 | 9.8 |
| 7/2/09 | 9.5 |
| 7/2/09 | 8.7 |
| 7/2/09 | 9 |
| 7/2/09 | 9.4 |
| 7/2/09 | 8.1 |
| 7/2/09 | 7.8 |
| 7/2/09 | 8.8 |
| 7/2/09 | 9.4 |
| 7/2/09 | 6.8 |
| 7/2/09 | 7.6 |
| 7/2/09 | 7.6 |
| 7/2/09 | 8.4 |
| 7/2/09 | 7.6 |
| 7/2/09 | 7.1 |
| 7/2/09 | 7.6 |
| 7/1/09 | 8 |
| 7/1/09 | 8.5 |
| 7/1/09 | 8.2 |
| 7/1/09 | 8.8 |
| 7/1/09 | 9.1 |
| 7/1/09 | 9.7 |
| 7/1/09 | 9.8 |
| 7/1/09 | 10 |
| 7/1/09 | 9.9 |
| 7/1/09 | 11.5 |
| 7/1/09 | 9.4 |
| 7/1/09 | 9.7 |
| 7/1/09 | 10.5 |
| 7/1/09 | 10.7 |
| 7/1/09 | 10.4 |
| 7/1/09 | 11.8 |
| 7/1/09 | 14 |
| 7/1/09 | 11.5 |
| 7/1/09 | 11.5 |
| 7/1/09 | 11.5 |
| 7/1/09 | 11 |
| 7/1/09 | 11.7 |
| 7/1/09 | 11.6 |
| 7/1/09 | 11.4 |
| 7/1/09 | 14.8 |
| 7/1/09 | 14.5 |
| 7/1/09 | 16.9 |
| 7/1/09 | 14.1 |
| 7/1/09 | 14.8 |
| 7/1/09 | 14.7 |
| 7/1/09 | 20.1 |
| 7/1/09 | 19.8 |
| 7/1/09 | 20.6 |
| 7/1/09 | 18.9 |
| 7/1/09 | 20.9 |
| 7/1/09 | 17.4 |
| 7/1/09 | 14.8 |
| 7/1/09 | 15.2 |
| 7/1/09 | 12.2 |
| 7/1/09 | 12 |
| 7/1/09 | 11.2 |
| 7/1/09 | 12.8 |
| 7/1/09 | 10.4 |
| 7/1/09 | 11.3 |
| 7/1/09 | 10.8 |
| 7/1/09 | 9.6 |
| 7/1/09 | 9 |
| 7/1/09 | 9.3 |
| 6/30/09 | 9.2 |
| 6/30/09 | 9.7 |
| 6/30/09 | 8.1 |
| 6/30/09 | 9.1 |
| 6/30/09 | 9 |
| 6/30/09 | 10.6 |
| 6/30/09 | 10.9 |
| 6/30/09 | 8.5 |
| 6/30/09 | 9.8 |
| 6/30/09 | 8 |
| 6/30/09 | 8.9 |
| 6/30/09 | 8.9 |
| 6/30/09 | 9.6 |
| 6/30/09 | 8.7 |
| 6/30/09 | 9.3 |
| 6/30/09 | 8.6 |
| 6/30/09 | 8.6 |
| 6/30/09 | 9.8 |
| 6/30/09 | 9.4 |
| 6/30/09 | 9.4 |
| 6/30/09 | 10.2 |
| 6/30/09 | 9.2 |
| 6/30/09 | 10.8 |
| 6/30/09 | 11.2 |
| 6/30/09 | 11.4 |
| 6/30/09 | 10.3 |
| 6/30/09 | 10.5 |
| 6/30/09 | 9.6 |
| 6/30/09 | 10 |
| 6/30/09 | 10 |
| 6/30/09 | 9.6 |
| 6/30/09 | 8.2 |
| 6/30/09 | 8.7 |
| 6/30/09 | 8.8 |
| 6/30/09 | 9 |
| 6/30/09 | 9.1 |
| 6/30/09 | 9.8 |
| 6/30/09 | 9.1 |
| 6/30/09 | 7.3 |
| 6/30/09 | 8.7 |
| 6/30/09 | 7.6 |
| 6/30/09 | 7.6 |
| 6/30/09 | 8.9 |
| 6/30/09 | 10.5 |
| 6/30/09 | 9.1 |
| 6/30/09 | 9.1 |
| 6/30/09 | 10.8 |
| 6/30/09 | 7.6 |
| 6/29/09 | 10.5 |
| 6/29/09 | 9.1 |
| 6/29/09 | 10.7 |
| 6/29/09 | 10 |
| 6/29/09 | 10 |
| 6/29/09 | 10.2 |
| 6/29/09 | 10.2 |
| 6/29/09 | 10.1 |
| 6/29/09 | 9.6 |
| 6/29/09 | 11 |
| 6/29/09 | 10.8 |
| 6/29/09 | 10.8 |
| 6/29/09 | 12 |
| 6/29/09 | 13.8 |
| 6/29/09 | 11.4 |
| 6/29/09 | 12 |
| 6/29/09 | 10.7 |
| 6/29/09 | 11.5 |
| 6/29/09 | 12.4 |
| 6/29/09 | 13.7 |
| 6/29/09 | 15.2 |
| 6/29/09 | 13.3 |
| 6/29/09 | 14.3 |
| 6/29/09 | 13.9 |
| 6/29/09 | 14.4 |
| 6/29/09 | 14.6 |
| 6/29/09 | 14.8 |
| 6/29/09 | 13.9 |
| 6/29/09 | 14.1 |
| 6/29/09 | 16.3 |
| 6/29/09 | 16.1 |
| 6/29/09 | 17.1 |
| 6/29/09 | 19.7 |
| 6/29/09 | 17.7 |
| 6/29/09 | 17.1 |
| 6/29/09 | 14.8 |
| 6/29/09 | 12.7 |
| 6/29/09 | 10.3 |
| 6/29/09 | 10.2 |
| 6/29/09 | 8 |
| 6/29/09 | 8.3 |
| 6/29/09 | 8.8 |
| 6/29/09 | 8.3 |
| 6/29/09 | 8.2 |
| 6/29/09 | 7.7 |
| 6/29/09 | 7.7 |
| 6/29/09 | 7.1 |
| 6/29/09 | 7.2 |
| 6/28/09 | 7.5 |
| 6/28/09 | 7 |
| 6/28/09 | 7.3 |
| 6/28/09 | 7.4 |
| 6/28/09 | 7.7 |
| 6/28/09 | 7.2 |
| 6/28/09 | 7.7 |
| 6/28/09 | 8.5 |
| 6/28/09 | 8 |
| 6/28/09 | 7.9 |
| 6/28/09 | 7.9 |
| 6/28/09 | 7.2 |
| 6/28/09 | 7.9 |
| 6/28/09 | 7.8 |
| 6/28/09 | 7.3 |
| 6/28/09 | 7.7 |
| 6/28/09 | 8.3 |
| 6/28/09 | 8.6 |
| 6/28/09 | 9.8 |
| 6/28/09 | 7.8 |
| 6/28/09 | 8.6 |
| 6/28/09 | 11 |
| 6/28/09 | 9.8 |
| 6/28/09 | 9.7 |
| 6/28/09 | 7.9 |
| 6/28/09 | 7.3 |
| 6/28/09 | 7 |
| 6/28/09 | 6.4 |
| 6/28/09 | 7 |
| 6/28/09 | 7.2 |
| 6/28/09 | 7 |
| 6/28/09 | 6.5 |
| 6/28/09 | 7 |
| 6/28/09 | 6.8 |
| 6/28/09 | 6.9 |
| 6/28/09 | 6.8 |
| 6/28/09 | 6.5 |
| 6/28/09 | 6.6 |
| 6/28/09 | 6.3 |
| 6/28/09 | 6.5 |
| 6/28/09 | 6.2 |
| 6/28/09 | 6.4 |
| 6/28/09 | 6.7 |
| 6/28/09 | 6.5 |
| 6/28/09 | 6.2 |
| 6/28/09 | 6.4 |
| 6/28/09 | 6.1 |
| 6/28/09 | 7 |
| 6/27/09 | 5.7 |
| 6/27/09 | 6.9 |
| 6/27/09 | 6.7 |
| 6/27/09 | 8 |
| 6/27/09 | 7.5 |
| 6/27/09 | 7 |
| 6/27/09 | 7.6 |
| 6/27/09 | 8.1 |
| 6/27/09 | 6.2 |
| 6/27/09 | 6.6 |
| 6/27/09 | 6.1 |
| 6/27/09 | 6.6 |
| 6/27/09 | 6.8 |
| 6/27/09 | 7.7 |
| 6/27/09 | 8.8 |
| 6/27/09 | 6.9 |
| 6/27/09 | 7.8 |
| 6/27/09 | 8.4 |
| 6/27/09 | 7.6 |
| 6/27/09 | 9.9 |
| 6/27/09 | 8 |
| 6/27/09 | 9.1 |
| 6/27/09 | 8 |
| 6/27/09 | 8 |
| 6/27/09 | 6.9 |
| 6/27/09 | 7.1 |
| 6/27/09 | 8.8 |
| 6/27/09 | 10.1 |
| 6/27/09 | 7.3 |
| 6/27/09 | 7.9 |
| 6/27/09 | 8.4 |
| 6/27/09 | 7.6 |
| 6/27/09 | 7.9 |
| 6/27/09 | 6.8 |
| 6/27/09 | 7.1 |
| 6/27/09 | 7.1 |
| 6/27/09 | 5.9 |
| 6/27/09 | 6.9 |
| 6/27/09 | 6.3 |
| 6/27/09 | 5.8 |
| 6/27/09 | 5.1 |
| 6/27/09 | 5.4 |
| 6/27/09 | 4.5 |
| 6/27/09 | 5.9 |
| 6/27/09 | 6.1 |
| 6/27/09 | 4.9 |
| 6/27/09 | 5.2 |
| 6/27/09 | 4.7 |
| 6/26/09 | 5.4 |
| 6/26/09 | 5 |
| 6/26/09 | 4.7 |
| 6/26/09 | 4.9 |
| 6/26/09 | 4.9 |
| 6/26/09 | 5.8 |
| 6/26/09 | 5.7 |
| 6/26/09 | 6 |
| 6/26/09 | 7.3 |
| 6/26/09 | 8.4 |
| 6/26/09 | 8.1 |
| 6/26/09 | 6.5 |
| 6/26/09 | 7.1 |
| 6/26/09 | 6.4 |
| 6/26/09 | 6.3 |
| 6/26/09 | 5.4 |
| 6/26/09 | 5.4 |
| 6/26/09 | 5.5 |
| 6/26/09 | 6.4 |
| 6/26/09 | 6.2 |
| 6/26/09 | 5.5 |
| 6/26/09 | 4.7 |
| 6/26/09 | 4.4 |
| 6/26/09 | 4.3 |
| 6/26/09 | 5.4 |
| 6/26/09 | 2.3 |
| 6/26/09 | 3 |
| 6/26/09 | 2.3 |
| 6/26/09 | 2.4 |
| 6/26/09 | 2.5 |
| 6/26/09 | 2.6 |
| 6/26/09 | 2.1 |
| 6/26/09 | 2.7 |
| 6/26/09 | 2.7 |
| 6/26/09 | 2.4 |
| 6/26/09 | 2.4 |
| 6/26/09 | 3.4 |
| 6/26/09 | 2.4 |
| 6/26/09 | 3 |
| 6/26/09 | 3.2 |
| 6/26/09 | 3.2 |
| 6/26/09 | 2.5 |
| 6/26/09 | 2.9 |
| 6/26/09 | 4.3 |
| 6/26/09 | 3.5 |
| 6/26/09 | 1.9 |
| 6/26/09 | 2.3 |
| 6/25/09 | 2.7 |
| 6/25/09 | 3.3 |
| 6/25/09 | 3.8 |
| 6/25/09 | 3.4 |
| 6/25/09 | 3.7 |
| 6/25/09 | 2.9 |
| 6/25/09 | 3.7 |
| 6/25/09 | 3.1 |
| 6/25/09 | 2.4 |
| 6/25/09 | 2.2 |
| 6/25/09 | 2.5 |
| 6/25/09 | 3.5 |
| 6/25/09 | 4 |
| 6/25/09 | 3.2 |
| 6/25/09 | 3.5 |
| 6/25/09 | 4 |
| 6/25/09 | 3.6 |
| 6/25/09 | 3.6 |
| 6/25/09 | 3.2 |
| 6/25/09 | 4.8 |
| 6/25/09 | 3.6 |
| 6/25/09 | 3.3 |
| 6/25/09 | 2.9 |
| 6/25/09 | 3.1 |
| 6/25/09 | 3.5 |
| 6/25/09 | 5 |
| 6/25/09 | 4.1 |
| 6/25/09 | 3.7 |
| 6/25/09 | 2.7 |
| 6/25/09 | 2.5 |
| 6/25/09 | 3.3 |
| 6/25/09 | 3.2 |
| 6/25/09 | 3.2 |
| 6/25/09 | 2.6 |
| 6/25/09 | 3.4 |
| 6/25/09 | 3.7 |
| 6/25/09 | 3.7 |
| 6/25/09 | 2.3 |
| 6/25/09 | 2.5 |
| 6/25/09 | 3.4 |
| 6/25/09 | 3.2 |
| 6/25/09 | 2.6 |
| 6/25/09 | 2.4 |
| 6/25/09 | 3.1 |
| 6/25/09 | 2.6 |
| 6/25/09 | 2.4 |
| 6/25/09 | 2.6 |
| 6/25/09 | 3.2 |
| 6/24/09 | 3.2 |
| 6/24/09 | 2 |
| 6/24/09 | 2.1 |
| 6/24/09 | 2.4 |
| 6/24/09 | 3.4 |
| 6/24/09 | 3.5 |
| 6/24/09 | 3.7 |
| 6/24/09 | 2.8 |
| 6/24/09 | 2.7 |
| 6/24/09 | 2.7 |
| 6/24/09 | 2.6 |
| 6/24/09 | 3.8 |
| 6/24/09 | 4.1 |
| 6/24/09 | 4.3 |
| 6/24/09 | 4.4 |
| 6/24/09 | 3.8 |
| 6/24/09 | 4.4 |
| 6/24/09 | 3.8 |
| 6/24/09 | 4.9 |
| 6/24/09 | 4.4 |
| 6/24/09 | 4.3 |
| 6/24/09 | 2.9 |
| 6/24/09 | 3.7 |
| 6/24/09 | 3.7 |
| 6/24/09 | 3.6 |
| 6/24/09 | 3.1 |
| 6/24/09 | 3.7 |
| 6/24/09 | 3 |
| 6/24/09 | 3.1 |
| 6/24/09 | 2.9 |
| 6/24/09 | 3.6 |
| 6/24/09 | 3 |
| 6/24/09 | 3.7 |
| 6/24/09 | 3.6 |
| 6/24/09 | 3.5 |
| 6/24/09 | 3.8 |
| 6/24/09 | 3.2 |
| 6/24/09 | 2.6 |
| 6/24/09 | 3.3 |
| 6/24/09 | 3.4 |
| 6/24/09 | 3.1 |
| 6/24/09 | 3.4 |
| 6/24/09 | 3.1 |
| 6/24/09 | 3.2 |
| 6/24/09 | 3.8 |
| 6/24/09 | 3.6 |
| 6/24/09 | 3.5 |
| 6/24/09 | 3.8 |
| 6/23/09 | 3.8 |
| 6/23/09 | 3.7 |
| 6/23/09 | 2.8 |
| 6/23/09 | 4.4 |
| 6/23/09 | 4.1 |
| 6/23/09 | 3.9 |
| 6/23/09 | 3.6 |
| 6/23/09 | 3.1 |
| 6/23/09 | 3.3 |
| 6/23/09 | 3.4 |
| 6/23/09 | 3.9 |
| 6/23/09 | 4.6 |
| 6/23/09 | 4.3 |
| 6/23/09 | 5 |
| 6/23/09 | 5.1 |
| 6/23/09 | 3.6 |
| 6/23/09 | 4.2 |
| 6/23/09 | 5.6 |
| 6/23/09 | 4.5 |
| 6/23/09 | 3.7 |
| 6/23/09 | 4.2 |
| 6/23/09 | 3.7 |
| 6/23/09 | 4.5 |
| 6/23/09 | 4.3 |
| 6/23/09 | 4.3 |
| 6/23/09 | 4.4 |
| 6/23/09 | 4.7 |
| 6/23/09 | 5.5 |
| 6/23/09 | 4.6 |
| 6/23/09 | 3.9 |
| 6/23/09 | 3.6 |
| 6/23/09 | 5.8 |
| 6/23/09 | 3.4 |
| 6/23/09 | 3.6 |
| 6/23/09 | 3.5 |
| 6/23/09 | 4.2 |
| 6/23/09 | 3.9 |
| 6/23/09 | 3.2 |
| 6/23/09 | 3.5 |
| 6/23/09 | 3.9 |
| 6/23/09 | 3.9 |
| 6/23/09 | 4.1 |
| 6/23/09 | 3.9 |
| 6/23/09 | 3.3 |
| 6/23/09 | 3.2 |
| 6/23/09 | 3.6 |
| 6/23/09 | 4.5 |
| 6/23/09 | 3.6 |
| 6/22/09 | 3.7 |
| 6/22/09 | 4.1 |
| 6/22/09 | 4.3 |
| 6/22/09 | 5.3 |
| 6/22/09 | 4.5 |
| 6/22/09 | 4.8 |
| 6/22/09 | 4.7 |
| 6/22/09 | 4.6 |
| 6/22/09 | 5.4 |
| 6/22/09 | 4.3 |
| 6/22/09 | 3.1 |
| 6/22/09 | 6.5 |
| 6/22/09 | 4.7 |
| 6/22/09 | 5.1 |
| 6/22/09 | 5.7 |
| 6/22/09 | 6.5 |
| 6/22/09 | 6.4 |
| 6/22/09 | 6.9 |
| 6/22/09 | 7 |
| 6/22/09 | 7.6 |
| 6/22/09 | 6 |
| 6/22/09 | 6.9 |
| 6/22/09 | 5.4 |
| 6/22/09 | 6 |
| 6/22/09 | 7.2 |
| 6/22/09 | 6.7 |
| 6/22/09 | 7.3 |
| 6/22/09 | 5.5 |
| 6/22/09 | 5.5 |
| 6/22/09 | 4.9 |
| 6/22/09 | 5.1 |
| 6/22/09 | 5.1 |
| 6/22/09 | 4.3 |
| 6/22/09 | 4.7 |
| 6/22/09 | 4.4 |
| 6/22/09 | 4.3 |
| 6/22/09 | 4.7 |
| 6/22/09 | 4.5 |
| 6/22/09 | 3.5 |
| 6/22/09 | 4.7 |
| 6/22/09 | 4.2 |
| 6/22/09 | 3.4 |
| 6/22/09 | 4.3 |
| 6/22/09 | 4.7 |
| 6/22/09 | 4.8 |
| 6/22/09 | 4.9 |
| 6/22/09 | 5.3 |
| 6/22/09 | 4.2 |
| 6/21/09 | 4.5 |
| 6/21/09 | 3.7 |
| 6/21/09 | 4.8 |
| 6/21/09 | 4.3 |
| 6/21/09 | 4.3 |
| 6/21/09 | 5.3 |
| 6/21/09 | 4 |
| 6/21/09 | 6 |
| 6/21/09 | 5.8 |
| 6/21/09 | 7.2 |
| 6/21/09 | 7 |
| 6/21/09 | 7.2 |
| 6/21/09 | 6.6 |
| 6/21/09 | 7.2 |
| 6/21/09 | 7.9 |
| 6/21/09 | 6.7 |
| 6/21/09 | 6.7 |
| 6/21/09 | 6.6 |
| 6/21/09 | 7.4 |
| 6/21/09 | 6.3 |
| 6/21/09 | 5.7 |
| 6/21/09 | 6 |
| 6/21/09 | 6 |
| 6/21/09 | 5.9 |
| 6/21/09 | 6.6 |
| 6/21/09 | 8 |
| 6/21/09 | 6.5 |
| 6/21/09 | 6.2 |
| 6/21/09 | 5.4 |
| 6/21/09 | 5.5 |
| 6/21/09 | 5.4 |
| 6/21/09 | 6.1 |
| 6/21/09 | 4.5 |
| 6/21/09 | 5.1 |
| 6/21/09 | 4.8 |
| 6/21/09 | 4.8 |
| 6/21/09 | 5.4 |
| 6/21/09 | 4.3 |
| 6/21/09 | 4.5 |
| 6/21/09 | 6.3 |
| 6/21/09 | 4.5 |
| 6/21/09 | 4.8 |
| 6/21/09 | 4.4 |
| 6/21/09 | 4.5 |
| 6/21/09 | 4.1 |
| 6/21/09 | 4.1 |
| 6/21/09 | 5.8 |
| 6/21/09 | 5 |
| 6/20/09 | 4.6 |
| 6/20/09 | 4.5 |
| 6/20/09 | 5.2 |
| 6/20/09 | 4.8 |
| 6/20/09 | 4.7 |
| 6/20/09 | 5.6 |
| 6/20/09 | 5.7 |
| 6/20/09 | 7.6 |
| 6/20/09 | 7 |
| 6/20/09 | 10.3 |
| 6/20/09 | 11.6 |
| 6/20/09 | 10.9 |
| 6/20/09 | 10 |
| 6/20/09 | 10.4 |
| 6/20/09 | 9 |
| 6/20/09 | 8.3 |
| 6/20/09 | 10.9 |
| 6/20/09 | 9.6 |
| 6/20/09 | 8.6 |
| 6/20/09 | 7.8 |
| 6/20/09 | 6.9 |
| 6/20/09 | 7.1 |
| 6/20/09 | 6.6 |
| 6/20/09 | 7.7 |
| 6/20/09 | 7 |
| 6/20/09 | 6.3 |
| 6/20/09 | 5.5 |
| 6/20/09 | 6.7 |
| 6/20/09 | 5.5 |
| 6/20/09 | 5.9 |
| 6/20/09 | 3.6 |
| 6/20/09 | 4 |
| 6/20/09 | 5.3 |
| 6/20/09 | 6.5 |
| 6/20/09 | 6.2 |
| 6/20/09 | 7.4 |
| 6/20/09 | 6.6 |
| 6/20/09 | 3.8 |
| 6/20/09 | 4 |
| 6/20/09 | 4.1 |
| 6/20/09 | 4.7 |
| 6/20/09 | 4.7 |
| 6/20/09 | 4.9 |
| 6/20/09 | 6.4 |
| 6/20/09 | 5.1 |
| 6/20/09 | 6.6 |
| 6/20/09 | 4.6 |
| 6/20/09 | 3.8 |
| 6/19/09 | 3.9 |
| 6/19/09 | 3.7 |
| 6/19/09 | 4.6 |
| 6/19/09 | 3.4 |
| 6/19/09 | 5.3 |
| 6/19/09 | 7 |
| 6/19/09 | 5.8 |
| 6/19/09 | 7.1 |
| 6/19/09 | 7.3 |
| 6/19/09 | 4.6 |
| 6/19/09 | 5.9 |
| 6/19/09 | 4.9 |
| 6/19/09 | 6.6 |
| 6/19/09 | 6.5 |
| 6/19/09 | 8.1 |
| 6/19/09 | 8 |
| 6/19/09 | 6.3 |
| 6/19/09 | 7.5 |
| 6/19/09 | 6.2 |
| 6/19/09 | 8.5 |
| 6/19/09 | 12.9 |
| 6/19/09 | 11.6 |
| 6/19/09 | 12 |
| 6/19/09 | 14.8 |
| 6/19/09 | 18.4 |
| 6/19/09 | 12.3 |
| 6/19/09 | 12.8 |
| 6/19/09 | 12.4 |
| 6/19/09 | 11.9 |
| 6/19/09 | 12.1 |
| 6/19/09 | 10.6 |
| 6/19/09 | 11.4 |
| 6/19/09 | 9.3 |
| 6/19/09 | 10 |
| 6/19/09 | 11 |
| 6/19/09 | 8.6 |
| 6/19/09 | 10.1 |
| 6/19/09 | 9.4 |
| 6/19/09 | 7.3 |
| 6/19/09 | 6.3 |
| 6/19/09 | 5.9 |
| 6/19/09 | 5 |
| 6/19/09 | 4.7 |
| 6/19/09 | 4.9 |
| 6/19/09 | 4.8 |
| 6/19/09 | 6.2 |
| 6/19/09 | 5.7 |
| 6/19/09 | 4.7 |
| 6/18/09 | 5.7 |
| 6/18/09 | 5.6 |
| 6/18/09 | 6.7 |
| 6/18/09 | 6.8 |
| 6/18/09 | 6.3 |
| 6/18/09 | 5.8 |
| 6/18/09 | 7.5 |
| 6/18/09 | 6.7 |
| 6/18/09 | 7.5 |
| 6/18/09 | 8.5 |
| 6/18/09 | 10.3 |
| 6/18/09 | 7.2 |
| 6/18/09 | 8.5 |
| 6/18/09 | 9.8 |
| 6/18/09 | 7.9 |
| 6/18/09 | 9.2 |
| 6/18/09 | 9.2 |
| 6/18/09 | 8.8 |
| 6/18/09 | 8.3 |
| 6/18/09 | 8.2 |
| 6/18/09 | 8.6 |
| 6/18/09 | 9 |
| 6/18/09 | 8.8 |
| 6/18/09 | 10.4 |
| 6/18/09 | 10.3 |
| 6/18/09 | 9.2 |
| 6/18/09 | 9.1 |
| 6/18/09 | 9.9 |
| 6/18/09 | 8.2 |
| 6/18/09 | 8.6 |
| 6/18/09 | 9.3 |
| 6/18/09 | 8.5 |
| 6/18/09 | 8.6 |
| 6/18/09 | 9 |
| 6/18/09 | 8.6 |
| 6/18/09 | 10.2 |
| 6/18/09 | 10.4 |
| 6/18/09 | 9.9 |
| 6/18/09 | 8.8 |
| 6/18/09 | 8.9 |
| 6/18/09 | 7 |
| 6/18/09 | 7.8 |
| 6/18/09 | 6.1 |
| 6/18/09 | 7.7 |
| 6/18/09 | 8.7 |
| 6/18/09 | 7.3 |
| 6/18/09 | 6.7 |
| 6/18/09 | 6.4 |
| 6/17/09 | 5.5 |
| 6/17/09 | 5.8 |
| 6/17/09 | 6 |
| 6/17/09 | 5.8 |
| 6/17/09 | 7.3 |
| 6/17/09 | 5.7 |
| 6/17/09 | 6.1 |
| 6/17/09 | 6.1 |
| 6/17/09 | 7 |
| 6/17/09 | 6.1 |
| 6/17/09 | 6.5 |
| 6/17/09 | 6.2 |
| 6/17/09 | 6.7 |
| 6/17/09 | 6.5 |
| 6/17/09 | 7.8 |
| 6/17/09 | 6.5 |
| 6/17/09 | 9.1 |
| 6/17/09 | 8.1 |
| 6/17/09 | 8 |
| 6/17/09 | 7.8 |
| 6/17/09 | 7.5 |
| 6/17/09 | 7.1 |
| 6/17/09 | 7.6 |
| 6/17/09 | 9.5 |
| 6/17/09 | 9.9 |
| 6/17/09 | 15.6 |
| 6/17/09 | 7.2 |
| 6/17/09 | 7.6 |
| 6/17/09 | 7 |
| 6/17/09 | 6.3 |
| 6/17/09 | 6.1 |
| 6/17/09 | 5 |
| 6/17/09 | 5.3 |
| 6/17/09 | 4.9 |
| 6/17/09 | 4.5 |
| 6/17/09 | 4 |
| 6/17/09 | 4.6 |
| 6/17/09 | 3.6 |
| 6/17/09 | 3.5 |
| 6/17/09 | 3.7 |
| 6/17/09 | 2.8 |
| 6/17/09 | 3.2 |
| 6/17/09 | 3.1 |
| 6/17/09 | 2.6 |
| 6/17/09 | 2.5 |
| 6/17/09 | 3 |
| 6/17/09 | 2.7 |
| 6/17/09 | 3 |
| 6/16/09 | 3.6 |
| 6/16/09 | 3.4 |
| 6/16/09 | 3.2 |
| 6/16/09 | 3.4 |
| 6/16/09 | 3.7 |
| 6/16/09 | 3.9 |
| 6/16/09 | 4.3 |
| 6/16/09 | 4.4 |
| 6/16/09 | 4.3 |
| 6/16/09 | 4.1 |
| 6/16/09 | 4.1 |
| 6/16/09 | 4 |
| 6/16/09 | 5 |
| 6/16/09 | 4.1 |
| 6/16/09 | 4.2 |
| 6/16/09 | 4.2 |
| 6/16/09 | 4.3 |
| 6/16/09 | 4.7 |
| 6/16/09 | 4.4 |
| 6/16/09 | 5.2 |
| 6/16/09 | 4.7 |
| 6/16/09 | 5 |
| 6/16/09 | 4.2 |
| 6/16/09 | 4.3 |
| 6/16/09 | 3.9 |
| 6/16/09 | 3.7 |
| 6/16/09 | 4.2 |
| 6/16/09 | 4.2 |
| 6/16/09 | 4.5 |
| 6/16/09 | 4.7 |
| 6/16/09 | 4 |
| 6/16/09 | 3.3 |
| 6/16/09 | 3.4 |
| 6/16/09 | 3.4 |
| 6/16/09 | 3.5 |
| 6/16/09 | 2.7 |
| 6/16/09 | 2.4 |
| 6/16/09 | 2.6 |
| 6/16/09 | 2.4 |
| 6/16/09 | 2.5 |
| 6/16/09 | 2.4 |
| 6/16/09 | 2 |
| 6/16/09 | 2.1 |
| 6/16/09 | 2.1 |
| 6/16/09 | 2.4 |
| 6/16/09 | 1.9 |
| 6/16/09 | 2.1 |
| 6/16/09 | 2.2 |
| 6/15/09 | 2.9 |
| 6/15/09 | 2 |
| 6/15/09 | 2.7 |
| 6/15/09 | 2.3 |
| 6/15/09 | 2.8 |
| 6/15/09 | 2 |
| 6/15/09 | 1.4 |
| 6/15/09 | 2.1 |
| 6/15/09 | 1.8 |
| 6/15/09 | 1.4 |
| 6/15/09 | 2.4 |
| 6/15/09 | 3.1 |
| 6/15/09 | 2.6 |
| 6/15/09 | 2.1 |
| 6/15/09 | 3 |
| 6/15/09 | 1.8 |
| 6/15/09 | 2.5 |
| 6/15/09 | 2.7 |
| 6/15/09 | 3.7 |
| 6/15/09 | 4.1 |
| 6/15/09 | 3 |
| 6/15/09 | 4.8 |
| 6/15/09 | 3.7 |
| 6/15/09 | 4.2 |
| 6/15/09 | 4 |
| 6/15/09 | 4.6 |
| 6/15/09 | 3.8 |
| 6/15/09 | 2.2 |
| 6/15/09 | 2.7 |
| 6/15/09 | 2.1 |
| 6/15/09 | 4.1 |
| 6/15/09 | 3.6 |
| 6/15/09 | 3.2 |
| 6/15/09 | 3.2 |
| 6/15/09 | 3.9 |
| 6/15/09 | 3.1 |
| 6/15/09 | 3.1 |
| 6/15/09 | 3.6 |
| 6/15/09 | 2.7 |
| 6/15/09 | 2.8 |
| 6/15/09 | 2.8 |
| 6/15/09 | 2.5 |
| 6/15/09 | 2.6 |
| 6/15/09 | 4 |
| 6/15/09 | 3.3 |
| 6/15/09 | 3.2 |
| 6/15/09 | 2.7 |
| 6/15/09 | 3 |
| 6/14/09 | 3.4 |
| 6/14/09 | 3.5 |
| 6/14/09 | 4.5 |
| 6/14/09 | 3.7 |
| 6/14/09 | 3.5 |
| 6/14/09 | 2.6 |
| 6/14/09 | 2.2 |
| 6/14/09 | 2.4 |
| 6/14/09 | 2 |
| 6/14/09 | 2.7 |
| 6/14/09 | 2.8 |
| 6/14/09 | 4.8 |
| 6/14/09 | 3.8 |
| 6/14/09 | 4.3 |
| 6/14/09 | 4.9 |
| 6/14/09 | 5.8 |
| 6/14/09 | 3.3 |
| 6/14/09 | 3.5 |
| 6/14/09 | 3.9 |
| 6/14/09 | 4.1 |
| 6/14/09 | 3.9 |
| 6/14/09 | 5.1 |
| 6/14/09 | 5.1 |
| 6/14/09 | 6.2 |
| 6/14/09 | 9.2 |
| 6/14/09 | 5.9 |
| 6/14/09 | 5.5 |
| 6/14/09 | 8.7 |
| 6/14/09 | 7 |
| 6/14/09 | 8.8 |
| 6/14/09 | 9 |
| 6/14/09 | 8.1 |
| 6/14/09 | 6.4 |
| 6/14/09 | 6.2 |
| 6/14/09 | 5.7 |
| 6/14/09 | 4.4 |
| 6/14/09 | 4.9 |
| 6/14/09 | 4.7 |
| 6/14/09 | 3.7 |
| 6/14/09 | 3.3 |
| 6/14/09 | 3.9 |
| 6/14/09 | 2.8 |
| 6/14/09 | 2.5 |
| 6/14/09 | 2.3 |
| 6/14/09 | 3.1 |
| 6/14/09 | 3 |
| 6/14/09 | 2.5 |
| 6/14/09 | 2.5 |
| 6/13/09 | 2.4 |
| 6/13/09 | 3.3 |
| 6/13/09 | 3.4 |
| 6/13/09 | 3.1 |
| 6/13/09 | 3.3 |
| 6/13/09 | 2 |
| 6/13/09 | 1.7 |
| 6/13/09 | 2 |
| 6/13/09 | 3.1 |
| 6/13/09 | 3.2 |
| 6/13/09 | 2.6 |
| 6/13/09 | 3.3 |
| 6/13/09 | 5.5 |
| 6/13/09 | 1.7 |
| 6/13/09 | 2 |
| 6/13/09 | 2.5 |
| 6/13/09 | 3.8 |
| 6/13/09 | 4.4 |
| 6/13/09 | 2.4 |
| 6/13/09 | 4.1 |
| 6/13/09 | 4 |
| 6/13/09 | 3.7 |
| 6/13/09 | 3.8 |
| 6/13/09 | 3.4 |
| 6/13/09 | 4.9 |
| 6/13/09 | 9.9 |
| 6/13/09 | 4.4 |
| 6/13/09 | 4.7 |
| 6/13/09 | 4.9 |
| 6/13/09 | 3.8 |
| 6/13/09 | 3.7 |
| 6/13/09 | 4.3 |
| 6/13/09 | 3.8 |
| 6/13/09 | 5.2 |
| 6/13/09 | 3.6 |
| 6/13/09 | 3.9 |
| 6/13/09 | 3.2 |
| 6/13/09 | 2.4 |
| 6/13/09 | 3.5 |
| 6/13/09 | 2.4 |
| 6/13/09 | 3 |
| 6/13/09 | 2.4 |
| 6/13/09 | 2.5 |
| 6/13/09 | 3 |
| 6/13/09 | 2.8 |
| 6/13/09 | 2.5 |
| 6/13/09 | 2 |
| 6/13/09 | 2 |
| 6/12/09 | 2.5 |
| 6/12/09 | 2 |
| 6/12/09 | 1.3 |
| 6/12/09 | 2.3 |
| 6/12/09 | 1.6 |
| 6/12/09 | 1.8 |
| 6/12/09 | 1.8 |
| 6/12/09 | 1.4 |
| 6/12/09 | 1.4 |
| 6/12/09 | 1.7 |
| 6/12/09 | 1.9 |
| 6/12/09 | 2.8 |
| 6/12/09 | 2.6 |
| 6/12/09 | 2 |
| 6/12/09 | 2.2 |
| 6/12/09 | 2 |
| 6/12/09 | 2 |
| 6/12/09 | 1.5 |
| 6/12/09 | 1.8 |
| 6/12/09 | 1.5 |
| 6/12/09 | 1.6 |
| 6/12/09 | 1.9 |
| 6/12/09 | 2.5 |
| 6/12/09 | 2.3 |
| 6/12/09 | 1.9 |
| 6/12/09 | 2.1 |
| 6/12/09 | 2.6 |
| 6/12/09 | 1.9 |
| 6/12/09 | 1.5 |
| 6/12/09 | 1.6 |
| 6/12/09 | 1.3 |
| 6/12/09 | 1.6 |
| 6/12/09 | 1.8 |
| 6/12/09 | 1.4 |
| 6/12/09 | 1.2 |
| 6/12/09 | 1.4 |
| 6/12/09 | 1.4 |
| 6/12/09 | 1.1 |
| 6/12/09 | 1.2 |
| 6/12/09 | 1.4 |
| 6/12/09 | 1.3 |
| 6/12/09 | 1.1 |
| 6/12/09 | 1.4 |
| 6/12/09 | 1.1 |
| 6/12/09 | 1.1 |
| 6/12/09 | 1.4 |
| 6/12/09 | 1 |
| 6/12/09 | 1 |
| 6/11/09 | 1.4 |
| 6/11/09 | 1.2 |
| 6/11/09 | 1.3 |
| 6/11/09 | 1.6 |
| 6/11/09 | 1.3 |
| 6/11/09 | 1.3 |
| 6/11/09 | 1.3 |
| 6/11/09 | 1 |
| 6/11/09 | 1.3 |
| 6/11/09 | 1.3 |
| 6/11/09 | 2.2 |
| 6/11/09 | 1.4 |
| 6/11/09 | 1.4 |
| 6/11/09 | 1.4 |
| 6/11/09 | 2.6 |
| 6/11/09 | 1.8 |
| 6/11/09 | 1.5 |
| 6/11/09 | 1.8 |
| 6/11/09 | 2.1 |
| 6/11/09 | 1.6 |
| 6/11/09 | 1.3 |
| 6/11/09 | 1.9 |
| 6/11/09 | 1.8 |
| 6/11/09 | 1.7 |
| 6/11/09 | 1.8 |
| 6/11/09 | 1.5 |
| 6/11/09 | 1.3 |
| 6/11/09 | 1.5 |
| 6/11/09 | 1.7 |
| 6/11/09 | 1.6 |
| 6/11/09 | 1.5 |
| 6/11/09 | 1.6 |
| 6/11/09 | 2 |
| 6/11/09 | 1.6 |
| 6/11/09 | 1.7 |
| 6/11/09 | 2 |
| 6/11/09 | 2.2 |
| 6/11/09 | 1.6 |
| 6/11/09 | 1.6 |
| 6/11/09 | 1.4 |
| 6/11/09 | 1.6 |
| 6/11/09 | 1.6 |
| 6/11/09 | 1.5 |
| 6/11/09 | 1.9 |
| 6/11/09 | 1.6 |
| 6/11/09 | 1.2 |
| 6/11/09 | 1.1 |
| 6/11/09 | 1.8 |
| 6/10/09 | 1.2 |
| 6/10/09 | 1.2 |
| 6/10/09 | 1.1 |
| 6/10/09 | 1.3 |
| 6/10/09 | 1.3 |
| 6/10/09 | 1.5 |
| 6/10/09 | 1.5 |
| 6/10/09 | 1.3 |
| 6/10/09 | 1.6 |
| 6/10/09 | 2 |
| 6/10/09 | 1.9 |
| 6/10/09 | 1.9 |
| 6/10/09 | 1.6 |
| 6/10/09 | 2.2 |
| 6/10/09 | 2.2 |
| 6/10/09 | 2 |
| 6/10/09 | 2.4 |
| 6/10/09 | 1.9 |
| 6/10/09 | 1.5 |
| 6/10/09 | 1.6 |
| 6/10/09 | 1.1 |
| 6/10/09 | 1.1 |
| 6/10/09 | 1.3 |
| 6/10/09 | 1.5 |
| 6/10/09 | 2.9 |
| 6/10/09 | 2.4 |
| 6/10/09 | 2 |
| 6/10/09 | 1.8 |
| 6/10/09 | 1.4 |
| 6/10/09 | 1.5 |
| 6/10/09 | 1.7 |
| 6/10/09 | 1.9 |
| 6/10/09 | 1.8 |
| 6/10/09 | 1.7 |
| 6/10/09 | 1.9 |
| 6/10/09 | 1.6 |
| 6/10/09 | 1.8 |
| 6/10/09 | 2.1 |
| 6/10/09 | 1.6 |
| 6/10/09 | 1.8 |
| 6/10/09 | 1.8 |
| 6/10/09 | 1.8 |
| 6/10/09 | 1.6 |
| 6/10/09 | 1.8 |
| 6/10/09 | 2.1 |
| 6/10/09 | 2 |
| 6/10/09 | 1.9 |
| 6/10/09 | 1.9 |
| 6/9/09 | 1.9 |
| 6/9/09 | 1.9 |
| 6/9/09 | 1.9 |
| 6/9/09 | 2.2 |
| 6/9/09 | 2.3 |
| 6/9/09 | 2 |
| 6/9/09 | 2.2 |
| 6/9/09 | 2.7 |
| 6/9/09 | 2.1 |
| 6/9/09 | 2.2 |
| 6/9/09 | 3.1 |
| 6/9/09 | 3.3 |
| 6/9/09 | 3.2 |
| 6/9/09 | 3.1 |
| 6/9/09 | 3.6 |
| 6/9/09 | 4 |
| 6/9/09 | 4.8 |
| 6/9/09 | 5.6 |
| 6/9/09 | 5.6 |
| 6/9/09 | 4.7 |
| 6/9/09 | 3.7 |
| 6/9/09 | 3 |
| 6/9/09 | 2.5 |
| 6/9/09 | 2.3 |
| 6/9/09 | 2.2 |
| 6/9/09 | 2.2 |
| 6/9/09 | 2.3 |
| 6/9/09 | 1.8 |
| 6/9/09 | 1.9 |
| 6/9/09 | 2 |
| 6/9/09 | 1.7 |
| 6/9/09 | 2.1 |
| 6/9/09 | 1.7 |
| 6/9/09 | 2 |
| 6/9/09 | 1.7 |
| 6/9/09 | 1.9 |
| 6/9/09 | 1.9 |
| 6/9/09 | 1.8 |
| 6/9/09 | 1.9 |
| 6/9/09 | 2.2 |
| 6/9/09 | 1.7 |
| 6/9/09 | 2.4 |
| 6/9/09 | 2.2 |
| 6/9/09 | 2.4 |
| 6/9/09 | 2.4 |
| 6/9/09 | 2.1 |
| 6/9/09 | 2.1 |
| 6/9/09 | 2 |
| 6/8/09 | 2.2 |
| 6/8/09 | 1.5 |
| 6/8/09 | 1.9 |
| 6/8/09 | 2.1 |
| 6/8/09 | 3 |
| 6/8/09 | 2.1 |
| 6/8/09 | 1.9 |
| 6/8/09 | 2.1 |
| 6/8/09 | 1.7 |
| 6/8/09 | 3.1 |
| 6/8/09 | 2.6 |
| 6/8/09 | 2.8 |
| 6/8/09 | 2.4 |
| 6/8/09 | 2.1 |
| 6/8/09 | 2.4 |
| 6/8/09 | 2.4 |
| 6/8/09 | 2.3 |
| 6/8/09 | 3.7 |
| 6/8/09 | 3.2 |
| 6/8/09 | 2.8 |
| 6/8/09 | 3 |
| 6/8/09 | 3.2 |
| 6/8/09 | 2.9 |
| 6/8/09 | 3 |
| 6/8/09 | 3.9 |
| 6/8/09 | 4 |
| 6/8/09 | 2.7 |
| 6/8/09 | 3.1 |
| 6/8/09 | 3.2 |
| 6/8/09 | 3.5 |
| 6/8/09 | 2.4 |
| 6/8/09 | 2.7 |
| 6/8/09 | 2.4 |
| 6/8/09 | 2.4 |
| 6/8/09 | 2.7 |
| 6/8/09 | 2.9 |
| 6/8/09 | 2.8 |
| 6/8/09 | 2.6 |
| 6/8/09 | 3.2 |
| 6/8/09 | 2.8 |
| 6/8/09 | 3.1 |
| 6/8/09 | 3 |
| 6/8/09 | 2.6 |
| 6/8/09 | 2.6 |
| 6/8/09 | 2.6 |
| 6/8/09 | 2.9 |
| 6/8/09 | 2.8 |
| 6/8/09 | 3.1 |
| 6/7/09 | 3.3 |
| 6/7/09 | 3 |
| 6/7/09 | 2.5 |
| 6/7/09 | 3.1 |
| 6/7/09 | 3.1 |
| 6/7/09 | 2.9 |
| 6/7/09 | 3.5 |
| 6/7/09 | 3.5 |
| 6/7/09 | 4.6 |
| 6/7/09 | 1.9 |
| 6/7/09 | 2.8 |
| 6/7/09 | 3.5 |
| 6/7/09 | 3.6 |
| 6/7/09 | 3 |
| 6/7/09 | 4.8 |
| 6/7/09 | 3.7 |
| 6/7/09 | 3.8 |
| 6/7/09 | 3.5 |
| 6/7/09 | 4 |
| 6/7/09 | 4.1 |
| 6/7/09 | 4.1 |
| 6/7/09 | 4.9 |
| 6/7/09 | 4 |
| 6/7/09 | 3.2 |
| 6/7/09 | 6.3 |
| 6/7/09 | 4.5 |
| 6/7/09 | 5 |
| 6/7/09 | 4 |
| 6/7/09 | 3.6 |
| 6/7/09 | 3.7 |
| 6/7/09 | 3.6 |
| 6/7/09 | 3.6 |
| 6/7/09 | 4 |
| 6/7/09 | 3.8 |
| 6/7/09 | 3.8 |
| 6/7/09 | 4.1 |
| 6/7/09 | 4.2 |
| 6/7/09 | 4.5 |
| 6/7/09 | 4.5 |
| 6/7/09 | 4.1 |
| 6/7/09 | 4.3 |
| 6/7/09 | 4.5 |
| 6/7/09 | 4.8 |
| 6/7/09 | 4.4 |
| 6/7/09 | 3.9 |
| 6/7/09 | 4.1 |
| 6/7/09 | 3.4 |
| 6/7/09 | 4 |
| 6/6/09 | 4.4 |
| 6/6/09 | 3.7 |
| 6/6/09 | 4.7 |
| 6/6/09 | 4.4 |
| 6/6/09 | 3.9 |
| 6/6/09 | 3.1 |
| 6/6/09 | 3.6 |
| 6/6/09 | 3.6 |
| 6/6/09 | 3 |
| 6/6/09 | 3.9 |
| 6/6/09 | 3.9 |
| 6/6/09 | 3.6 |
| 6/6/09 | 5.3 |
| 6/6/09 | 4.1 |
| 6/6/09 | 6.7 |
| 6/6/09 | 6.3 |
| 6/6/09 | 6.8 |
| 6/6/09 | 6 |
| 6/6/09 | 7 |
| 6/6/09 | 7.1 |
| 6/6/09 | 6.8 |
| 6/6/09 | 6.5 |
| 6/6/09 | 7.7 |
| 6/6/09 | 6.1 |
| 6/6/09 | 5.9 |
| 6/6/09 | 6.8 |
| 6/6/09 | 6.5 |
| 6/6/09 | 6.4 |
| 6/6/09 | 9.5 |
| 6/6/09 | 11.3 |
| 6/6/09 | 11.9 |
| 6/6/09 | 11.2 |
| 6/6/09 | 10.7 |
| 6/6/09 | 11.3 |
| 6/6/09 | 10.2 |
| 6/6/09 | 10.5 |
| 6/6/09 | 10.9 |
| 6/6/09 | 10.7 |
| 6/6/09 | 9.6 |
| 6/6/09 | 9.6 |
| 6/6/09 | 9.1 |
| 6/6/09 | 9.4 |
| 6/6/09 | 9.1 |
| 6/6/09 | 9.8 |
| 6/6/09 | 9.4 |
| 6/6/09 | 8.2 |
| 6/6/09 | 8.4 |
| 6/6/09 | 8 |
| 6/5/09 | 8.8 |
| 6/5/09 | 9.3 |
| 6/5/09 | 7.9 |
| 6/5/09 | 8.8 |
| 6/5/09 | 8.1 |
| 6/5/09 | 7.6 |
| 6/5/09 | 7.8 |
| 6/5/09 | 6.9 |
| 6/5/09 | 6.9 |
| 6/5/09 | 6.8 |
| 6/5/09 | 7.2 |
| 6/5/09 | 7.8 |
| 6/5/09 | 7.8 |
| 6/5/09 | 6.8 |
| 6/5/09 | 7.1 |
| 6/5/09 | 8.6 |
| 6/5/09 | 8.1 |
| 6/5/09 | 8.9 |
| 6/5/09 | 8 |
| 6/5/09 | 8.6 |
| 6/5/09 | 9.1 |
| 6/5/09 | 8.1 |
| 6/5/09 | 8.6 |
| 6/5/09 | 8.7 |
| 6/5/09 | 8.5 |
| 6/5/09 | 8.2 |
| 6/5/09 | 8 |
| 6/5/09 | 8.8 |
| 6/5/09 | 9 |
| 6/5/09 | 9 |
| 6/5/09 | 8.4 |
| 6/5/09 | 7.3 |
| 6/5/09 | 6.8 |
| 6/5/09 | 6.4 |
| 6/5/09 | 5.9 |
| 6/5/09 | 5.6 |
| 6/5/09 | 5.5 |
| 6/5/09 | 5.1 |
| 6/5/09 | 5.1 |
| 6/5/09 | 5.1 |
| 6/5/09 | 4.8 |
| 6/5/09 | 5.5 |
| 6/5/09 | 5.1 |
| 6/5/09 | 4.9 |
| 6/5/09 | 5.3 |
| 6/5/09 | 5.9 |
| 6/5/09 | 5.6 |
| 6/5/09 | 5.6 |
| 6/4/09 | 5.5 |
| 6/4/09 | 5.3 |
| 6/4/09 | 6 |
| 6/4/09 | 5.7 |
| 6/4/09 | 6 |
| 6/4/09 | 5.9 |
| 6/4/09 | 6.4 |
| 6/4/09 | 6.3 |
| 6/4/09 | 5.8 |
| 6/4/09 | 6.4 |
| 6/4/09 | 6.2 |
| 6/4/09 | 6.7 |
| 6/4/09 | 6.6 |
| 6/4/09 | 7.1 |
| 6/4/09 | 6.5 |
| 6/4/09 | 7.4 |
| 6/4/09 | 6.8 |
| 6/4/09 | 7.4 |
| 6/4/09 | 7.6 |
| 6/4/09 | 7.3 |
| 6/4/09 | 7.9 |
| 6/4/09 | 7.3 |
| 6/4/09 | 7.6 |
| 6/4/09 | 8.3 |
| 6/4/09 | 6.8 |
| 6/4/09 | 8.5 |
| 6/4/09 | 8.6 |
| 6/4/09 | 10.5 |
| 6/4/09 | 8.9 |
| 6/4/09 | 8.9 |
| 6/4/09 | 8.2 |
| 6/4/09 | 9.1 |
| 6/4/09 | 9.1 |
| 6/4/09 | 10.3 |
| 6/4/09 | 10.3 |
| 6/4/09 | 8.2 |
| 6/4/09 | 8.5 |
| 6/4/09 | 8.9 |
| 6/4/09 | 8.9 |
| 6/4/09 | 8.6 |
| 6/4/09 | 8.4 |
| 6/4/09 | 7.7 |
| 6/4/09 | 8.4 |
| 6/4/09 | 8.2 |
| 6/4/09 | 8.6 |
| 6/4/09 | 8.3 |
| 6/4/09 | 8.9 |
| 6/4/09 | 8.2 |
| 6/3/09 | 8.3 |
| 6/3/09 | 8.6 |
| 6/3/09 | 9.2 |
| 6/3/09 | 9.1 |
| 6/3/09 | 9.8 |
| 6/3/09 | 8.3 |
| 6/3/09 | 6.8 |
| 6/3/09 | 6.6 |
| 6/3/09 | 5.9 |
| 6/3/09 | 6 |
| 6/3/09 | 5.2 |
| 6/3/09 | 5.2 |
| 6/3/09 | 6.1 |
| 6/3/09 | 5.5 |
| 6/3/09 | 4.7 |
| 6/3/09 | 4.3 |
| 6/3/09 | 4.2 |
| 6/3/09 | 4 |
| 6/3/09 | 3.9 |
| 6/3/09 | 4 |
| 6/3/09 | 3.9 |
| 6/3/09 | 3.7 |
| 6/3/09 | 3.7 |
| 6/3/09 | 3.6 |
| 6/3/09 | 4.1 |
| 6/3/09 | 3.6 |
| 6/3/09 | 3.8 |
| 6/3/09 | 3.4 |
| 6/3/09 | 3.3 |
| 6/3/09 | 3.6 |
| 6/3/09 | 3.3 |
| 6/3/09 | 3.5 |
| 6/3/09 | 3.5 |
| 6/3/09 | 3.1 |
| 6/3/09 | 3.1 |
| 6/3/09 | 3.5 |
| 6/3/09 | 3.3 |
| 6/3/09 | 3 |
| 6/3/09 | 3.2 |
| 6/3/09 | 3.5 |
| 6/3/09 | 3.3 |
| 6/3/09 | 3.4 |
| 6/3/09 | 3.3 |
| 6/3/09 | 3.2 |
| 6/3/09 | 3.4 |
| 6/3/09 | 3.1 |
| 6/3/09 | 3 |
| 6/3/09 | 3.1 |
| 6/2/09 | 3.3 |
| 6/2/09 | 2.9 |
| 6/2/09 | 2.6 |
| 6/2/09 | 2.8 |
| 6/2/09 | 2.9 |
| 6/2/09 | 3.4 |
| 6/2/09 | 3.5 |
| 6/2/09 | 3.2 |
| 6/2/09 | 3.8 |
| 6/2/09 | 3.6 |
| 6/2/09 | 3.5 |
| 6/2/09 | 5.5 |
| 6/2/09 | 5.2 |
| 6/2/09 | 5.4 |
| 6/2/09 | 5.5 |
| 6/2/09 | 5.5 |
| 6/2/09 | 4 |
| 6/2/09 | 3.8 |
| 6/2/09 | 4.3 |
| 6/2/09 | 4.1 |
| 6/2/09 | 4.8 |
| 6/2/09 | 4.9 |
| 6/2/09 | 4.3 |
| 6/2/09 | 4.7 |
| 6/2/09 | 4.1 |
| 6/2/09 | 4.3 |
| 6/2/09 | 4.2 |
| 6/2/09 | 3.7 |
| 6/2/09 | 4.3 |
| 6/2/09 | 3.9 |
| 6/2/09 | 3.7 |
| 6/2/09 | 4 |
| 6/2/09 | 4.3 |
| 6/2/09 | 4.2 |
| 6/2/09 | 4.1 |
| 6/2/09 | 4.6 |
| 6/2/09 | 4.3 |
| 6/2/09 | 4.5 |
| 6/2/09 | 4.5 |
| 6/2/09 | 4.4 |
| 6/2/09 | 4.5 |
| 6/2/09 | 4.5 |
| 6/2/09 | 4.5 |
| 6/2/09 | 3.9 |
| 6/2/09 | 4.7 |
| 6/2/09 | 5 |
| 6/2/09 | 3.9 |
| 6/2/09 | 3.6 |
| 6/1/09 | 3.2 |
| 6/1/09 | 3.1 |
| 6/1/09 | 3 |
| 6/1/09 | 4.1 |
| 6/1/09 | 2.6 |
| 6/1/09 | 2.8 |
| 6/1/09 | 3.8 |
| 6/1/09 | 3.3 |
| 6/1/09 | 3.3 |
| 6/1/09 | 3.9 |
| 6/1/09 | 5.5 |
| 6/1/09 | 5.7 |
| 6/1/09 | 6 |
| 6/1/09 | 6.6 |
| 6/1/09 | 5.5 |
| 6/1/09 | 5.4 |
| 6/1/09 | 5.9 |
| 6/1/09 | 6.6 |
| 6/1/09 | 6.6 |
| 6/1/09 | 5.4 |
| 6/1/09 | 5.7 |
| 6/1/09 | 5.8 |
| 6/1/09 | 5.7 |
| 6/1/09 | 6.2 |
| 6/1/09 | 6.5 |
| 6/1/09 | 7.6 |
| 6/1/09 | 9.2 |
| 6/1/09 | 7.9 |
| 6/1/09 | 9.6 |
| 6/1/09 | 7.3 |
| 6/1/09 | 7.2 |
| 6/1/09 | 7.8 |
| 6/1/09 | 8.2 |
| 6/1/09 | 8 |
| 6/1/09 | 7 |
| 6/1/09 | 8.2 |
| 6/1/09 | 8.1 |
| 6/1/09 | 7 |
| 6/1/09 | 7.6 |
| 6/1/09 | 6.6 |
| 6/1/09 | 6.5 |
| 6/1/09 | 7 |
| 6/1/09 | 7.3 |
| 6/1/09 | 7 |
| 6/1/09 | 6.8 |
| 6/1/09 | 6.6 |
| 6/1/09 | 6.6 |
| 6/1/09 | 6 |
| 5/31/09 | 6.6 |
| 5/31/09 | 6.3 |
| 5/31/09 | 5.2 |
| 5/31/09 | 5.9 |
| 5/31/09 | 5.7 |
| 5/31/09 | 5.6 |
| 5/31/09 | 5.3 |
| 5/31/09 | 5.8 |
| 5/31/09 | 5.7 |
| 5/31/09 | 5.8 |
| 5/31/09 | 5.8 |
| 5/31/09 | 6.1 |
| 5/31/09 | 6.2 |
| 5/31/09 | 6.4 |
| 5/31/09 | 5.9 |
| 5/31/09 | 7.9 |
| 5/31/09 | 6.2 |
| 5/31/09 | 6.2 |
| 5/31/09 | 5.5 |
| 5/31/09 | 5.2 |
| 5/31/09 | 5.4 |
| 5/31/09 | 5.4 |
| 5/31/09 | 7.3 |
| 5/31/09 | 6.5 |
| 5/31/09 | 8.3 |
| 5/31/09 | 7.3 |
| 5/31/09 | 5.2 |
| 5/31/09 | 6.7 |
| 5/31/09 | 6.7 |
| 5/31/09 | 6.3 |
| 5/31/09 | 6.4 |
| 5/31/09 | 5.8 |
| 5/31/09 | 6.1 |
| 5/31/09 | 5.3 |
| 5/31/09 | 6 |
| 5/31/09 | 5.4 |
| 5/31/09 | 5.2 |
| 5/31/09 | 5.4 |
| 5/31/09 | 4.8 |
| 5/31/09 | 4.1 |
| 5/31/09 | 4.1 |
| 5/31/09 | 3.8 |
| 5/31/09 | 3.9 |
| 5/31/09 | 3.6 |
| 5/31/09 | 3.4 |
| 5/31/09 | 3.7 |
| 5/31/09 | 3.6 |
| 5/31/09 | 3.4 |
| 5/30/09 | 3.6 |
| 5/30/09 | 3.7 |
| 5/30/09 | 4 |
| 5/30/09 | 3.2 |
| 5/30/09 | 4.1 |
| 5/30/09 | 3.4 |
| 5/30/09 | 3.8 |
| 5/30/09 | 3.8 |
| 5/30/09 | 4.2 |
| 5/30/09 | 4 |
| 5/30/09 | 2.7 |
| 5/30/09 | 3.1 |
| 5/30/09 | 3.7 |
| 5/30/09 | 3.9 |
| 5/30/09 | 4.9 |
| 5/30/09 | 4 |
| 5/30/09 | 4.7 |
| 5/30/09 | 4.5 |
| 5/30/09 | 4.2 |
| 5/30/09 | 4.4 |
| 5/30/09 | 4.3 |
| 5/30/09 | 4.2 |
| 5/30/09 | 3.4 |
| 5/30/09 | 3.7 |
| 5/30/09 | 3.4 |
| 5/30/09 | 3.4 |
| 5/30/09 | 3.4 |
| 5/30/09 | 3.8 |
| 5/30/09 | 3.7 |
| 5/30/09 | 3.3 |
| 5/30/09 | 3.4 |
| 5/30/09 | 3.2 |
| 5/30/09 | 3.2 |
| 5/30/09 | 3.2 |
| 5/30/09 | 2.3 |
| 5/30/09 | 2.2 |
| 5/30/09 | 2.7 |
| 5/30/09 | 2.7 |
| 5/30/09 | 2.6 |
| 5/30/09 | 3 |
| 5/30/09 | 2.7 |
| 5/30/09 | 2.8 |
| 5/30/09 | 2.2 |
| 5/30/09 | 2.2 |
| 5/30/09 | 2.7 |
| 5/30/09 | 2.3 |
| 5/30/09 | 2.4 |
| 5/30/09 | 2.7 |
| 5/29/09 | 3.4 |
| 5/29/09 | 3 |
| 5/29/09 | 2.3 |
| 5/29/09 | 3.2 |
| 5/29/09 | 2.5 |
| 5/29/09 | 2.6 |
| 5/29/09 | 2.4 |
| 5/29/09 | 2.6 |
| 5/29/09 | 2.8 |
| 5/29/09 | 3.3 |
| 5/29/09 | 2 |
| 5/29/09 | 2.9 |
| 5/29/09 | 3.8 |
| 5/29/09 | 2.8 |
| 5/29/09 | 2.8 |
| 5/29/09 | 2.7 |
| 5/29/09 | 2.6 |
| 5/29/09 | 2.9 |
| 5/29/09 | 2.6 |
| 5/29/09 | 2.5 |
| 5/29/09 | 2.4 |
| 5/29/09 | 2.4 |
| 5/29/09 | 1.7 |
| 5/29/09 | 2.3 |
| 5/29/09 | 2.1 |
| 5/29/09 | 2.2 |
| 5/29/09 | 2 |
| 5/29/09 | 1.9 |
| 5/29/09 | 1.9 |
| 5/29/09 | 2 |
| 5/29/09 | 2.1 |
| 5/29/09 | 2.6 |
| 5/29/09 | 2.4 |
| 5/29/09 | 2.4 |
| 5/29/09 | 2.2 |
| 5/29/09 | 2.2 |
| 5/29/09 | 2.8 |
| 5/29/09 | 2.4 |
| 5/29/09 | 1.7 |
| 5/29/09 | 2.7 |
| 5/29/09 | 2.5 |
| 5/29/09 | 2.5 |
| 5/29/09 | 2.2 |
| 5/29/09 | 1.6 |
| 5/29/09 | 1.6 |
| 5/29/09 | 1.7 |
| 5/29/09 | 1.8 |
| 5/29/09 | 1.9 |
| 5/28/09 | 2.3 |
| 5/28/09 | 1.9 |
| 5/28/09 | 2.9 |
| 5/28/09 | 2.2 |
| 5/28/09 | 2.7 |
| 5/28/09 | 3.2 |
| 5/28/09 | 2.2 |
| 5/28/09 | 2.8 |
| 5/28/09 | 2.6 |
| 5/28/09 | 2.7 |
| 5/28/09 | 2.5 |
| 5/28/09 | 2.6 |
| 5/28/09 | 2.5 |
| 5/28/09 | 2.3 |
| 5/28/09 | 2.2 |
| 5/28/09 | 2.5 |
| 5/28/09 | 3.5 |
| 5/28/09 | 4 |
| 5/28/09 | 4.6 |
| 5/28/09 | 4.1 |
| 5/28/09 | 4.2 |
| 5/28/09 | 3.7 |
| 5/28/09 | 3.3 |
| 5/28/09 | 3.6 |
| 5/28/09 | 3.7 |
| 5/28/09 | 4 |
| 5/28/09 | 4.1 |
| 5/28/09 | 3.7 |
| 5/28/09 | 3.5 |
| 5/28/09 | 3.8 |
| 5/28/09 | 3.3 |
| 5/28/09 | 3.5 |
| 5/28/09 | 2.7 |
| 5/28/09 | 3.3 |
| 5/28/09 | 3.1 |
| 5/28/09 | 3.5 |
| 5/28/09 | 2.8 |
| 5/28/09 | 2.9 |
| 5/28/09 | 3.2 |
| 5/28/09 | 2.9 |
| 5/28/09 | 2.3 |
| 5/28/09 | 2.5 |
| 5/28/09 | 3.5 |
| 5/28/09 | 3.2 |
| 5/28/09 | 4 |
| 5/28/09 | 3.3 |
| 5/28/09 | 4.2 |
| 5/28/09 | 4.3 |
| 5/27/09 | 4.5 |
| 5/27/09 | 3.3 |
| 5/27/09 | 4 |
| 5/27/09 | 3.8 |
| 5/27/09 | 4.6 |
| 5/27/09 | 3.4 |
| 5/27/09 | 3.3 |
| 5/27/09 | 5.2 |
| 5/27/09 | 4.6 |
| 5/27/09 | 5 |
| 5/27/09 | 4.1 |
| 5/27/09 | 5.2 |
| 5/27/09 | 6.5 |
| 5/27/09 | 6.1 |
| 5/27/09 | 3.1 |
| 5/27/09 | 3.7 |
| 5/27/09 | 4.8 |
| 5/27/09 | 4.8 |
| 5/27/09 | 4.8 |
| 5/27/09 | 3.8 |
| 5/27/09 | 5.1 |
| 5/27/09 | 5.4 |
| 5/27/09 | 5.1 |
| 5/27/09 | 6.5 |
| 5/27/09 | 5.3 |
| 5/27/09 | 6.9 |
| 5/27/09 | 5.3 |
| 5/27/09 | 5.3 |
| 5/27/09 | 5.3 |
| 5/27/09 | 6 |
| 5/27/09 | 6.9 |
| 5/27/09 | 7.8 |
| 5/27/09 | 8.2 |
| 5/27/09 | 9.2 |
| 5/27/09 | 8.3 |
| 5/27/09 | 8.7 |
| 5/27/09 | 8.5 |
| 5/27/09 | 7.8 |
| 5/27/09 | 7.9 |
| 5/27/09 | 7.4 |
| 5/27/09 | 7.3 |
| 5/27/09 | 7.5 |
| 5/27/09 | 6.4 |
| 5/27/09 | 7.4 |
| 5/27/09 | 7 |
| 5/27/09 | 7.4 |
| 5/27/09 | 8.1 |
| 5/26/09 | 8.2 |
| 5/26/09 | 7.3 |
| 5/26/09 | 7.1 |
| 5/26/09 | 8.8 |
| 5/26/09 | 9.3 |
| 5/26/09 | 7.9 |
| 5/26/09 | 7.8 |
| 5/26/09 | 8.3 |
| 5/26/09 | 8.1 |
| 5/26/09 | 7.8 |
| 5/26/09 | 7.6 |
| 5/26/09 | 8.1 |
| 5/26/09 | 7.6 |
| 5/26/09 | 9.2 |
| 5/26/09 | 7.3 |
| 5/26/09 | 6.3 |
| 5/26/09 | 6.2 |
| 5/26/09 | 6 |
| 5/26/09 | 6 |
| 5/26/09 | 5.9 |
| 5/26/09 | 5.4 |
| 5/26/09 | 4.5 |
| 5/26/09 | 5.2 |
| 5/26/09 | 5.6 |
| 5/26/09 | 4.5 |
| 5/26/09 | 4.7 |
| 5/26/09 | 4.4 |
| 5/26/09 | 4.4 |
| 5/26/09 | 4.2 |
| 5/26/09 | 4.3 |
| 5/26/09 | 4.3 |
| 5/26/09 | 3.8 |
| 5/26/09 | 3.9 |
| 5/26/09 | 3.7 |
| 5/26/09 | 4.1 |
| 5/26/09 | 3.6 |
| 5/26/09 | 3.5 |
| 5/26/09 | 3.9 |
| 5/26/09 | 3.8 |
| 5/26/09 | 4 |
| 5/26/09 | 3.9 |
| 5/26/09 | 4 |
| 5/26/09 | 3.6 |
| 5/26/09 | 3.2 |
| 5/26/09 | 3.2 |
| 5/26/09 | 3.2 |
| 5/26/09 | 2.8 |
| 5/26/09 | 2.4 |
| 5/25/09 | 2.2 |
| 5/25/09 | 3.1 |
| 5/25/09 | 2.8 |
| 5/25/09 | 2.5 |
| 5/25/09 | 2.5 |
| 5/25/09 | 2.6 |
| 5/25/09 | 3 |
| 5/25/09 | 3.4 |
| 5/25/09 | 2.7 |
| 5/25/09 | 2.6 |
| 5/25/09 | 3.6 |
| 5/25/09 | 3.1 |
| 5/25/09 | 2.9 |
| 5/25/09 | 3.2 |
| 5/25/09 | 2.7 |
| 5/25/09 | 3.1 |
| 5/25/09 | 3.1 |
| 5/25/09 | 3.6 |
| 5/25/09 | 3.2 |
| 5/25/09 | 3.2 |
| 5/25/09 | 2.9 |
| 5/25/09 | 2.4 |
| 5/25/09 | 2.6 |
| 5/25/09 | 2.6 |
| 5/25/09 | 2.7 |
| 5/25/09 | 2.7 |
| 5/25/09 | 2.7 |
| 5/25/09 | 2.7 |
| 5/25/09 | 2.4 |
| 5/25/09 | 2.3 |
| 5/25/09 | 2.2 |
| 5/25/09 | 2 |
| 5/25/09 | 2.2 |
| 5/25/09 | 1.9 |
| 5/25/09 | 2.7 |
| 5/25/09 | 2.1 |
| 5/25/09 | 1.7 |
| 5/25/09 | 2.2 |
| 5/25/09 | 2.4 |
| 5/25/09 | 2.2 |
| 5/25/09 | 1.9 |
| 5/25/09 | 1.8 |
| 5/25/09 | 1.7 |
| 5/25/09 | 1.5 |
| 5/25/09 | 1.7 |
| 5/25/09 | 1.7 |
| 5/25/09 | 1.5 |
| 5/25/09 | 1.7 |
| 5/24/09 | 1.6 |
| 5/24/09 | 1.5 |
| 5/24/09 | 2 |
| 5/24/09 | 1.9 |
| 5/24/09 | 1.8 |
| 5/24/09 | 2 |
| 5/24/09 | 2 |
| 5/24/09 | 1.8 |
| 5/24/09 | 2.1 |
| 5/24/09 | 1.6 |
| 5/24/09 | 2.1 |
| 5/24/09 | 2.8 |
| 5/24/09 | 2.3 |
| 5/24/09 | 2.6 |
| 5/24/09 | 3 |
| 5/24/09 | 2.4 |
| 5/24/09 | 2.9 |
| 5/24/09 | 2.6 |
| 5/24/09 | 2.1 |
| 5/24/09 | 3.1 |
| 5/24/09 | 2.6 |
| 5/24/09 | 2.2 |
| 5/24/09 | 2.5 |
| 5/24/09 | 2.4 |
| 5/24/09 | 2.1 |
| 5/24/09 | 2.2 |
| 5/24/09 | 2.6 |
| 5/24/09 | 3.6 |
| 5/24/09 | 2.2 |
| 5/24/09 | 1.9 |
| 5/24/09 | 2.5 |
| 5/24/09 | 2.5 |
| 5/24/09 | 1.9 |
| 5/24/09 | 2 |
| 5/24/09 | 2 |
| 5/24/09 | 2 |
| 5/24/09 | 2 |
| 5/24/09 | 2.7 |
| 5/24/09 | 2 |
| 5/24/09 | 1.9 |
| 5/24/09 | 1.8 |
| 5/24/09 | 1.8 |
| 5/24/09 | 1.8 |
| 5/24/09 | 1.9 |
| 5/24/09 | 1.8 |
| 5/24/09 | 1.3 |
| 5/24/09 | 1.9 |
| 5/24/09 | 1.5 |
| 5/23/09 | 1.5 |
| 5/23/09 | 1.9 |
| 5/23/09 | 2.3 |
| 5/23/09 | 2 |
| 5/23/09 | 2 |
| 5/23/09 | 2 |
| 5/23/09 | 2 |
| 5/23/09 | 2.4 |
| 5/23/09 | 2.2 |
| 5/23/09 | 2 |
| 5/23/09 | 2 |
| 5/23/09 | 2.3 |
| 5/23/09 | 1.6 |
| 5/23/09 | 1.9 |
| 5/23/09 | 3.5 |
| 5/23/09 | 2.7 |
| 5/23/09 | 2.2 |
| 5/23/09 | 2.6 |
| 5/23/09 | 2.6 |
| 5/23/09 | 2.7 |
| 5/23/09 | 2.6 |
| 5/23/09 | 2.6 |
| 5/23/09 | 3.4 |
| 5/23/09 | 3.2 |
| 5/23/09 | 2.1 |
| 5/23/09 | 2.2 |
| 5/23/09 | 2.3 |
| 5/23/09 | 2.3 |
| 5/23/09 | 2.5 |
| 5/23/09 | 2.8 |
| 5/23/09 | 2.5 |
| 5/23/09 | 2.1 |
| 5/23/09 | 2.4 |
| 5/23/09 | 2 |
| 5/23/09 | 2.2 |
| 5/23/09 | 2.5 |
| 5/23/09 | 2 |
| 5/23/09 | 2.1 |
| 5/23/09 | 2.3 |
| 5/23/09 | 2.1 |
| 5/23/09 | 1.7 |
| 5/23/09 | 2 |
| 5/23/09 | 1.9 |
| 5/23/09 | 2.1 |
| 5/23/09 | 1.8 |
| 5/23/09 | 2.1 |
| 5/23/09 | 2 |
| 5/23/09 | 1.7 |
| 5/22/09 | 2 |
| 5/22/09 | 2.5 |
| 5/22/09 | 3.4 |
| 5/22/09 | 1.4 |
| 5/22/09 | 3.9 |
| 5/22/09 | 1.1 |
| 5/22/09 | 1 |
| 5/22/09 | 1.3 |
| 5/22/09 | 1.9 |
| 5/22/09 | 1.7 |
| 5/22/09 | 2.1 |
| 5/22/09 | 2.1 |
| 5/22/09 | 1.7 |
| 5/22/09 | 1.9 |
| 5/22/09 | 2.1 |
| 5/22/09 | 2.1 |
| 5/22/09 | 1.8 |
| 5/22/09 | 2 |
| 5/22/09 | 2.6 |
| 5/22/09 | 2.5 |
| 5/22/09 | 2.2 |
| 5/22/09 | 2.4 |
| 5/22/09 | 2.4 |
| 5/22/09 | 2.6 |
| 5/22/09 | 2.2 |
| 5/22/09 | 2.8 |
| 5/22/09 | 3.5 |
| 5/22/09 | 2.7 |
| 5/22/09 | 3.1 |
| 5/22/09 | 2.5 |
| 5/22/09 | 2.7 |
| 5/22/09 | 2.8 |
| 5/22/09 | 2.5 |
| 5/22/09 | 2.7 |
| 5/22/09 | 2.5 |
| 5/22/09 | 2.5 |
| 5/22/09 | 3 |
| 5/22/09 | 2.5 |
| 5/22/09 | 2.4 |
| 5/22/09 | 2.3 |
| 5/22/09 | 2.6 |
| 5/22/09 | 2.7 |
| 5/22/09 | 2.7 |
| 5/22/09 | 2.8 |
| 5/22/09 | 2 |
| 5/22/09 | 1.7 |
| 5/22/09 | 1.6 |
| 5/22/09 | 1.5 |
| 5/21/09 | 1.8 |
| 5/21/09 | 1.4 |
| 5/21/09 | 1.7 |
| 5/21/09 | 1.7 |
| 5/21/09 | 2.5 |
| 5/21/09 | 2.2 |
| 5/21/09 | 1.8 |
| 5/21/09 | 2.5 |
| 5/21/09 | 2.7 |
| 5/21/09 | 2.8 |
| 5/21/09 | 2.6 |
| 5/21/09 | 2.3 |
| 5/21/09 | 3 |
| 5/21/09 | 1.9 |
| 5/21/09 | 2.4 |
| 5/21/09 | 1.8 |
| 5/21/09 | 2.7 |
| 5/21/09 | 1.9 |
| 5/21/09 | 3.1 |
| 5/21/09 | 2.9 |
| 5/21/09 | 2.9 |
| 5/21/09 | 2.7 |
| 5/21/09 | 3.3 |
| 5/21/09 | 3.3 |
| 5/21/09 | 2.6 |
| 5/21/09 | 2.6 |
| 5/21/09 | 2.9 |
| 5/21/09 | 2.3 |
| 5/21/09 | 3.2 |
| 5/21/09 | 2.5 |
| 5/21/09 | 2.5 |
| 5/21/09 | 2.2 |
| 5/21/09 | 2.7 |
| 5/21/09 | 2.8 |
| 5/21/09 | 2.7 |
| 5/21/09 | 2.8 |
| 5/21/09 | 3 |
| 5/21/09 | 2.5 |
| 5/21/09 | 2.7 |
| 5/21/09 | 2.7 |
| 5/21/09 | 2.6 |
| 5/21/09 | 2.9 |
| 5/21/09 | 2.7 |
| 5/21/09 | 2.9 |
| 5/21/09 | 2.7 |
| 5/21/09 | 2.5 |
| 5/21/09 | 2.4 |
| 5/21/09 | 2 |
| 5/20/09 | 2.1 |
| 5/20/09 | 1.9 |
| 5/20/09 | 1.8 |
| 5/20/09 | 2.2 |
| 5/20/09 | 1.5 |
| 5/20/09 | 1.7 |
| 5/20/09 | 2.3 |
| 5/20/09 | 3 |
| 5/20/09 | 2.5 |
| 5/20/09 | 2.3 |
| 5/20/09 | 2.8 |
| 5/20/09 | 3 |
| 5/20/09 | 2.1 |
| 5/20/09 | 2 |
| 5/20/09 | 2.9 |
| 5/20/09 | 3.5 |
| 5/20/09 | 3.1 |
| 5/20/09 | 3.9 |
| 5/20/09 | 1.9 |
| 5/20/09 | 3 |
| 5/20/09 | 2.3 |
| 5/20/09 | 2.9 |
| 5/20/09 | 3.6 |
| 5/20/09 | 3.3 |
| 5/20/09 | 3.5 |
| 5/20/09 | 3.3 |
| 5/20/09 | 3.2 |
| 5/20/09 | 2.5 |
| 5/20/09 | 3.2 |
| 5/20/09 | 3 |
| 5/20/09 | 4 |
| 5/20/09 | 3.6 |
| 5/20/09 | 3.5 |
| 5/20/09 | 4.1 |
| 5/20/09 | 3.6 |
| 5/20/09 | 4 |
| 5/20/09 | 3.9 |
| 5/20/09 | 3.9 |
| 5/20/09 | 3.9 |
| 5/20/09 | 3.8 |
| 5/20/09 | 4.7 |
| 5/20/09 | 3.5 |
| 5/20/09 | 4 |
| 5/20/09 | 4.1 |
| 5/20/09 | 4.1 |
| 5/20/09 | 4.2 |
| 5/20/09 | 4.6 |
| 5/20/09 | 4.4 |
| 5/19/09 | 4.6 |
| 5/19/09 | 4.5 |
| 5/19/09 | 3.8 |
| 5/19/09 | 3.5 |
| 5/19/09 | 4 |
| 5/19/09 | 3.5 |
| 5/19/09 | 4.7 |
| 5/19/09 | 4 |
| 5/19/09 | 5.4 |
| 5/19/09 | 5.3 |
| 5/19/09 | 6 |
| 5/19/09 | 5.7 |
| 5/19/09 | 4.7 |
| 5/19/09 | 5.3 |
| 5/19/09 | 4.6 |
| 5/19/09 | 5.9 |
| 5/19/09 | 5.6 |
| 5/19/09 | 5.6 |
| 5/19/09 | 6.9 |
| 5/19/09 | 8 |
| 5/19/09 | 6.2 |
| 5/19/09 | 5.7 |
| 5/19/09 | 5.7 |
| 5/19/09 | 6.9 |
| 5/19/09 | 6.5 |
| 5/19/09 | 8.6 |
| 5/19/09 | 7.6 |
| 5/19/09 | 6.5 |
| 5/19/09 | 7.8 |
| 5/19/09 | 9.3 |
| 5/19/09 | 7.9 |
| 5/19/09 | 8 |
| 5/19/09 | 9.3 |
| 5/19/09 | 8.2 |
| 5/19/09 | 7.3 |
| 5/19/09 | 6.3 |
| 5/19/09 | 5.9 |
| 5/19/09 | 5 |
| 5/19/09 | 5.3 |
| 5/19/09 | 4.5 |
| 5/19/09 | 4.6 |
| 5/19/09 | 4.9 |
| 5/19/09 | 4.5 |
| 5/19/09 | 4.2 |
| 5/19/09 | 4.3 |
| 5/19/09 | 4.3 |
| 5/19/09 | 4.5 |
| 5/19/09 | 4.2 |
| 5/18/09 | 4.9 |
| 5/18/09 | 5 |
| 5/18/09 | 5 |
| 5/18/09 | 4.4 |
| 5/18/09 | 4.8 |
| 5/18/09 | 4.7 |
| 5/18/09 | 5.4 |
| 5/18/09 | 4.9 |
| 5/18/09 | 4.5 |
| 5/18/09 | 5.3 |
| 5/18/09 | 6 |
| 5/18/09 | 5.5 |
| 5/18/09 | 5.4 |
| 5/18/09 | 5.7 |
| 5/18/09 | 5.1 |
| 5/18/09 | 5.6 |
| 5/18/09 | 5.4 |
| 5/18/09 | 5.4 |
| 5/18/09 | 5.8 |
| 5/18/09 | 6.4 |
| 5/18/09 | 5.7 |
| 5/18/09 | 6 |
| 5/18/09 | 6.2 |
| 5/18/09 | 6.5 |
| 5/18/09 | 7.4 |
| 5/18/09 | 7.8 |
| 5/18/09 | 7.9 |
| 5/18/09 | 7.8 |
| 5/18/09 | 8.1 |
| 5/18/09 | 7.4 |
| 5/18/09 | 7.3 |
| 5/18/09 | 8 |
| 5/18/09 | 7.1 |
| 5/18/09 | 6.1 |
| 5/18/09 | 8 |
| 5/18/09 | 7.6 |
| 5/18/09 | 6.7 |
| 5/18/09 | 6.7 |
| 5/18/09 | 8.5 |
| 5/18/09 | 8.2 |
| 5/18/09 | 8.5 |
| 5/18/09 | 8.4 |
| 5/18/09 | 7.7 |
| 5/18/09 | 7.3 |
| 5/18/09 | 8.7 |
| 5/18/09 | 7.5 |
| 5/18/09 | 6.6 |
| 5/18/09 | 6.8 |
| 5/17/09 | 5.9 |
| 5/17/09 | 5.3 |
| 5/17/09 | 4.8 |
| 5/17/09 | 5 |
| 5/17/09 | 4.8 |
| 5/17/09 | 4.5 |
| 5/17/09 | 4.5 |
| 5/17/09 | 4.4 |
| 5/17/09 | 4.5 |
| 5/17/09 | 4.4 |
| 5/17/09 | 4.8 |
| 5/17/09 | 4.4 |
| 5/17/09 | 4.4 |
| 5/17/09 | 4.5 |
| 5/17/09 | 4.2 |
| 5/17/09 | 3.9 |
| 5/17/09 | 4.1 |
| 5/17/09 | 3.9 |
| 5/17/09 | 4.5 |
| 5/17/09 | 4.1 |
| 5/17/09 | 3.6 |
| 5/17/09 | 3.7 |
| 5/17/09 | 4.2 |
| 5/17/09 | 3.6 |
| 5/17/09 | 3.7 |
| 5/17/09 | 3.8 |
| 5/17/09 | 3.6 |
| 5/17/09 | 3.3 |
| 5/17/09 | 3.5 |
| 5/17/09 | 3 |
| 5/17/09 | 3 |
| 5/17/09 | 3.1 |
| 5/17/09 | 3.1 |
| 5/17/09 | 2.5 |
| 5/17/09 | 3 |
| 5/17/09 | 2.8 |
| 5/17/09 | 3.2 |
| 5/17/09 | 2.7 |
| 5/17/09 | 3.5 |
| 5/17/09 | 2.9 |
| 5/17/09 | 2.8 |
| 5/17/09 | 2.6 |
| 5/17/09 | 2.5 |
| 5/17/09 | 2.7 |
| 5/17/09 | 2.7 |
| 5/17/09 | 2.7 |
| 5/17/09 | 3.3 |
| 5/17/09 | 2.7 |
| 5/16/09 | 2.8 |
| 5/16/09 | 3 |
| 5/16/09 | 3.4 |
| 5/16/09 | 3.3 |
| 5/16/09 | 3.7 |
| 5/16/09 | 2.9 |
| 5/16/09 | 2.9 |
| 5/16/09 | 5.3 |
| 5/16/09 | 4.6 |
| 5/16/09 | 3.7 |
| 5/16/09 | 4.4 |
| 5/16/09 | 3.9 |
| 5/16/09 | 4.1 |
| 5/16/09 | 3 |
| 5/16/09 | 4.7 |
| 5/16/09 | 5.3 |
| 5/16/09 | 5.2 |
| 5/16/09 | 5.5 |
| 5/16/09 | 4.7 |
| 5/16/09 | 5.1 |
| 5/16/09 | 5 |
| 5/16/09 | 4.7 |
| 5/16/09 | 4.6 |
| 5/16/09 | 4.9 |
| 5/16/09 | 3 |
| 5/16/09 | 3 |
| 5/16/09 | 2.7 |
| 5/16/09 | 2.9 |
| 5/16/09 | 2.6 |
| 5/16/09 | 2.7 |
| 5/16/09 | 2.7 |
| 5/16/09 | 2.6 |
| 5/16/09 | 2.5 |
| 5/16/09 | 1.6 |
| 5/16/09 | 2.9 |
| 5/16/09 | 2.2 |
| 5/16/09 | 2.3 |
| 5/16/09 | 1.9 |
| 5/16/09 | 2.4 |
| 5/16/09 | 1.8 |
| 5/16/09 | 1.9 |
| 5/16/09 | 2.1 |
| 5/16/09 | 2.5 |
| 5/16/09 | 2.7 |
| 5/16/09 | 2.2 |
| 5/16/09 | 2 |
| 5/16/09 | 2.4 |
| 5/16/09 | 3.5 |
| 5/15/09 | 2.6 |
| 5/15/09 | 3 |
| 5/15/09 | 1.8 |
| 5/15/09 | 3.3 |
| 5/15/09 | 2.6 |
| 5/15/09 | 2.2 |
| 5/15/09 | 3 |
| 5/15/09 | 1.5 |
| 5/15/09 | 3.7 |
| 5/15/09 | 3.1 |
| 5/15/09 | 3.6 |
| 5/15/09 | 2.2 |
| 5/15/09 | 3.4 |
| 5/15/09 | 3.4 |
| 5/15/09 | 2.7 |
| 5/15/09 | 3.2 |
| 5/15/09 | 2.6 |
| 5/15/09 | 3.2 |
| 5/15/09 | 2.9 |
| 5/15/09 | 1.6 |
| 5/15/09 | 3.5 |
| 5/15/09 | 3 |
| 5/15/09 | 3.2 |
| 5/15/09 | 2.1 |
| 5/15/09 | 3.5 |
| 5/15/09 | 4.4 |
| 5/15/09 | 3.6 |
| 5/15/09 | 3.5 |
| 5/15/09 | 3.6 |
| 5/15/09 | 3.3 |
| 5/15/09 | 4.2 |
| 5/15/09 | 3.6 |
| 5/15/09 | 4 |
| 5/15/09 | 4.4 |
| 5/15/09 | 4.8 |
| 5/15/09 | 4 |
| 5/15/09 | 4.4 |
| 5/15/09 | 3.2 |
| 5/15/09 | 3.7 |
| 5/15/09 | 3.9 |
| 5/15/09 | 3.5 |
| 5/15/09 | 3.3 |
| 5/15/09 | 4 |
| 5/15/09 | 3.4 |
| 5/15/09 | 3.2 |
| 5/15/09 | 3.9 |
| 5/15/09 | 4.4 |
| 5/15/09 | 4.4 |
| 5/14/09 | 3.1 |
| 5/14/09 | 3.7 |
| 5/14/09 | 4.3 |
| 5/14/09 | 3.1 |
| 5/14/09 | 3 |
| 5/14/09 | 5 |
| 5/14/09 | 5.5 |
| 5/14/09 | 5.5 |
| 5/14/09 | 5.6 |
| 5/14/09 | 5.7 |
| 5/14/09 | 4.9 |
| 5/14/09 | 6.6 |
| 5/14/09 | 7.1 |
| 5/14/09 | 5.8 |
| 5/14/09 | 5.2 |
| 5/14/09 | 4.2 |
| 5/14/09 | 5.9 |
| 5/14/09 | 6.3 |
| 5/14/09 | 4.9 |
| 5/14/09 | 5.2 |
| 5/14/09 | 5.7 |
| 5/14/09 | 5.6 |
| 5/14/09 | 5.5 |
| 5/14/09 | 5.7 |
| 5/14/09 | 6 |
| 5/14/09 | 6.4 |
| 5/14/09 | 6.1 |
| 5/14/09 | 5.8 |
| 5/14/09 | 5.2 |
| 5/14/09 | 5.1 |
| 5/14/09 | 5.3 |
| 5/14/09 | 5.2 |
| 5/14/09 | 5 |
| 5/14/09 | 4.2 |
| 5/14/09 | 3.4 |
| 5/14/09 | 4.6 |
| 5/14/09 | 3.9 |
| 5/14/09 | 5 |
| 5/14/09 | 4.7 |
| 5/14/09 | 4.5 |
| 5/14/09 | 4.3 |
| 5/14/09 | 4.7 |
| 5/14/09 | 4.7 |
| 5/14/09 | 4.7 |
| 5/14/09 | 5.2 |
| 5/14/09 | 5 |
| 5/14/09 | 5 |
| 5/14/09 | 5.4 |
| 5/13/09 | 6.1 |
| 5/13/09 | 5.9 |
| 5/13/09 | 6.1 |
| 5/13/09 | 6.2 |
| 5/13/09 | 6.4 |
| 5/13/09 | 6 |
| 5/13/09 | 5.6 |
| 5/13/09 | 5.6 |
| 5/13/09 | 5.6 |
| 5/13/09 | 5.7 |
| 5/13/09 | 5.9 |
| 5/13/09 | 5.5 |
| 5/13/09 | 5.6 |
| 5/13/09 | 5 |
| 5/13/09 | 5.6 |
| 5/13/09 | 6.2 |
| 5/13/09 | 5.7 |
| 5/13/09 | 5 |
| 5/13/09 | 5.4 |
| 5/13/09 | 5.9 |
| 5/13/09 | 5.4 |
| 5/13/09 | 5 |
| 5/13/09 | 5.7 |
| 5/13/09 | 5.6 |
| 5/13/09 | 6 |
| 5/13/09 | 6.6 |
| 5/13/09 | 7.8 |
| 5/13/09 | 6.4 |
| 5/13/09 | 5.9 |
| 5/13/09 | 5.5 |
| 5/13/09 | 4.9 |
| 5/13/09 | 4.9 |
| 5/13/09 | 4.8 |
| 5/13/09 | 5.2 |
| 5/13/09 | 3.8 |
| 5/13/09 | 4.6 |
| 5/13/09 | 4.3 |
| 5/13/09 | 4.4 |
| 5/13/09 | 4.4 |
| 5/13/09 | 4.5 |
| 5/13/09 | 4.5 |
| 5/13/09 | 4.2 |
| 5/13/09 | 5.3 |
| 5/13/09 | 4.9 |
| 5/13/09 | 5.1 |
| 5/13/09 | 4.5 |
| 5/13/09 | 4.9 |
| 5/13/09 | 4.6 |
| 5/12/09 | 5.1 |
| 5/12/09 | 5.1 |
| 5/12/09 | 4.6 |
| 5/12/09 | 4.7 |
| 5/12/09 | 5.9 |
| 5/12/09 | 5.3 |
| 5/12/09 | 5.4 |
| 5/12/09 | 5 |
| 5/12/09 | 5.9 |
| 5/12/09 | 6.6 |
| 5/12/09 | 6.9 |
| 5/12/09 | 6.4 |
| 5/12/09 | 6.1 |
| 5/12/09 | 6.3 |
| 5/12/09 | 5.5 |
| 5/12/09 | 6.7 |
| 5/12/09 | 6.7 |
| 5/12/09 | 6.2 |
| 5/12/09 | 7.1 |
| 5/12/09 | 7 |
| 5/12/09 | 9.7 |
| 5/12/09 | 9.5 |
| 5/12/09 | 8 |
| 5/12/09 | 8.9 |
| 5/12/09 | 8 |
| 5/12/09 | 10.9 |
| 5/12/09 | 10 |
| 5/12/09 | 10 |
| 5/12/09 | 7.9 |
| 5/12/09 | 9.7 |
| 5/12/09 | 9.8 |
| 5/12/09 | 9.5 |
| 5/12/09 | 9 |
| 5/12/09 | 7.9 |
| 5/12/09 | 8.2 |
| 5/12/09 | 7.6 |
| 5/12/09 | 7.4 |
| 5/12/09 | 7.1 |
| 5/12/09 | 7 |
| 5/12/09 | 6.3 |
| 5/12/09 | 6.1 |
| 5/12/09 | 6.1 |
| 5/12/09 | 4.4 |
| 5/12/09 | 4.4 |
| 5/12/09 | 4.2 |
| 5/12/09 | 4.5 |
| 5/12/09 | 4.6 |
| 5/12/09 | 4.7 |
| 5/11/09 | 4.7 |
| 5/11/09 | 4.5 |
| 5/11/09 | 4.1 |
| 5/11/09 | 5.1 |
| 5/11/09 | 4.9 |
| 5/11/09 | 4.5 |
| 5/11/09 | 4.9 |
| 5/11/09 | 6.9 |
| 5/11/09 | 6.2 |
| 5/11/09 | 5.9 |
| 5/11/09 | 6.4 |
| 5/11/09 | 4.1 |
| 5/11/09 | 6.7 |
| 5/11/09 | 8.1 |
| 5/11/09 | 7.2 |
| 5/11/09 | 7.8 |
| 5/11/09 | 6.3 |
| 5/11/09 | 7.1 |
| 5/11/09 | 7 |
| 5/11/09 | 8.3 |
| 5/11/09 | 6.9 |
| 5/11/09 | 8 |
| 5/11/09 | 9.4 |
| 5/11/09 | 7.3 |
| 5/11/09 | 8.6 |
| 5/11/09 | 8.5 |
| 5/11/09 | 8.3 |
| 5/11/09 | 8 |
| 5/11/09 | 8.2 |
| 5/11/09 | 9.1 |
| 5/11/09 | 7.7 |
| 5/11/09 | 8 |
| 5/11/09 | 8.1 |
| 5/11/09 | 7.5 |
| 5/11/09 | 7.5 |
| 5/11/09 | 8.7 |
| 5/11/09 | 7.6 |
| 5/11/09 | 7.1 |
| 5/11/09 | 7.7 |
| 5/11/09 | 8.1 |
| 5/11/09 | 7.7 |
| 5/11/09 | 7.1 |
| 5/11/09 | 7.3 |
| 5/11/09 | 8.2 |
| 5/11/09 | 9.1 |
| 5/11/09 | 8.2 |
| 5/11/09 | 7.7 |
| 5/11/09 | 6.4 |
| 5/10/09 | 7.3 |
| 5/10/09 | 7 |
| 5/10/09 | 7.4 |
| 5/10/09 | 6.1 |
| 5/10/09 | 7.2 |
| 5/10/09 | 5.7 |
| 5/10/09 | 5.9 |
| 5/10/09 | 7.8 |
| 5/10/09 | 7.8 |
| 5/10/09 | 7.6 |
| 5/10/09 | 8.6 |
| 5/10/09 | 8.4 |
| 5/10/09 | 7.7 |
| 5/10/09 | 8.6 |
| 5/10/09 | 7.5 |
| 5/10/09 | 6.6 |
| 5/10/09 | 6.8 |
| 5/10/09 | 6.2 |
| 5/10/09 | 5.7 |
| 5/10/09 | 5.8 |
| 5/10/09 | 5.7 |
| 5/10/09 | 5.7 |
| 5/10/09 | 5.9 |
| 5/10/09 | 5.5 |
| 5/10/09 | 5.7 |
| 5/10/09 | 6.2 |
| 5/10/09 | 5.5 |
| 5/10/09 | 5.3 |
| 5/10/09 | 5.4 |
| 5/10/09 | 6.3 |
| 5/10/09 | 5.3 |
| 5/10/09 | 4.8 |
| 5/10/09 | 4.4 |
| 5/10/09 | 4.6 |
| 5/10/09 | 3.8 |
| 5/10/09 | 3.7 |
| 5/10/09 | 2.9 |
| 5/10/09 | 3.4 |
| 5/10/09 | 3.7 |
| 5/10/09 | 3.5 |
| 5/10/09 | 3.6 |
| 5/10/09 | 3.6 |
| 5/10/09 | 3.7 |
| 5/10/09 | 3.2 |
| 5/10/09 | 3.3 |
| 5/10/09 | 4 |
| 5/10/09 | 3.9 |
| 5/10/09 | 3.9 |
| 5/9/09 | 4.4 |
| 5/9/09 | 3.9 |
| 5/9/09 | 4.2 |
| 5/9/09 | 4.3 |
| 5/9/09 | 4.3 |
| 5/9/09 | 3.5 |
| 5/9/09 | 4.5 |
| 5/9/09 | 4.2 |
| 5/9/09 | 4.2 |
| 5/9/09 | 4.7 |
| 5/9/09 | 4.6 |
| 5/9/09 | 4.5 |
| 5/9/09 | 4.5 |
| 5/9/09 | 4.7 |
| 5/9/09 | 4.5 |
| 5/9/09 | 3.9 |
| 5/9/09 | 4.7 |
| 5/9/09 | 3.6 |
| 5/9/09 | 3.2 |
| 5/9/09 | 3 |
| 5/9/09 | 2.7 |
| 5/9/09 | 2.6 |
| 5/9/09 | 2.7 |
| 5/9/09 | 3.2 |
| 5/9/09 | 2.9 |
| 5/9/09 | 2.5 |
| 5/9/09 | 2.2 |
| 5/9/09 | 2.4 |
| 5/9/09 | 2.4 |
| 5/9/09 | 1.9 |
| 5/9/09 | 2 |
| 5/9/09 | 1.9 |
| 5/9/09 | 1.6 |
| 5/9/09 | 2 |
| 5/9/09 | 1.9 |
| 5/9/09 | 2.1 |
| 5/9/09 | 1.8 |
| 5/9/09 | 2.4 |
| 5/9/09 | 2 |
| 5/9/09 | 1.7 |
| 5/9/09 | 2.3 |
| 5/9/09 | 2.5 |
| 5/9/09 | 2.2 |
| 5/9/09 | 2.5 |
| 5/9/09 | 2.4 |
| 5/9/09 | 2 |
| 5/9/09 | 3.3 |
| 5/9/09 | 2.4 |
| 5/8/09 | 2.1 |
| 5/8/09 | 2.2 |
| 5/8/09 | 1.9 |
| 5/8/09 | 2.3 |
| 5/8/09 | 2.9 |
| 5/8/09 | 2.6 |
| 5/8/09 | 2.6 |
| 5/8/09 | 4.1 |
| 5/8/09 | 2.8 |
| 5/8/09 | 3 |
| 5/8/09 | 3.2 |
| 5/8/09 | 3.8 |
| 5/8/09 | 4 |
| 5/8/09 | 3.1 |
| 5/8/09 | 3.8 |
| 5/8/09 | 3.1 |
| 5/8/09 | 3.3 |
| 5/8/09 | 2.3 |
| 5/8/09 | 2.6 |
| 5/8/09 | 3.1 |
| 5/8/09 | 3.3 |
| 5/8/09 | 3.2 |
| 5/8/09 | 2.7 |
| 5/8/09 | 2.6 |
| 5/8/09 | 2.8 |
| 5/8/09 | 3.2 |
| 5/8/09 | 2.8 |
| 5/8/09 | 2.8 |
| 5/8/09 | 2.7 |
| 5/8/09 | 2.1 |
| 5/8/09 | 1.9 |
| 5/8/09 | 2.4 |
| 5/8/09 | 2.3 |
| 5/8/09 | 2.4 |
| 5/8/09 | 2.8 |
| 5/8/09 | 2.6 |
| 5/8/09 | 2.4 |
| 5/8/09 | 2.3 |
| 5/8/09 | 3.2 |
| 5/8/09 | 2.5 |
| 5/8/09 | 2.4 |
| 5/8/09 | 2.9 |
| 5/8/09 | 3.2 |
| 5/8/09 | 2.7 |
| 5/8/09 | 2.8 |
| 5/8/09 | 3 |
| 5/8/09 | 3.4 |
| 5/8/09 | 3.2 |
| 5/7/09 | 3.1 |
| 5/7/09 | 3.3 |
| 5/7/09 | 3.5 |
| 5/7/09 | 3.5 |
| 5/7/09 | 4.1 |
| 5/7/09 | 3.8 |
| 5/7/09 | 3.2 |
| 5/7/09 | 4.4 |
| 5/7/09 | 4.5 |
| 5/7/09 | 3.9 |
| 5/7/09 | 3.8 |
| 5/7/09 | 4.1 |
| 5/7/09 | 4 |
| 5/7/09 | 4.3 |
| 5/7/09 | 4.2 |
| 5/7/09 | 4.9 |
| 5/7/09 | 5.6 |
| 5/7/09 | 5.1 |
| 5/7/09 | 4.8 |
| 5/7/09 | 5 |
| 5/7/09 | 4 |
| 5/7/09 | 5 |
| 5/7/09 | 4.9 |
| 5/7/09 | 4.5 |
| 5/7/09 | 3.2 |
| 5/7/09 | 4.5 |
| 5/7/09 | 5 |
| 5/7/09 | 5.1 |
| 5/7/09 | 4.1 |
| 5/7/09 | 5 |
| 5/7/09 | 4.8 |
| 5/7/09 | 4.5 |
| 5/7/09 | 4 |
| 5/7/09 | 4.7 |
| 5/7/09 | 4.4 |
| 5/7/09 | 5.2 |
| 5/7/09 | 4.4 |
| 5/7/09 | 4.3 |
| 5/7/09 | 4.9 |
| 5/7/09 | 4.7 |
| 5/7/09 | 4.8 |
| 5/7/09 | 5.1 |
| 5/7/09 | 4.8 |
| 5/7/09 | 4.5 |
| 5/7/09 | 4.5 |
| 5/7/09 | 4.7 |
| 5/7/09 | 4.5 |
| 5/7/09 | 4.5 |
| 5/6/09 | 3.2 |
| 5/6/09 | 4.6 |
| 5/6/09 | 4.4 |
| 5/6/09 | 4.2 |
| 5/6/09 | 4.2 |
| 5/6/09 | 4.4 |
| 5/6/09 | 4.3 |
| 5/6/09 | 4.7 |
| 5/6/09 | 4.8 |
| 5/6/09 | 4 |
| 5/6/09 | 4.5 |
| 5/6/09 | 4.4 |
| 5/6/09 | 4.6 |
| 5/6/09 | 4.7 |
| 5/6/09 | 4.9 |
| 5/6/09 | 4.7 |
| 5/6/09 | 4.6 |
| 5/6/09 | 5.3 |
| 5/6/09 | 5.2 |
| 5/6/09 | 5.7 |
| 5/6/09 | 5.6 |
| 5/6/09 | 5.8 |
| 5/6/09 | 5.4 |
| 5/6/09 | 7.2 |
| 5/6/09 | 7.2 |
| 5/6/09 | 5.7 |
| 5/6/09 | 5.3 |
| 5/6/09 | 5 |
| 5/6/09 | 6 |
| 5/6/09 | 5.5 |
| 5/6/09 | 7 |
| 5/6/09 | 5.9 |
| 5/6/09 | 5.3 |
| 5/6/09 | 6 |
| 5/6/09 | 5.5 |
| 5/6/09 | 6.1 |
| 5/6/09 | 5.6 |
| 5/6/09 | 5.5 |
| 5/6/09 | 5.6 |
| 5/6/09 | 6.9 |
| 5/6/09 | 4.7 |
| 5/6/09 | 7.1 |
| 5/6/09 | 5.5 |
| 5/6/09 | 5.9 |
| 5/6/09 | 4.3 |
| 5/6/09 | 4.2 |
| 5/6/09 | 5.3 |
| 5/6/09 | 5.8 |
| 5/5/09 | 5.2 |
| 5/5/09 | 6 |
| 5/5/09 | 6.8 |
| 5/5/09 | 7.6 |
| 5/5/09 | 7.1 |
| 5/5/09 | 8.2 |
| 5/5/09 | 6.6 |
| 5/5/09 | 7.3 |
| 5/5/09 | 7.8 |
| 5/5/09 | 7.4 |
| 5/5/09 | 6.8 |
| 5/5/09 | 6.6 |
| 5/5/09 | 7.4 |
| 5/5/09 | 7.8 |
| 5/5/09 | 6.9 |
| 5/5/09 | 8.9 |
| 5/5/09 | 8.4 |
| 5/5/09 | 9.8 |
| 5/5/09 | 9 |
| 5/5/09 | 9.8 |
| 5/5/09 | 9.6 |
| 5/5/09 | 9.8 |
| 5/5/09 | 8.8 |
| 5/5/09 | 8.9 |
| 5/5/09 | 10 |
| 5/5/09 | 9.1 |
| 5/5/09 | 8.9 |
| 5/5/09 | 9.8 |
| 5/5/09 | 7.9 |
| 5/5/09 | 10.5 |
| 5/5/09 | 8.7 |
| 5/5/09 | 8.4 |
| 5/5/09 | 8.5 |
| 5/5/09 | 8.7 |
| 5/5/09 | 6.9 |
| 5/5/09 | 7.7 |
| 5/5/09 | 7.8 |
| 5/5/09 | 7.5 |
| 5/5/09 | 7.2 |
| 5/5/09 | 6.8 |
| 5/5/09 | 8.2 |
| 5/5/09 | 7.5 |
| 5/5/09 | 7.5 |
| 5/5/09 | 7.3 |
| 5/5/09 | 7 |
| 5/5/09 | 5.2 |
| 5/5/09 | 5.7 |
| 5/5/09 | 6.7 |
| 5/4/09 | 7.1 |
| 5/4/09 | 5.4 |
| 5/4/09 | 7 |
| 5/4/09 | 6.1 |
| 5/4/09 | 6.1 |
| 5/4/09 | 6.7 |
| 5/4/09 | 6.6 |
| 5/4/09 | 6 |
| 5/4/09 | 6 |
| 5/4/09 | 7.1 |
| 5/4/09 | 6 |
| 5/4/09 | 7 |
| 5/4/09 | 6.8 |
| 5/4/09 | 6.3 |
| 5/4/09 | 6.6 |
| 5/4/09 | 7.1 |
| 5/4/09 | 7.1 |
| 5/4/09 | 8.6 |
| 5/4/09 | 8.4 |
| 5/4/09 | 8.7 |
| 5/4/09 | 7.9 |
| 5/4/09 | 8.2 |
| 5/4/09 | 6.9 |
| 5/4/09 | 6 |
| 5/4/09 | 7.1 |
| 5/4/09 | 5.4 |
| 5/4/09 | 5 |
| 5/4/09 | 4.1 |
| 5/4/09 | 4.3 |
| 5/4/09 | 4 |
| 5/4/09 | 3.2 |
| 5/4/09 | 2.8 |
| 5/4/09 | 2.8 |
| 5/4/09 | 1.9 |
| 5/4/09 | 2.9 |
| 5/4/09 | 2.3 |
| 5/4/09 | 3.5 |
| 5/4/09 | 2.7 |
| 5/4/09 | 2.3 |
| 5/4/09 | 2.4 |
| 5/4/09 | 2.4 |
| 5/4/09 | 2.2 |
| 5/4/09 | 2.6 |
| 5/4/09 | 2.7 |
| 5/4/09 | 2.7 |
| 5/4/09 | 2.4 |
| 5/4/09 | 2.4 |
| 5/4/09 | 2.8 |
| 5/3/09 | 2.7 |
| 5/3/09 | 2.5 |
| 5/3/09 | 2 |
| 5/3/09 | 2.5 |
| 5/3/09 | 3.3 |
| 5/3/09 | 2.7 |
| 5/3/09 | 2.6 |
| 5/3/09 | 2.9 |
| 5/3/09 | 3 |
| 5/3/09 | 3 |
| 5/3/09 | 2.3 |
| 5/3/09 | 2.4 |
| 5/3/09 | 2.2 |
| 5/3/09 | 3.1 |
| 5/3/09 | 3.4 |
| 5/3/09 | 3.3 |
| 5/3/09 | 4 |
| 5/3/09 | 4.6 |
| 5/3/09 | 4.6 |
| 5/3/09 | 5.1 |
| 5/3/09 | 5 |
| 5/3/09 | 5.6 |
| 5/3/09 | 5 |
| 5/3/09 | 5.5 |
| 5/3/09 | 5.7 |
| 5/3/09 | 4 |
| 5/3/09 | 4.3 |
| 5/3/09 | 5.1 |
| 5/3/09 | 5.1 |
| 5/3/09 | 4.6 |
| 5/3/09 | 4.3 |
| 5/3/09 | 2.9 |
| 5/3/09 | 2.6 |
| 5/3/09 | 3.4 |
| 5/3/09 | 3.2 |
| 5/3/09 | 3 |
| 5/3/09 | 2.9 |
| 5/3/09 | 2.8 |
| 5/3/09 | 2.6 |
| 5/3/09 | 2.9 |
| 5/3/09 | 2.4 |
| 5/3/09 | 2.4 |
| 5/3/09 | 2 |
| 5/3/09 | 2.3 |
| 5/3/09 | 2.1 |
| 5/3/09 | 2.4 |
| 5/3/09 | 2.1 |
| 5/3/09 | 2.3 |
| 5/2/09 | 2.2 |
| 5/2/09 | 2.7 |
| 5/2/09 | 2.7 |
| 5/2/09 | 2.5 |
| 5/2/09 | 3.4 |
| 5/2/09 | 2.7 |
| 5/2/09 | 2.2 |
| 5/2/09 | 2.2 |
| 5/2/09 | 2.1 |
| 5/2/09 | 2.5 |
| 5/2/09 | 2.2 |
| 5/2/09 | 2.6 |
| 5/2/09 | 2.2 |
| 5/2/09 | 2.4 |
| 5/2/09 | 2.6 |
| 5/2/09 | 2.8 |
| 5/2/09 | 3 |
| 5/2/09 | 2.4 |
| 5/2/09 | 2.1 |
| 5/2/09 | 2.2 |
| 5/2/09 | 2.7 |
| 5/2/09 | 2.4 |
| 5/2/09 | 2.3 |
| 5/2/09 | 2 |
| 5/2/09 | 2.2 |
| 5/2/09 | 1.8 |
| 5/2/09 | 2 |
| 5/2/09 | 1.8 |
| 5/2/09 | 2.1 |
| 5/2/09 | 1.7 |
| 5/2/09 | 1.8 |
| 5/2/09 | 2.2 |
| 5/2/09 | 1.8 |
| 5/2/09 | 1.9 |
| 5/2/09 | 2 |
| 5/2/09 | 1.8 |
| 5/2/09 | 1.9 |
| 5/2/09 | 1.9 |
| 5/2/09 | 1.5 |
| 5/2/09 | 1.8 |
| 5/2/09 | 2 |
| 5/2/09 | 2.1 |
| 5/2/09 | 2.3 |
| 5/2/09 | 1.9 |
| 5/2/09 | 2.1 |
| 5/2/09 | 1.7 |
| 5/2/09 | 1.8 |
| 5/2/09 | 2.2 |
| 5/1/09 | 1.8 |
| 5/1/09 | 2.2 |
| 5/1/09 | 2 |
| 5/1/09 | 1.9 |
| 5/1/09 | 2.5 |
| 5/1/09 | 2.5 |
| 5/1/09 | 3.6 |
| 5/1/09 | 4 |
| 5/1/09 | 4 |
| 5/1/09 | 4.1 |
| 5/1/09 | 3.8 |
| 5/1/09 | 3.7 |
| 5/1/09 | 3.4 |
| 5/1/09 | 3.7 |
| 5/1/09 | 2.6 |
| 5/1/09 | 2.6 |
| 5/1/09 | 2.9 |
| 5/1/09 | 2.9 |
| 5/1/09 | 2.5 |
| 5/1/09 | 2.3 |
| 5/1/09 | 2.6 |
| 5/1/09 | 2.7 |
| 5/1/09 | 2.7 |
| 5/1/09 | 2.5 |
| 5/1/09 | 2.1 |
| 5/1/09 | 2.1 |
| 5/1/09 | 2.2 |
| 5/1/09 | 1.9 |
| 5/1/09 | 1.9 |
| 5/1/09 | 2.1 |
| 5/1/09 | 2 |
| 5/1/09 | 1.8 |
| 5/1/09 | 2 |
| 5/1/09 | 2.2 |
| 5/1/09 | 2.4 |
| 5/1/09 | 2.4 |
| 5/1/09 | 1.9 |
| 5/1/09 | 2.1 |
| 5/1/09 | 2.4 |
| 5/1/09 | 2.6 |
| 5/1/09 | 2.3 |
| 5/1/09 | 2.8 |
| 5/1/09 | 2.1 |
| 5/1/09 | 2.6 |
| 5/1/09 | 2.4 |
| 5/1/09 | 2.3 |
| 5/1/09 | 2.4 |
| 5/1/09 | 2.3 |
| 4/30/09 | 2.4 |
| 4/30/09 | 2.6 |
| 4/30/09 | 2.7 |
| 4/30/09 | 2.4 |
| 4/30/09 | 2.5 |
| 4/30/09 | 2.7 |
| 4/30/09 | 2.1 |
| 4/30/09 | 2.2 |
| 4/30/09 | 2.2 |
| 4/30/09 | 2.5 |
| 4/30/09 | 2.4 |
| 4/30/09 | 2 |
| 4/30/09 | 2.9 |
| 4/30/09 | 3 |
| 4/30/09 | 2.2 |
| 4/30/09 | 2.4 |
| 4/30/09 | 2.5 |
| 4/30/09 | 2.7 |
| 4/30/09 | 2.1 |
| 4/30/09 | 2.6 |
| 4/30/09 | 3.4 |
| 4/30/09 | 2.7 |
| 4/30/09 | 2.8 |
| 4/30/09 | 3.1 |
| 4/30/09 | 3.5 |
| 4/30/09 | 3.2 |
| 4/30/09 | 2.8 |
| 4/30/09 | 3.3 |
| 4/30/09 | 3.1 |
| 4/30/09 | 3.1 |
| 4/30/09 | 3 |
| 4/30/09 | 3 |
| 4/30/09 | 3 |
| 4/30/09 | 3 |
| 4/30/09 | 3.1 |
| 4/30/09 | 2.9 |
| 4/30/09 | 3.6 |
| 4/30/09 | 3.5 |
| 4/30/09 | 3.4 |
| 4/30/09 | 3.3 |
| 4/30/09 | 3.1 |
| 4/30/09 | 3.2 |
| 4/30/09 | 3.9 |
| 4/30/09 | 3.8 |
| 4/30/09 | 4.1 |
| 4/30/09 | 3 |
| 4/30/09 | 2.8 |
| 4/30/09 | 2.5 |
| 4/29/09 | 2.4 |
| 4/29/09 | 2.4 |
| 4/29/09 | 2.3 |
| 4/29/09 | 2.6 |
| 4/29/09 | 2.6 |
| 4/29/09 | 2.7 |
| 4/29/09 | 2.3 |
| 4/29/09 | 2.4 |
| 4/29/09 | 2.1 |
| 4/29/09 | 2.1 |
| 4/29/09 | 0.7 |
| 4/29/09 | 1.7 |
| 4/29/09 | 1.9 |
| 4/29/09 | 1.4 |
| 4/29/09 | 1 |
| 4/29/09 | 1.1 |
| 4/29/09 | 1.9 |
| 4/29/09 | 1.3 |
| 4/29/09 | 0.9 |
| 4/29/09 | 1.1 |
| 4/29/09 | 1.4 |
| 4/29/09 | 1.4 |
| 4/29/09 | 1.1 |
| 4/29/09 | 0.4 |
| 4/29/09 | 1.7 |
| 4/29/09 | 1.2 |
| 4/29/09 | 0.8 |
| 4/29/09 | 1 |
| 4/29/09 | 2.5 |
| 4/29/09 | 1.5 |
| 4/29/09 | 0.4 |
| 4/29/09 | 0.8 |
| 4/29/09 | 1.4 |
| 4/29/09 | 1.3 |
| 4/29/09 | 0.9 |
| 4/29/09 | 1.1 |
| 4/29/09 | 2.1 |
| 4/29/09 | 1.1 |
| 4/29/09 | 1.2 |
| 4/29/09 | 1.2 |
| 4/29/09 | 1.7 |
| 4/29/09 | 1.1 |
| 4/29/09 | 1.4 |
| 4/29/09 | 1 |
| 4/29/09 | 0.8 |
| 4/29/09 | 2 |
| 4/29/09 | 1.7 |
| 4/29/09 | 1.2 |
| 4/28/09 | 0.2 |
| 4/28/09 | 1.4 |
| 4/28/09 | 1.6 |
| 4/28/09 | 1.4 |
| 4/28/09 | 1.3 |
| 4/28/09 | 1.2 |
| 4/28/09 | 1.9 |
| 4/28/09 | 0.9 |
| 4/28/09 | 1.1 |
| 4/28/09 | 1 |
| 4/28/09 | 1.7 |
| 4/28/09 | 1.1 |
| 4/28/09 | 0.8 |
| 4/28/09 | 2.3 |
| 4/28/09 | 2.3 |
| 4/28/09 | 2.1 |
| 4/28/09 | 1.1 |
| 4/28/09 | 1.5 |
| 4/28/09 | 1.1 |
| 4/28/09 | 1.4 |
| 4/28/09 | 0.3 |
| 4/28/09 | 1.5 |
| 4/28/09 | 2.2 |
| 4/28/09 | 1.6 |
| 4/28/09 | 1.5 |
| 4/28/09 | 0.1 |
| 4/28/09 | 0 |
| 4/28/09 | 1.1 |
| 4/28/09 | 0.1 |
| 4/28/09 | 1.4 |
| 4/28/09 | 1.6 |
| 4/28/09 | 1.3 |
| 4/28/09 | 1.5 |
| 4/28/09 | 0.8 |
| 4/28/09 | 1.6 |
| 4/28/09 | 1 |
| 4/28/09 | 1.7 |
| 4/28/09 | 1.2 |
| 4/28/09 | 1 |
| 4/28/09 | 0.8 |
| 4/28/09 | 1.7 |
| 4/28/09 | 1.8 |
| 4/28/09 | 1 |
| 4/28/09 | 1.3 |
| 4/28/09 | 1.5 |
| 4/28/09 | 1.1 |
| 4/28/09 | 0.7 |
| 4/28/09 | 0.7 |
| 4/27/09 | 0.8 |
| 4/27/09 | 0.7 |
| 4/27/09 | 1.3 |
| 4/27/09 | 0.7 |
| 4/27/09 | 1.3 |
| 4/27/09 | 1.8 |
| 4/27/09 | 1.1 |
| 4/27/09 | 1.7 |
| 4/27/09 | 1.9 |
| 4/27/09 | 0.6 |
| 4/27/09 | 1.7 |
| 4/27/09 | 0.8 |
| 4/27/09 | 1.8 |
| 4/27/09 | 1.1 |
| 4/27/09 | 1.3 |
| 4/27/09 | 1.1 |
| 4/27/09 | 1.2 |
| 4/27/09 | 0.8 |